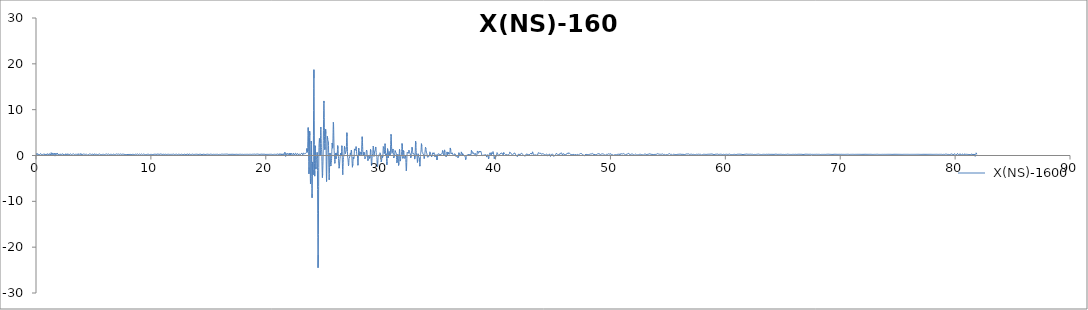
| Category |  X(NS)-1600 |
|---|---|
| 0.0 | 0 |
| 0.01 | -0.097 |
| 0.02 | -0.132 |
| 0.03 | -0.1 |
| 0.04 | -0.009 |
| 0.05 | 0.124 |
| 0.06 | 0.271 |
| 0.07 | 0.408 |
| 0.08 | 0.514 |
| 0.09 | 0.578 |
| 0.1 | 0.593 |
| 0.11 | 0.562 |
| 0.12 | 0.488 |
| 0.13 | 0.382 |
| 0.14 | 0.255 |
| 0.15 | 0.122 |
| 0.16 | 0.004 |
| 0.17 | -0.084 |
| 0.18 | -0.125 |
| 0.19 | -0.114 |
| 0.2 | -0.053 |
| 0.21 | 0.045 |
| 0.22 | 0.163 |
| 0.23 | 0.277 |
| 0.24 | 0.372 |
| 0.25 | 0.434 |
| 0.26 | 0.459 |
| 0.27 | 0.45 |
| 0.28 | 0.416 |
| 0.29 | 0.364 |
| 0.3 | 0.307 |
| 0.31 | 0.252 |
| 0.32 | 0.208 |
| 0.33 | 0.181 |
| 0.34 | 0.175 |
| 0.35 | 0.193 |
| 0.36 | 0.232 |
| 0.37 | 0.287 |
| 0.38 | 0.348 |
| 0.39 | 0.402 |
| 0.4 | 0.438 |
| 0.41 | 0.447 |
| 0.42 | 0.426 |
| 0.43 | 0.378 |
| 0.44 | 0.311 |
| 0.45 | 0.237 |
| 0.46 | 0.168 |
| 0.47 | 0.116 |
| 0.48 | 0.086 |
| 0.49 | 0.078 |
| 0.5 | 0.09 |
| 0.51 | 0.115 |
| 0.52 | 0.145 |
| 0.53 | 0.173 |
| 0.54 | 0.197 |
| 0.55 | 0.214 |
| 0.56 | 0.226 |
| 0.57 | 0.233 |
| 0.58 | 0.238 |
| 0.59 | 0.24 |
| 0.6 | 0.242 |
| 0.61 | 0.244 |
| 0.62 | 0.248 |
| 0.63 | 0.257 |
| 0.64 | 0.274 |
| 0.65 | 0.304 |
| 0.66 | 0.344 |
| 0.67 | 0.39 |
| 0.68 | 0.435 |
| 0.69 | 0.468 |
| 0.7 | 0.479 |
| 0.71 | 0.463 |
| 0.72 | 0.419 |
| 0.73 | 0.354 |
| 0.74 | 0.28 |
| 0.75 | 0.208 |
| 0.76 | 0.151 |
| 0.77 | 0.115 |
| 0.78 | 0.101 |
| 0.79 | 0.106 |
| 0.8 | 0.124 |
| 0.81 | 0.148 |
| 0.82 | 0.175 |
| 0.83 | 0.202 |
| 0.84 | 0.229 |
| 0.85 | 0.252 |
| 0.86 | 0.27 |
| 0.87 | 0.279 |
| 0.88 | 0.275 |
| 0.89 | 0.256 |
| 0.9 | 0.225 |
| 0.91 | 0.187 |
| 0.92 | 0.154 |
| 0.93 | 0.134 |
| 0.94 | 0.137 |
| 0.95 | 0.164 |
| 0.96 | 0.214 |
| 0.97 | 0.279 |
| 0.98 | 0.349 |
| 0.99 | 0.414 |
| 1.0 | 0.468 |
| 1.01 | 0.503 |
| 1.02 | 0.516 |
| 1.03 | 0.506 |
| 1.04 | 0.469 |
| 1.05 | 0.405 |
| 1.06 | 0.316 |
| 1.07 | 0.21 |
| 1.08 | 0.1 |
| 1.09 | 0.003 |
| 1.1 | -0.062 |
| 1.11 | -0.079 |
| 1.12 | -0.043 |
| 1.13 | 0.044 |
| 1.14 | 0.166 |
| 1.15 | 0.298 |
| 1.16 | 0.416 |
| 1.17 | 0.497 |
| 1.18 | 0.526 |
| 1.19 | 0.502 |
| 1.2 | 0.43 |
| 1.21 | 0.326 |
| 1.22 | 0.209 |
| 1.23 | 0.099 |
| 1.24 | 0.013 |
| 1.25 | -0.035 |
| 1.26 | -0.035 |
| 1.27 | 0.016 |
| 1.28 | 0.114 |
| 1.29 | 0.246 |
| 1.3 | 0.392 |
| 1.31 | 0.526 |
| 1.32 | 0.623 |
| 1.33 | 0.658 |
| 1.34 | 0.621 |
| 1.35 | 0.514 |
| 1.36 | 0.354 |
| 1.37 | 0.172 |
| 1.38 | 0.001 |
| 1.39 | -0.122 |
| 1.4 | -0.175 |
| 1.41 | -0.148 |
| 1.42 | -0.048 |
| 1.43 | 0.104 |
| 1.44 | 0.277 |
| 1.45 | 0.437 |
| 1.46 | 0.554 |
| 1.47 | 0.609 |
| 1.48 | 0.593 |
| 1.49 | 0.513 |
| 1.5 | 0.389 |
| 1.51 | 0.247 |
| 1.52 | 0.119 |
| 1.53 | 0.031 |
| 1.54 | 0.004 |
| 1.55 | 0.044 |
| 1.56 | 0.142 |
| 1.57 | 0.276 |
| 1.58 | 0.417 |
| 1.59 | 0.531 |
| 1.6 | 0.59 |
| 1.61 | 0.578 |
| 1.62 | 0.492 |
| 1.63 | 0.348 |
| 1.64 | 0.174 |
| 1.65 | 0.003 |
| 1.66 | -0.128 |
| 1.67 | -0.193 |
| 1.68 | -0.18 |
| 1.69 | -0.089 |
| 1.7 | 0.059 |
| 1.71 | 0.235 |
| 1.72 | 0.403 |
| 1.73 | 0.53 |
| 1.74 | 0.591 |
| 1.75 | 0.578 |
| 1.76 | 0.498 |
| 1.77 | 0.37 |
| 1.78 | 0.228 |
| 1.79 | 0.103 |
| 1.8 | 0.024 |
| 1.81 | 0.01 |
| 1.82 | 0.062 |
| 1.83 | 0.169 |
| 1.84 | 0.307 |
| 1.85 | 0.443 |
| 1.86 | 0.548 |
| 1.87 | 0.596 |
| 1.88 | 0.577 |
| 1.89 | 0.492 |
| 1.9 | 0.36 |
| 1.91 | 0.207 |
| 1.92 | 0.065 |
| 1.93 | -0.036 |
| 1.94 | -0.076 |
| 1.95 | -0.05 |
| 1.96 | 0.035 |
| 1.97 | 0.158 |
| 1.98 | 0.288 |
| 1.99 | 0.397 |
| 2.0 | 0.46 |
| 2.01 | 0.466 |
| 2.02 | 0.414 |
| 2.03 | 0.321 |
| 2.04 | 0.211 |
| 2.05 | 0.112 |
| 2.06 | 0.047 |
| 2.07 | 0.033 |
| 2.08 | 0.071 |
| 2.09 | 0.154 |
| 2.1 | 0.262 |
| 2.11 | 0.37 |
| 2.12 | 0.456 |
| 2.13 | 0.5 |
| 2.14 | 0.494 |
| 2.15 | 0.439 |
| 2.16 | 0.349 |
| 2.17 | 0.243 |
| 2.18 | 0.144 |
| 2.19 | 0.073 |
| 2.2 | 0.044 |
| 2.21 | 0.059 |
| 2.22 | 0.114 |
| 2.23 | 0.192 |
| 2.24 | 0.275 |
| 2.25 | 0.341 |
| 2.26 | 0.376 |
| 2.27 | 0.374 |
| 2.28 | 0.339 |
| 2.29 | 0.284 |
| 2.3 | 0.228 |
| 2.31 | 0.186 |
| 2.32 | 0.171 |
| 2.33 | 0.187 |
| 2.34 | 0.226 |
| 2.35 | 0.276 |
| 2.36 | 0.319 |
| 2.37 | 0.341 |
| 2.38 | 0.335 |
| 2.39 | 0.302 |
| 2.4 | 0.252 |
| 2.41 | 0.202 |
| 2.42 | 0.168 |
| 2.43 | 0.162 |
| 2.44 | 0.187 |
| 2.45 | 0.238 |
| 2.46 | 0.3 |
| 2.47 | 0.354 |
| 2.48 | 0.384 |
| 2.49 | 0.379 |
| 2.5 | 0.335 |
| 2.51 | 0.263 |
| 2.52 | 0.179 |
| 2.53 | 0.105 |
| 2.54 | 0.062 |
| 2.55 | 0.062 |
| 2.56 | 0.108 |
| 2.57 | 0.193 |
| 2.58 | 0.296 |
| 2.59 | 0.395 |
| 2.6 | 0.466 |
| 2.61 | 0.492 |
| 2.62 | 0.467 |
| 2.63 | 0.398 |
| 2.64 | 0.302 |
| 2.65 | 0.202 |
| 2.66 | 0.121 |
| 2.67 | 0.076 |
| 2.68 | 0.076 |
| 2.69 | 0.118 |
| 2.7 | 0.188 |
| 2.71 | 0.269 |
| 2.72 | 0.338 |
| 2.73 | 0.38 |
| 2.74 | 0.383 |
| 2.75 | 0.349 |
| 2.76 | 0.285 |
| 2.77 | 0.208 |
| 2.78 | 0.137 |
| 2.79 | 0.091 |
| 2.8 | 0.082 |
| 2.81 | 0.114 |
| 2.82 | 0.182 |
| 2.83 | 0.27 |
| 2.84 | 0.358 |
| 2.85 | 0.426 |
| 2.86 | 0.456 |
| 2.87 | 0.442 |
| 2.88 | 0.387 |
| 2.89 | 0.304 |
| 2.9 | 0.213 |
| 2.91 | 0.133 |
| 2.92 | 0.081 |
| 2.93 | 0.067 |
| 2.94 | 0.09 |
| 2.95 | 0.142 |
| 2.96 | 0.21 |
| 2.97 | 0.28 |
| 2.98 | 0.336 |
| 2.99 | 0.373 |
| 3.0 | 0.385 |
| 3.01 | 0.376 |
| 3.02 | 0.352 |
| 3.03 | 0.318 |
| 3.04 | 0.283 |
| 3.05 | 0.251 |
| 3.06 | 0.226 |
| 3.07 | 0.21 |
| 3.08 | 0.203 |
| 3.09 | 0.203 |
| 3.1 | 0.21 |
| 3.11 | 0.224 |
| 3.12 | 0.243 |
| 3.13 | 0.264 |
| 3.14 | 0.284 |
| 3.15 | 0.295 |
| 3.16 | 0.293 |
| 3.17 | 0.275 |
| 3.18 | 0.24 |
| 3.19 | 0.197 |
| 3.2 | 0.155 |
| 3.21 | 0.128 |
| 3.22 | 0.126 |
| 3.23 | 0.156 |
| 3.24 | 0.212 |
| 3.25 | 0.283 |
| 3.26 | 0.352 |
| 3.27 | 0.401 |
| 3.28 | 0.42 |
| 3.29 | 0.406 |
| 3.3 | 0.366 |
| 3.31 | 0.315 |
| 3.32 | 0.267 |
| 3.33 | 0.234 |
| 3.34 | 0.22 |
| 3.35 | 0.22 |
| 3.36 | 0.226 |
| 3.37 | 0.231 |
| 3.38 | 0.228 |
| 3.39 | 0.22 |
| 3.4 | 0.212 |
| 3.41 | 0.211 |
| 3.42 | 0.221 |
| 3.43 | 0.242 |
| 3.44 | 0.266 |
| 3.45 | 0.285 |
| 3.46 | 0.289 |
| 3.47 | 0.277 |
| 3.48 | 0.251 |
| 3.49 | 0.222 |
| 3.5 | 0.203 |
| 3.51 | 0.201 |
| 3.52 | 0.221 |
| 3.53 | 0.256 |
| 3.54 | 0.294 |
| 3.55 | 0.323 |
| 3.56 | 0.331 |
| 3.57 | 0.313 |
| 3.58 | 0.275 |
| 3.59 | 0.228 |
| 3.6 | 0.188 |
| 3.61 | 0.17 |
| 3.62 | 0.182 |
| 3.63 | 0.223 |
| 3.64 | 0.284 |
| 3.65 | 0.348 |
| 3.66 | 0.395 |
| 3.67 | 0.411 |
| 3.68 | 0.389 |
| 3.69 | 0.332 |
| 3.7 | 0.253 |
| 3.71 | 0.173 |
| 3.72 | 0.112 |
| 3.73 | 0.086 |
| 3.74 | 0.099 |
| 3.75 | 0.146 |
| 3.76 | 0.209 |
| 3.77 | 0.268 |
| 3.78 | 0.304 |
| 3.79 | 0.309 |
| 3.8 | 0.285 |
| 3.81 | 0.247 |
| 3.82 | 0.215 |
| 3.83 | 0.207 |
| 3.84 | 0.232 |
| 3.85 | 0.286 |
| 3.86 | 0.352 |
| 3.87 | 0.407 |
| 3.88 | 0.427 |
| 3.89 | 0.399 |
| 3.9 | 0.323 |
| 3.91 | 0.218 |
| 3.92 | 0.11 |
| 3.93 | 0.03 |
| 3.94 | 0.002 |
| 3.95 | 0.035 |
| 3.96 | 0.123 |
| 3.97 | 0.245 |
| 3.98 | 0.371 |
| 3.99 | 0.47 |
| 4.0 | 0.522 |
| 4.01 | 0.514 |
| 4.02 | 0.452 |
| 4.03 | 0.352 |
| 4.04 | 0.239 |
| 4.05 | 0.136 |
| 4.06 | 0.066 |
| 4.07 | 0.039 |
| 4.08 | 0.058 |
| 4.09 | 0.114 |
| 4.1 | 0.19 |
| 4.11 | 0.266 |
| 4.12 | 0.325 |
| 4.13 | 0.354 |
| 4.14 | 0.35 |
| 4.15 | 0.318 |
| 4.16 | 0.271 |
| 4.17 | 0.223 |
| 4.18 | 0.191 |
| 4.19 | 0.181 |
| 4.2 | 0.197 |
| 4.21 | 0.231 |
| 4.22 | 0.272 |
| 4.23 | 0.307 |
| 4.24 | 0.327 |
| 4.25 | 0.329 |
| 4.26 | 0.315 |
| 4.27 | 0.293 |
| 4.28 | 0.271 |
| 4.29 | 0.256 |
| 4.3 | 0.249 |
| 4.31 | 0.248 |
| 4.32 | 0.245 |
| 4.33 | 0.236 |
| 4.34 | 0.219 |
| 4.35 | 0.196 |
| 4.36 | 0.175 |
| 4.37 | 0.167 |
| 4.38 | 0.18 |
| 4.39 | 0.217 |
| 4.4 | 0.274 |
| 4.41 | 0.338 |
| 4.42 | 0.394 |
| 4.43 | 0.426 |
| 4.44 | 0.423 |
| 4.45 | 0.384 |
| 4.46 | 0.317 |
| 4.47 | 0.237 |
| 4.48 | 0.165 |
| 4.49 | 0.117 |
| 4.5 | 0.102 |
| 4.51 | 0.122 |
| 4.52 | 0.166 |
| 4.53 | 0.219 |
| 4.54 | 0.264 |
| 4.55 | 0.288 |
| 4.56 | 0.285 |
| 4.57 | 0.261 |
| 4.58 | 0.225 |
| 4.59 | 0.194 |
| 4.6 | 0.178 |
| 4.61 | 0.186 |
| 4.62 | 0.217 |
| 4.63 | 0.26 |
| 4.64 | 0.305 |
| 4.65 | 0.336 |
| 4.66 | 0.347 |
| 4.67 | 0.336 |
| 4.68 | 0.308 |
| 4.69 | 0.274 |
| 4.7 | 0.245 |
| 4.71 | 0.23 |
| 4.72 | 0.232 |
| 4.73 | 0.248 |
| 4.74 | 0.27 |
| 4.75 | 0.288 |
| 4.76 | 0.295 |
| 4.77 | 0.288 |
| 4.78 | 0.268 |
| 4.79 | 0.241 |
| 4.8 | 0.215 |
| 4.81 | 0.197 |
| 4.82 | 0.19 |
| 4.83 | 0.194 |
| 4.84 | 0.206 |
| 4.85 | 0.223 |
| 4.86 | 0.241 |
| 4.87 | 0.257 |
| 4.88 | 0.273 |
| 4.89 | 0.289 |
| 4.9 | 0.306 |
| 4.91 | 0.324 |
| 4.92 | 0.338 |
| 4.93 | 0.344 |
| 4.94 | 0.336 |
| 4.95 | 0.311 |
| 4.96 | 0.27 |
| 4.97 | 0.219 |
| 4.98 | 0.168 |
| 4.99 | 0.129 |
| 5.0 | 0.111 |
| 5.01 | 0.121 |
| 5.02 | 0.156 |
| 5.03 | 0.21 |
| 5.04 | 0.27 |
| 5.05 | 0.324 |
| 5.06 | 0.358 |
| 5.07 | 0.369 |
| 5.08 | 0.356 |
| 5.09 | 0.326 |
| 5.1 | 0.288 |
| 5.11 | 0.254 |
| 5.12 | 0.23 |
| 5.13 | 0.219 |
| 5.14 | 0.22 |
| 5.15 | 0.226 |
| 5.16 | 0.233 |
| 5.17 | 0.236 |
| 5.18 | 0.233 |
| 5.19 | 0.228 |
| 5.2 | 0.225 |
| 5.21 | 0.23 |
| 5.22 | 0.244 |
| 5.23 | 0.267 |
| 5.24 | 0.293 |
| 5.25 | 0.315 |
| 5.26 | 0.326 |
| 5.27 | 0.322 |
| 5.28 | 0.302 |
| 5.29 | 0.271 |
| 5.3 | 0.237 |
| 5.31 | 0.208 |
| 5.32 | 0.191 |
| 5.33 | 0.19 |
| 5.34 | 0.203 |
| 5.35 | 0.226 |
| 5.36 | 0.251 |
| 5.37 | 0.271 |
| 5.38 | 0.281 |
| 5.39 | 0.279 |
| 5.4 | 0.266 |
| 5.41 | 0.248 |
| 5.42 | 0.231 |
| 5.43 | 0.221 |
| 5.44 | 0.222 |
| 5.45 | 0.235 |
| 5.46 | 0.259 |
| 5.47 | 0.289 |
| 5.48 | 0.318 |
| 5.49 | 0.34 |
| 5.5 | 0.348 |
| 5.51 | 0.338 |
| 5.52 | 0.312 |
| 5.53 | 0.273 |
| 5.54 | 0.23 |
| 5.55 | 0.191 |
| 5.56 | 0.166 |
| 5.57 | 0.159 |
| 5.58 | 0.172 |
| 5.59 | 0.201 |
| 5.6 | 0.238 |
| 5.61 | 0.275 |
| 5.62 | 0.3 |
| 5.63 | 0.309 |
| 5.64 | 0.299 |
| 5.65 | 0.274 |
| 5.66 | 0.243 |
| 5.67 | 0.215 |
| 5.68 | 0.199 |
| 5.69 | 0.2 |
| 5.7 | 0.218 |
| 5.71 | 0.247 |
| 5.72 | 0.279 |
| 5.73 | 0.306 |
| 5.74 | 0.318 |
| 5.75 | 0.314 |
| 5.76 | 0.296 |
| 5.77 | 0.27 |
| 5.78 | 0.244 |
| 5.79 | 0.224 |
| 5.8 | 0.215 |
| 5.81 | 0.216 |
| 5.82 | 0.224 |
| 5.83 | 0.234 |
| 5.84 | 0.243 |
| 5.85 | 0.249 |
| 5.86 | 0.255 |
| 5.87 | 0.262 |
| 5.88 | 0.274 |
| 5.89 | 0.29 |
| 5.9 | 0.308 |
| 5.91 | 0.321 |
| 5.92 | 0.323 |
| 5.93 | 0.31 |
| 5.94 | 0.283 |
| 5.95 | 0.247 |
| 5.96 | 0.211 |
| 5.97 | 0.185 |
| 5.98 | 0.176 |
| 5.99 | 0.186 |
| 6.0 | 0.21 |
| 6.01 | 0.24 |
| 6.02 | 0.266 |
| 6.03 | 0.28 |
| 6.04 | 0.279 |
| 6.05 | 0.268 |
| 6.06 | 0.254 |
| 6.07 | 0.246 |
| 6.08 | 0.251 |
| 6.09 | 0.271 |
| 6.1 | 0.301 |
| 6.11 | 0.332 |
| 6.12 | 0.353 |
| 6.13 | 0.355 |
| 6.14 | 0.333 |
| 6.15 | 0.291 |
| 6.16 | 0.239 |
| 6.17 | 0.188 |
| 6.18 | 0.151 |
| 6.19 | 0.137 |
| 6.2 | 0.146 |
| 6.21 | 0.173 |
| 6.22 | 0.209 |
| 6.23 | 0.242 |
| 6.24 | 0.265 |
| 6.25 | 0.273 |
| 6.26 | 0.269 |
| 6.27 | 0.26 |
| 6.28 | 0.256 |
| 6.29 | 0.262 |
| 6.3 | 0.279 |
| 6.31 | 0.304 |
| 6.32 | 0.325 |
| 6.33 | 0.333 |
| 6.34 | 0.32 |
| 6.35 | 0.286 |
| 6.36 | 0.239 |
| 6.37 | 0.19 |
| 6.38 | 0.154 |
| 6.39 | 0.143 |
| 6.4 | 0.158 |
| 6.41 | 0.197 |
| 6.42 | 0.247 |
| 6.43 | 0.293 |
| 6.44 | 0.325 |
| 6.45 | 0.337 |
| 6.46 | 0.33 |
| 6.47 | 0.311 |
| 6.48 | 0.29 |
| 6.49 | 0.274 |
| 6.5 | 0.265 |
| 6.51 | 0.262 |
| 6.52 | 0.257 |
| 6.53 | 0.245 |
| 6.54 | 0.226 |
| 6.55 | 0.202 |
| 6.56 | 0.184 |
| 6.57 | 0.181 |
| 6.58 | 0.199 |
| 6.59 | 0.238 |
| 6.6 | 0.29 |
| 6.61 | 0.34 |
| 6.62 | 0.372 |
| 6.63 | 0.374 |
| 6.64 | 0.344 |
| 6.65 | 0.288 |
| 6.66 | 0.22 |
| 6.67 | 0.159 |
| 6.68 | 0.121 |
| 6.69 | 0.115 |
| 6.7 | 0.14 |
| 6.71 | 0.187 |
| 6.72 | 0.243 |
| 6.73 | 0.294 |
| 6.74 | 0.331 |
| 6.75 | 0.348 |
| 6.76 | 0.348 |
| 6.77 | 0.335 |
| 6.78 | 0.315 |
| 6.79 | 0.293 |
| 6.8 | 0.271 |
| 6.81 | 0.248 |
| 6.82 | 0.226 |
| 6.83 | 0.208 |
| 6.84 | 0.196 |
| 6.85 | 0.197 |
| 6.86 | 0.213 |
| 6.87 | 0.241 |
| 6.88 | 0.276 |
| 6.89 | 0.308 |
| 6.9 | 0.325 |
| 6.91 | 0.32 |
| 6.92 | 0.292 |
| 6.93 | 0.247 |
| 6.94 | 0.197 |
| 6.95 | 0.158 |
| 6.96 | 0.141 |
| 6.97 | 0.153 |
| 6.98 | 0.19 |
| 6.99 | 0.242 |
| 7.0 | 0.293 |
| 7.01 | 0.33 |
| 7.02 | 0.344 |
| 7.03 | 0.333 |
| 7.04 | 0.306 |
| 7.05 | 0.273 |
| 7.06 | 0.245 |
| 7.07 | 0.23 |
| 7.08 | 0.23 |
| 7.09 | 0.241 |
| 7.1 | 0.254 |
| 7.11 | 0.261 |
| 7.12 | 0.258 |
| 7.13 | 0.247 |
| 7.14 | 0.234 |
| 7.15 | 0.227 |
| 7.16 | 0.233 |
| 7.17 | 0.252 |
| 7.18 | 0.28 |
| 7.19 | 0.306 |
| 7.2 | 0.322 |
| 7.21 | 0.318 |
| 7.22 | 0.294 |
| 7.23 | 0.256 |
| 7.24 | 0.215 |
| 7.25 | 0.184 |
| 7.26 | 0.172 |
| 7.27 | 0.18 |
| 7.28 | 0.203 |
| 7.29 | 0.228 |
| 7.3 | 0.246 |
| 7.31 | 0.251 |
| 7.32 | 0.243 |
| 7.33 | 0.232 |
| 7.34 | 0.23 |
| 7.35 | 0.243 |
| 7.36 | 0.274 |
| 7.37 | 0.313 |
| 7.38 | 0.347 |
| 7.39 | 0.36 |
| 7.4 | 0.344 |
| 7.41 | 0.299 |
| 7.42 | 0.239 |
| 7.43 | 0.182 |
| 7.44 | 0.146 |
| 7.45 | 0.142 |
| 7.46 | 0.169 |
| 7.47 | 0.214 |
| 7.48 | 0.261 |
| 7.49 | 0.295 |
| 7.5 | 0.307 |
| 7.51 | 0.302 |
| 7.52 | 0.29 |
| 7.53 | 0.284 |
| 7.54 | 0.291 |
| 7.55 | 0.307 |
| 7.56 | 0.323 |
| 7.57 | 0.324 |
| 7.58 | 0.299 |
| 7.59 | 0.25 |
| 7.6 | 0.189 |
| 7.61 | 0.137 |
| 7.62 | 0.114 |
| 7.63 | 0.131 |
| 7.64 | 0.186 |
| 7.65 | 0.262 |
| 7.66 | 0.332 |
| 7.67 | 0.371 |
| 7.68 | 0.368 |
| 7.69 | 0.326 |
| 7.7 | 0.262 |
| 7.71 | 0.203 |
| 7.72 | 0.171 |
| 7.73 | 0.179 |
| 7.74 | 0.22 |
| 7.75 | 0.276 |
| 7.76 | 0.323 |
| 7.77 | 0.34 |
| 7.78 | 0.321 |
| 7.79 | 0.272 |
| 7.8 | 0.213 |
| 7.81 | 0.167 |
| 7.82 | 0.151 |
| 7.83 | 0.171 |
| 7.84 | 0.217 |
| 7.85 | 0.27 |
| 7.86 | 0.31 |
| 7.87 | 0.322 |
| 7.88 | 0.303 |
| 7.89 | 0.264 |
| 7.9 | 0.221 |
| 7.91 | 0.194 |
| 7.92 | 0.194 |
| 7.93 | 0.221 |
| 7.94 | 0.264 |
| 7.95 | 0.309 |
| 7.96 | 0.338 |
| 7.97 | 0.344 |
| 7.98 | 0.328 |
| 7.99 | 0.298 |
| 8.0 | 0.266 |
| 8.01 | 0.245 |
| 8.02 | 0.237 |
| 8.03 | 0.239 |
| 8.04 | 0.244 |
| 8.05 | 0.243 |
| 8.06 | 0.233 |
| 8.07 | 0.217 |
| 8.08 | 0.202 |
| 8.09 | 0.197 |
| 8.1 | 0.205 |
| 8.11 | 0.226 |
| 8.12 | 0.25 |
| 8.13 | 0.267 |
| 8.14 | 0.271 |
| 8.15 | 0.262 |
| 8.16 | 0.246 |
| 8.17 | 0.236 |
| 8.18 | 0.239 |
| 8.19 | 0.258 |
| 8.2 | 0.284 |
| 8.21 | 0.305 |
| 8.22 | 0.307 |
| 8.23 | 0.284 |
| 8.24 | 0.242 |
| 8.25 | 0.196 |
| 8.26 | 0.165 |
| 8.27 | 0.165 |
| 8.28 | 0.198 |
| 8.29 | 0.254 |
| 8.3 | 0.313 |
| 8.31 | 0.354 |
| 8.32 | 0.365 |
| 8.33 | 0.346 |
| 8.34 | 0.308 |
| 8.35 | 0.272 |
| 8.36 | 0.249 |
| 8.37 | 0.244 |
| 8.38 | 0.249 |
| 8.39 | 0.249 |
| 8.4 | 0.234 |
| 8.41 | 0.201 |
| 8.42 | 0.162 |
| 8.43 | 0.137 |
| 8.44 | 0.144 |
| 8.45 | 0.191 |
| 8.46 | 0.267 |
| 8.47 | 0.35 |
| 8.48 | 0.409 |
| 8.49 | 0.424 |
| 8.5 | 0.389 |
| 8.51 | 0.319 |
| 8.52 | 0.239 |
| 8.53 | 0.179 |
| 8.54 | 0.154 |
| 8.55 | 0.166 |
| 8.56 | 0.199 |
| 8.57 | 0.233 |
| 8.58 | 0.251 |
| 8.59 | 0.247 |
| 8.6 | 0.232 |
| 8.61 | 0.22 |
| 8.62 | 0.227 |
| 8.63 | 0.256 |
| 8.64001 | 0.298 |
| 8.65 | 0.336 |
| 8.66 | 0.353 |
| 8.67 | 0.34 |
| 8.68001 | 0.302 |
| 8.69 | 0.254 |
| 8.7 | 0.216 |
| 8.71 | 0.2 |
| 8.72001 | 0.206 |
| 8.73 | 0.225 |
| 8.74 | 0.242 |
| 8.75 | 0.245 |
| 8.76 | 0.233 |
| 8.77 | 0.216 |
| 8.78 | 0.206 |
| 8.79 | 0.218 |
| 8.8 | 0.251 |
| 8.81001 | 0.298 |
| 8.82 | 0.34 |
| 8.83 | 0.361 |
| 8.84 | 0.353 |
| 8.85001 | 0.316 |
| 8.86 | 0.266 |
| 8.87 | 0.218 |
| 8.88 | 0.188 |
| 8.89001 | 0.179 |
| 8.9 | 0.186 |
| 8.91 | 0.201 |
| 8.92 | 0.214 |
| 8.93001 | 0.22 |
| 8.94 | 0.223 |
| 8.95 | 0.229 |
| 8.96 | 0.242 |
| 8.97001 | 0.264 |
| 8.98001 | 0.288 |
| 8.99 | 0.308 |
| 9.0 | 0.317 |
| 9.01 | 0.313 |
| 9.02001 | 0.301 |
| 9.03 | 0.289 |
| 9.04 | 0.282 |
| 9.05 | 0.28 |
| 9.06001 | 0.279 |
| 9.07 | 0.27 |
| 9.08 | 0.248 |
| 9.09 | 0.216 |
| 9.10001 | 0.182 |
| 9.11 | 0.16 |
| 9.12 | 0.161 |
| 9.13 | 0.188 |
| 9.14001 | 0.234 |
| 9.15001 | 0.285 |
| 9.16 | 0.324 |
| 9.17 | 0.341 |
| 9.18001 | 0.333 |
| 9.19001 | 0.309 |
| 9.2 | 0.282 |
| 9.21 | 0.262 |
| 9.22001 | 0.254 |
| 9.23001 | 0.254 |
| 9.24 | 0.251 |
| 9.25 | 0.24 |
| 9.26 | 0.216 |
| 9.27001 | 0.188 |
| 9.28 | 0.166 |
| 9.29 | 0.162 |
| 9.3 | 0.182 |
| 9.31001 | 0.221 |
| 9.32001 | 0.268 |
| 9.33 | 0.308 |
| 9.34 | 0.33 |
| 9.35001 | 0.331 |
| 9.36001 | 0.314 |
| 9.37 | 0.29 |
| 9.38 | 0.266 |
| 9.39001 | 0.249 |
| 9.40001 | 0.239 |
| 9.41 | 0.232 |
| 9.42 | 0.226 |
| 9.43001 | 0.222 |
| 9.44001 | 0.224 |
| 9.45001 | 0.235 |
| 9.46 | 0.259 |
| 9.47001 | 0.291 |
| 9.48001 | 0.322 |
| 9.49001 | 0.34 |
| 9.5 | 0.338 |
| 9.51 | 0.312 |
| 9.52001 | 0.272 |
| 9.53001 | 0.228 |
| 9.54 | 0.196 |
| 9.55 | 0.185 |
| 9.56001 | 0.195 |
| 9.57001 | 0.219 |
| 9.58 | 0.245 |
| 9.59 | 0.261 |
| 9.60001 | 0.264 |
| 9.61001 | 0.254 |
| 9.62001 | 0.239 |
| 9.63 | 0.228 |
| 9.64001 | 0.227 |
| 9.65001 | 0.235 |
| 9.66001 | 0.249 |
| 9.67 | 0.263 |
| 9.68001 | 0.272 |
| 9.69001 | 0.275 |
| 9.70001 | 0.274 |
| 9.71 | 0.272 |
| 9.72001 | 0.272 |
| 9.73001 | 0.271 |
| 9.74001 | 0.268 |
| 9.75 | 0.259 |
| 9.76 | 0.244 |
| 9.77001 | 0.228 |
| 9.78001 | 0.217 |
| 9.79001 | 0.218 |
| 9.8 | 0.236 |
| 9.81001 | 0.267 |
| 9.82001 | 0.301 |
| 9.83001 | 0.325 |
| 9.84 | 0.328 |
| 9.85001 | 0.307 |
| 9.86001 | 0.266 |
| 9.87001 | 0.217 |
| 9.88 | 0.175 |
| 9.89001 | 0.154 |
| 9.90001 | 0.158 |
| 9.91001 | 0.186 |
| 9.92001 | 0.226 |
| 9.93001 | 0.264 |
| 9.94001 | 0.29 |
| 9.95001 | 0.299 |
| 9.96001 | 0.292 |
| 9.97001 | 0.277 |
| 9.98001 | 0.263 |
| 9.99001 | 0.256 |
| 10.00001 | 0.259 |
| 10.01 | 0.268 |
| 10.02001 | 0.277 |
| 10.03001 | 0.28 |
| 10.04001 | 0.275 |
| 10.05 | 0.262 |
| 10.06001 | 0.246 |
| 10.07001 | 0.235 |
| 10.08001 | 0.232 |
| 10.09001 | 0.24 |
| 10.10001 | 0.254 |
| 10.11001 | 0.269 |
| 10.12001 | 0.278 |
| 10.13001 | 0.275 |
| 10.14001 | 0.261 |
| 10.15001 | 0.238 |
| 10.16001 | 0.215 |
| 10.17001 | 0.2 |
| 10.18001 | 0.199 |
| 10.19001 | 0.216 |
| 10.20001 | 0.246 |
| 10.21001 | 0.281 |
| 10.22001 | 0.311 |
| 10.23001 | 0.326 |
| 10.24001 | 0.322 |
| 10.25001 | 0.299 |
| 10.26001 | 0.264 |
| 10.27001 | 0.228 |
| 10.28001 | 0.203 |
| 10.29001 | 0.196 |
| 10.30001 | 0.208 |
| 10.31001 | 0.232 |
| 10.32001 | 0.261 |
| 10.33001 | 0.283 |
| 10.34001 | 0.291 |
| 10.35001 | 0.284 |
| 10.36001 | 0.266 |
| 10.37001 | 0.246 |
| 10.38001 | 0.232 |
| 10.39001 | 0.231 |
| 10.40001 | 0.24 |
| 10.41001 | 0.256 |
| 10.42001 | 0.269 |
| 10.43001 | 0.274 |
| 10.44001 | 0.27 |
| 10.45001 | 0.262 |
| 10.46001 | 0.255 |
| 10.47001 | 0.256 |
| 10.48001 | 0.268 |
| 10.49001 | 0.285 |
| 10.50001 | 0.299 |
| 10.51001 | 0.298 |
| 10.52001 | 0.278 |
| 10.53001 | 0.24 |
| 10.54001 | 0.198 |
| 10.55001 | 0.165 |
| 10.56001 | 0.157 |
| 10.57001 | 0.18 |
| 10.58001 | 0.229 |
| 10.59001 | 0.288 |
| 10.60001 | 0.34 |
| 10.61001 | 0.366 |
| 10.62001 | 0.36 |
| 10.63001 | 0.327 |
| 10.64001 | 0.279 |
| 10.65001 | 0.233 |
| 10.66001 | 0.203 |
| 10.67001 | 0.192 |
| 10.68001 | 0.196 |
| 10.69001 | 0.205 |
| 10.70001 | 0.211 |
| 10.71001 | 0.21 |
| 10.72001 | 0.207 |
| 10.73001 | 0.211 |
| 10.74001 | 0.229 |
| 10.75001 | 0.265 |
| 10.76001 | 0.31 |
| 10.77001 | 0.352 |
| 10.78001 | 0.374 |
| 10.79001 | 0.364 |
| 10.80001 | 0.322 |
| 10.81001 | 0.259 |
| 10.82001 | 0.194 |
| 10.83001 | 0.146 |
| 10.84001 | 0.129 |
| 10.85001 | 0.146 |
| 10.86001 | 0.188 |
| 10.87001 | 0.241 |
| 10.88001 | 0.29 |
| 10.89001 | 0.322 |
| 10.90001 | 0.335 |
| 10.91001 | 0.331 |
| 10.92001 | 0.319 |
| 10.93001 | 0.303 |
| 10.94001 | 0.287 |
| 10.95001 | 0.271 |
| 10.96001 | 0.254 |
| 10.97001 | 0.234 |
| 10.98001 | 0.213 |
| 10.99001 | 0.197 |
| 11.00001 | 0.189 |
| 11.01001 | 0.194 |
| 11.02001 | 0.211 |
| 11.03001 | 0.235 |
| 11.04001 | 0.26 |
| 11.05001 | 0.28 |
| 11.06001 | 0.291 |
| 11.07001 | 0.294 |
| 11.08001 | 0.291 |
| 11.09001 | 0.286 |
| 11.10001 | 0.282 |
| 11.11001 | 0.278 |
| 11.12001 | 0.272 |
| 11.13001 | 0.261 |
| 11.14001 | 0.247 |
| 11.15001 | 0.231 |
| 11.16001 | 0.217 |
| 11.17001 | 0.211 |
| 11.18001 | 0.216 |
| 11.19001 | 0.231 |
| 11.20001 | 0.253 |
| 11.21001 | 0.275 |
| 11.22001 | 0.292 |
| 11.23001 | 0.3 |
| 11.24001 | 0.298 |
| 11.25001 | 0.289 |
| 11.26001 | 0.276 |
| 11.27001 | 0.262 |
| 11.28001 | 0.251 |
| 11.29001 | 0.242 |
| 11.30001 | 0.236 |
| 11.31001 | 0.23 |
| 11.32001 | 0.227 |
| 11.33001 | 0.226 |
| 11.34001 | 0.228 |
| 11.35001 | 0.234 |
| 11.36001 | 0.243 |
| 11.37001 | 0.253 |
| 11.38001 | 0.261 |
| 11.39001 | 0.265 |
| 11.40001 | 0.265 |
| 11.41001 | 0.262 |
| 11.42001 | 0.257 |
| 11.43001 | 0.253 |
| 11.44001 | 0.249 |
| 11.45001 | 0.247 |
| 11.46001 | 0.246 |
| 11.47001 | 0.246 |
| 11.48001 | 0.249 |
| 11.49001 | 0.253 |
| 11.50001 | 0.26 |
| 11.51001 | 0.268 |
| 11.52001 | 0.276 |
| 11.53001 | 0.28 |
| 11.54001 | 0.277 |
| 11.55001 | 0.266 |
| 11.56001 | 0.248 |
| 11.57001 | 0.23 |
| 11.58001 | 0.215 |
| 11.59001 | 0.211 |
| 11.60001 | 0.22 |
| 11.61001 | 0.239 |
| 11.62001 | 0.265 |
| 11.63001 | 0.289 |
| 11.64001 | 0.305 |
| 11.65001 | 0.309 |
| 11.66001 | 0.302 |
| 11.67001 | 0.287 |
| 11.68001 | 0.27 |
| 11.69001 | 0.254 |
| 11.70001 | 0.243 |
| 11.71001 | 0.236 |
| 11.72001 | 0.232 |
| 11.73001 | 0.229 |
| 11.74001 | 0.226 |
| 11.75001 | 0.224 |
| 11.76001 | 0.224 |
| 11.77001 | 0.229 |
| 11.78001 | 0.239 |
| 11.79001 | 0.25 |
| 11.80001 | 0.262 |
| 11.81001 | 0.271 |
| 11.82001 | 0.275 |
| 11.83001 | 0.275 |
| 11.84001 | 0.273 |
| 11.85001 | 0.27 |
| 11.86001 | 0.267 |
| 11.87001 | 0.262 |
| 11.88001 | 0.256 |
| 11.89001 | 0.247 |
| 11.90001 | 0.236 |
| 11.91001 | 0.226 |
| 11.92001 | 0.222 |
| 11.93001 | 0.226 |
| 11.94001 | 0.24 |
| 11.95001 | 0.261 |
| 11.96001 | 0.285 |
| 11.97001 | 0.302 |
| 11.98001 | 0.308 |
| 11.99001 | 0.299 |
| 12.00001 | 0.277 |
| 12.01001 | 0.248 |
| 12.02001 | 0.221 |
| 12.03001 | 0.202 |
| 12.04001 | 0.197 |
| 12.05001 | 0.205 |
| 12.06001 | 0.223 |
| 12.07001 | 0.245 |
| 12.08001 | 0.266 |
| 12.09001 | 0.281 |
| 12.10001 | 0.29 |
| 12.11001 | 0.291 |
| 12.12001 | 0.288 |
| 12.13001 | 0.28 |
| 12.14001 | 0.269 |
| 12.15001 | 0.256 |
| 12.16001 | 0.241 |
| 12.17001 | 0.225 |
| 12.18001 | 0.21 |
| 12.19001 | 0.202 |
| 12.20001 | 0.201 |
| 12.21001 | 0.21 |
| 12.22001 | 0.23 |
| 12.23001 | 0.258 |
| 12.24001 | 0.288 |
| 12.25001 | 0.315 |
| 12.26001 | 0.333 |
| 12.27001 | 0.337 |
| 12.28001 | 0.326 |
| 12.29001 | 0.302 |
| 12.30001 | 0.269 |
| 12.31001 | 0.234 |
| 12.32001 | 0.205 |
| 12.33001 | 0.187 |
| 12.34001 | 0.182 |
| 12.35001 | 0.191 |
| 12.36001 | 0.209 |
| 12.37001 | 0.233 |
| 12.38001 | 0.256 |
| 12.39001 | 0.275 |
| 12.40001 | 0.288 |
| 12.41001 | 0.294 |
| 12.42001 | 0.292 |
| 12.43001 | 0.285 |
| 12.44001 | 0.271 |
| 12.45001 | 0.254 |
| 12.46001 | 0.234 |
| 12.47001 | 0.217 |
| 12.48001 | 0.207 |
| 12.49001 | 0.207 |
| 12.50001 | 0.22 |
| 12.51001 | 0.245 |
| 12.52001 | 0.274 |
| 12.53001 | 0.302 |
| 12.54001 | 0.321 |
| 12.55001 | 0.324 |
| 12.56001 | 0.313 |
| 12.57001 | 0.29 |
| 12.58001 | 0.262 |
| 12.59001 | 0.236 |
| 12.60001 | 0.217 |
| 12.61001 | 0.208 |
| 12.62001 | 0.206 |
| 12.63001 | 0.211 |
| 12.64001 | 0.22 |
| 12.65001 | 0.232 |
| 12.66001 | 0.247 |
| 12.67001 | 0.264 |
| 12.68001 | 0.282 |
| 12.69001 | 0.297 |
| 12.70001 | 0.304 |
| 12.71001 | 0.298 |
| 12.72001 | 0.279 |
| 12.73001 | 0.248 |
| 12.74001 | 0.212 |
| 12.75001 | 0.182 |
| 12.76001 | 0.167 |
| 12.77001 | 0.172 |
| 12.78001 | 0.199 |
| 12.79001 | 0.24 |
| 12.80001 | 0.286 |
| 12.81001 | 0.324 |
| 12.82001 | 0.348 |
| 12.83001 | 0.35 |
| 12.84001 | 0.333 |
| 12.85001 | 0.302 |
| 12.86001 | 0.266 |
| 12.87001 | 0.232 |
| 12.88001 | 0.206 |
| 12.89001 | 0.194 |
| 12.90001 | 0.196 |
| 12.91001 | 0.208 |
| 12.92001 | 0.229 |
| 12.93001 | 0.253 |
| 12.94001 | 0.276 |
| 12.95001 | 0.295 |
| 12.96001 | 0.306 |
| 12.97001 | 0.308 |
| 12.98001 | 0.3 |
| 12.99001 | 0.283 |
| 13.00001 | 0.259 |
| 13.01001 | 0.23 |
| 13.02001 | 0.202 |
| 13.03001 | 0.178 |
| 13.04001 | 0.165 |
| 13.05001 | 0.168 |
| 13.06001 | 0.188 |
| 13.07001 | 0.224 |
| 13.08001 | 0.27 |
| 13.09001 | 0.317 |
| 13.10001 | 0.354 |
| 13.11001 | 0.372 |
| 13.12001 | 0.366 |
| 13.13001 | 0.335 |
| 13.14001 | 0.288 |
| 13.15001 | 0.235 |
| 13.16001 | 0.188 |
| 13.17001 | 0.157 |
| 13.18001 | 0.149 |
| 13.19001 | 0.163 |
| 13.20001 | 0.194 |
| 13.21001 | 0.234 |
| 13.22001 | 0.276 |
| 13.23001 | 0.31 |
| 13.24001 | 0.331 |
| 13.25001 | 0.336 |
| 13.26001 | 0.324 |
| 13.27001 | 0.297 |
| 13.28001 | 0.258 |
| 13.29001 | 0.214 |
| 13.30001 | 0.175 |
| 13.31001 | 0.15 |
| 13.32001 | 0.147 |
| 13.33001 | 0.169 |
| 13.34001 | 0.213 |
| 13.35001 | 0.27 |
| 13.36001 | 0.326 |
| 13.37001 | 0.366 |
| 13.38001 | 0.381 |
| 13.39001 | 0.366 |
| 13.40001 | 0.326 |
| 13.41001 | 0.272 |
| 13.42001 | 0.219 |
| 13.43001 | 0.18 |
| 13.44001 | 0.163 |
| 13.45001 | 0.169 |
| 13.46001 | 0.194 |
| 13.47001 | 0.229 |
| 13.48001 | 0.265 |
| 13.49001 | 0.295 |
| 13.50001 | 0.313 |
| 13.51001 | 0.319 |
| 13.52001 | 0.312 |
| 13.53001 | 0.296 |
| 13.54001 | 0.273 |
| 13.55001 | 0.246 |
| 13.56001 | 0.219 |
| 13.57001 | 0.198 |
| 13.58001 | 0.186 |
| 13.59001 | 0.188 |
| 13.60001 | 0.202 |
| 13.61001 | 0.228 |
| 13.62001 | 0.258 |
| 13.63001 | 0.286 |
| 13.64001 | 0.305 |
| 13.65001 | 0.31 |
| 13.66001 | 0.302 |
| 13.67001 | 0.283 |
| 13.68001 | 0.26 |
| 13.69001 | 0.238 |
| 13.70001 | 0.222 |
| 13.71001 | 0.215 |
| 13.72001 | 0.216 |
| 13.73001 | 0.225 |
| 13.74001 | 0.238 |
| 13.75001 | 0.252 |
| 13.76001 | 0.266 |
| 13.77001 | 0.277 |
| 13.78001 | 0.282 |
| 13.79001 | 0.282 |
| 13.80001 | 0.275 |
| 13.81001 | 0.262 |
| 13.82001 | 0.248 |
| 13.83001 | 0.238 |
| 13.84001 | 0.234 |
| 13.85001 | 0.241 |
| 13.86001 | 0.257 |
| 13.87001 | 0.276 |
| 13.88001 | 0.294 |
| 13.89001 | 0.301 |
| 13.90001 | 0.295 |
| 13.91001 | 0.276 |
| 13.92001 | 0.25 |
| 13.93001 | 0.223 |
| 13.94001 | 0.206 |
| 13.95001 | 0.203 |
| 13.96001 | 0.213 |
| 13.97001 | 0.233 |
| 13.98001 | 0.256 |
| 13.99001 | 0.274 |
| 14.00001 | 0.282 |
| 14.01001 | 0.281 |
| 14.02001 | 0.273 |
| 14.03001 | 0.262 |
| 14.04001 | 0.253 |
| 14.05001 | 0.248 |
| 14.06001 | 0.246 |
| 14.07001 | 0.246 |
| 14.08001 | 0.246 |
| 14.09001 | 0.246 |
| 14.10001 | 0.245 |
| 14.11001 | 0.246 |
| 14.12001 | 0.249 |
| 14.13001 | 0.253 |
| 14.14001 | 0.256 |
| 14.15001 | 0.255 |
| 14.16001 | 0.248 |
| 14.17001 | 0.235 |
| 14.18001 | 0.219 |
| 14.19001 | 0.206 |
| 14.20001 | 0.199 |
| 14.21001 | 0.203 |
| 14.22001 | 0.218 |
| 14.23001 | 0.241 |
| 14.24001 | 0.266 |
| 14.25001 | 0.287 |
| 14.26001 | 0.3 |
| 14.27001 | 0.303 |
| 14.28001 | 0.295 |
| 14.29001 | 0.28 |
| 14.30001 | 0.262 |
| 14.31001 | 0.245 |
| 14.32001 | 0.232 |
| 14.33001 | 0.228 |
| 14.34001 | 0.234 |
| 14.35001 | 0.249 |
| 14.36001 | 0.271 |
| 14.37001 | 0.295 |
| 14.38001 | 0.315 |
| 14.39001 | 0.324 |
| 14.40001 | 0.319 |
| 14.41001 | 0.299 |
| 14.42001 | 0.267 |
| 14.43001 | 0.232 |
| 14.44001 | 0.203 |
| 14.45001 | 0.187 |
| 14.46001 | 0.189 |
| 14.47001 | 0.208 |
| 14.48001 | 0.24 |
| 14.49001 | 0.274 |
| 14.50001 | 0.302 |
| 14.51001 | 0.319 |
| 14.52001 | 0.32 |
| 14.53001 | 0.307 |
| 14.54001 | 0.285 |
| 14.55001 | 0.26 |
| 14.56001 | 0.236 |
| 14.57001 | 0.219 |
| 14.58001 | 0.211 |
| 14.59001 | 0.211 |
| 14.60001 | 0.22 |
| 14.61001 | 0.234 |
| 14.62001 | 0.253 |
| 14.63001 | 0.271 |
| 14.64001 | 0.286 |
| 14.65001 | 0.294 |
| 14.66001 | 0.293 |
| 14.67001 | 0.282 |
| 14.68001 | 0.263 |
| 14.69001 | 0.241 |
| 14.70001 | 0.221 |
| 14.71001 | 0.209 |
| 14.72001 | 0.208 |
| 14.73001 | 0.219 |
| 14.74001 | 0.24 |
| 14.75001 | 0.265 |
| 14.76001 | 0.288 |
| 14.77001 | 0.302 |
| 14.78001 | 0.304 |
| 14.79001 | 0.293 |
| 14.80001 | 0.272 |
| 14.81001 | 0.247 |
| 14.82001 | 0.226 |
| 14.83001 | 0.216 |
| 14.84001 | 0.219 |
| 14.85001 | 0.234 |
| 14.86001 | 0.258 |
| 14.87001 | 0.281 |
| 14.88001 | 0.296 |
| 14.89001 | 0.299 |
| 14.90001 | 0.288 |
| 14.91001 | 0.268 |
| 14.92001 | 0.246 |
| 14.93001 | 0.227 |
| 14.94001 | 0.218 |
| 14.95001 | 0.219 |
| 14.96001 | 0.229 |
| 14.97001 | 0.243 |
| 14.98001 | 0.256 |
| 14.99001 | 0.264 |
| 15.00001 | 0.266 |
| 15.01001 | 0.264 |
| 15.02001 | 0.26 |
| 15.03001 | 0.254 |
| 15.04001 | 0.249 |
| 15.05001 | 0.243 |
| 15.06001 | 0.236 |
| 15.07001 | 0.23 |
| 15.08001 | 0.226 |
| 15.09001 | 0.228 |
| 15.10001 | 0.24 |
| 15.11001 | 0.26 |
| 15.12001 | 0.285 |
| 15.13001 | 0.311 |
| 15.14001 | 0.329 |
| 15.15001 | 0.333 |
| 15.16001 | 0.32 |
| 15.17001 | 0.294 |
| 15.18001 | 0.261 |
| 15.19001 | 0.23 |
| 15.20001 | 0.209 |
| 15.21001 | 0.203 |
| 15.22001 | 0.21 |
| 15.23001 | 0.227 |
| 15.24001 | 0.247 |
| 15.25001 | 0.264 |
| 15.26001 | 0.274 |
| 15.27001 | 0.276 |
| 15.28001 | 0.273 |
| 15.29001 | 0.266 |
| 15.30001 | 0.258 |
| 15.31001 | 0.251 |
| 15.32001 | 0.245 |
| 15.33001 | 0.24 |
| 15.34001 | 0.234 |
| 15.35001 | 0.23 |
| 15.36001 | 0.226 |
| 15.37001 | 0.225 |
| 15.38001 | 0.227 |
| 15.39001 | 0.232 |
| 15.40001 | 0.239 |
| 15.41001 | 0.246 |
| 15.42001 | 0.254 |
| 15.43001 | 0.261 |
| 15.44001 | 0.266 |
| 15.45001 | 0.269 |
| 15.46001 | 0.27 |
| 15.47001 | 0.267 |
| 15.48001 | 0.263 |
| 15.49001 | 0.256 |
| 15.50001 | 0.249 |
| 15.51001 | 0.244 |
| 15.52001 | 0.242 |
| 15.53001 | 0.244 |
| 15.54001 | 0.252 |
| 15.55001 | 0.262 |
| 15.56001 | 0.272 |
| 15.57001 | 0.279 |
| 15.58001 | 0.282 |
| 15.59001 | 0.279 |
| 15.60001 | 0.272 |
| 15.61001 | 0.264 |
| 15.62001 | 0.255 |
| 15.63001 | 0.248 |
| 15.64001 | 0.243 |
| 15.65001 | 0.24 |
| 15.66001 | 0.24 |
| 15.67001 | 0.241 |
| 15.68001 | 0.244 |
| 15.69001 | 0.248 |
| 15.70001 | 0.254 |
| 15.71001 | 0.259 |
| 15.72001 | 0.264 |
| 15.73001 | 0.266 |
| 15.74001 | 0.267 |
| 15.75001 | 0.266 |
| 15.76001 | 0.266 |
| 15.77001 | 0.266 |
| 15.78001 | 0.267 |
| 15.79001 | 0.27 |
| 15.80001 | 0.271 |
| 15.81001 | 0.27 |
| 15.82001 | 0.265 |
| 15.83001 | 0.255 |
| 15.84001 | 0.241 |
| 15.85001 | 0.227 |
| 15.86001 | 0.215 |
| 15.87001 | 0.209 |
| 15.88001 | 0.21 |
| 15.89001 | 0.218 |
| 15.90001 | 0.23 |
| 15.91001 | 0.244 |
| 15.92001 | 0.258 |
| 15.93001 | 0.268 |
| 15.94001 | 0.274 |
| 15.95001 | 0.274 |
| 15.96001 | 0.269 |
| 15.97001 | 0.261 |
| 15.98001 | 0.25 |
| 15.99001 | 0.241 |
| 16.00001 | 0.234 |
| 16.01001 | 0.233 |
| 16.02001 | 0.236 |
| 16.03001 | 0.242 |
| 16.04001 | 0.248 |
| 16.05001 | 0.251 |
| 16.06001 | 0.247 |
| 16.07001 | 0.236 |
| 16.08001 | 0.221 |
| 16.09001 | 0.206 |
| 16.10001 | 0.197 |
| 16.11001 | 0.199 |
| 16.12001 | 0.213 |
| 16.13001 | 0.237 |
| 16.14001 | 0.263 |
| 16.15001 | 0.285 |
| 16.16001 | 0.297 |
| 16.17001 | 0.295 |
| 16.18001 | 0.282 |
| 16.19001 | 0.265 |
| 16.20001 | 0.249 |
| 16.21001 | 0.242 |
| 16.22001 | 0.244 |
| 16.23001 | 0.256 |
| 16.24001 | 0.272 |
| 16.25001 | 0.286 |
| 16.26001 | 0.295 |
| 16.27001 | 0.297 |
| 16.28001 | 0.292 |
| 16.29001 | 0.284 |
| 16.30001 | 0.276 |
| 16.31001 | 0.27 |
| 16.32001 | 0.268 |
| 16.33001 | 0.268 |
| 16.34001 | 0.269 |
| 16.35001 | 0.271 |
| 16.36001 | 0.275 |
| 16.37001 | 0.281 |
| 16.38001 | 0.29 |
| 16.39001 | 0.301 |
| 16.40001 | 0.31 |
| 16.41001 | 0.314 |
| 16.42001 | 0.308 |
| 16.43001 | 0.293 |
| 16.44001 | 0.272 |
| 16.45001 | 0.25 |
| 16.46001 | 0.234 |
| 16.47001 | 0.229 |
| 16.48001 | 0.237 |
| 16.49001 | 0.254 |
| 16.50001 | 0.274 |
| 16.51001 | 0.289 |
| 16.52001 | 0.294 |
| 16.53001 | 0.289 |
| 16.54001 | 0.276 |
| 16.55001 | 0.264 |
| 16.56001 | 0.257 |
| 16.57001 | 0.259 |
| 16.58001 | 0.272 |
| 16.59001 | 0.289 |
| 16.60001 | 0.305 |
| 16.61001 | 0.313 |
| 16.62001 | 0.31 |
| 16.63001 | 0.297 |
| 16.64001 | 0.279 |
| 16.65001 | 0.261 |
| 16.66001 | 0.25 |
| 16.67001 | 0.248 |
| 16.68001 | 0.255 |
| 16.69001 | 0.268 |
| 16.70001 | 0.284 |
| 16.71001 | 0.297 |
| 16.72001 | 0.304 |
| 16.73001 | 0.304 |
| 16.74001 | 0.296 |
| 16.75001 | 0.283 |
| 16.76001 | 0.267 |
| 16.77001 | 0.25 |
| 16.78001 | 0.235 |
| 16.79001 | 0.226 |
| 16.80001 | 0.224 |
| 16.81001 | 0.228 |
| 16.82001 | 0.238 |
| 16.83001 | 0.251 |
| 16.84001 | 0.263 |
| 16.85001 | 0.272 |
| 16.86001 | 0.274 |
| 16.87001 | 0.272 |
| 16.88001 | 0.267 |
| 16.89001 | 0.262 |
| 16.90001 | 0.258 |
| 16.91001 | 0.256 |
| 16.92001 | 0.255 |
| 16.93001 | 0.253 |
| 16.94001 | 0.25 |
| 16.95001 | 0.246 |
| 16.96001 | 0.244 |
| 16.97001 | 0.245 |
| 16.98001 | 0.252 |
| 16.99001 | 0.265 |
| 17.00001 | 0.28 |
| 17.01001 | 0.295 |
| 17.02001 | 0.304 |
| 17.03001 | 0.307 |
| 17.04001 | 0.301 |
| 17.05001 | 0.29 |
| 17.06001 | 0.277 |
| 17.07001 | 0.265 |
| 17.08001 | 0.256 |
| 17.09001 | 0.251 |
| 17.10001 | 0.249 |
| 17.11001 | 0.248 |
| 17.12001 | 0.249 |
| 17.13001 | 0.251 |
| 17.14001 | 0.255 |
| 17.15001 | 0.26 |
| 17.16001 | 0.265 |
| 17.17001 | 0.268 |
| 17.18001 | 0.267 |
| 17.19001 | 0.261 |
| 17.20001 | 0.252 |
| 17.21001 | 0.242 |
| 17.22001 | 0.237 |
| 17.23001 | 0.238 |
| 17.24001 | 0.246 |
| 17.25001 | 0.258 |
| 17.26001 | 0.271 |
| 17.27001 | 0.278 |
| 17.28001 | 0.277 |
| 17.29001 | 0.268 |
| 17.30001 | 0.256 |
| 17.31001 | 0.245 |
| 17.32001 | 0.239 |
| 17.33001 | 0.242 |
| 17.34001 | 0.251 |
| 17.35001 | 0.264 |
| 17.36001 | 0.275 |
| 17.37001 | 0.282 |
| 17.38001 | 0.284 |
| 17.39001 | 0.282 |
| 17.40001 | 0.278 |
| 17.41001 | 0.276 |
| 17.42001 | 0.274 |
| 17.43001 | 0.272 |
| 17.44001 | 0.267 |
| 17.45001 | 0.259 |
| 17.46001 | 0.248 |
| 17.47001 | 0.238 |
| 17.48001 | 0.232 |
| 17.49001 | 0.233 |
| 17.50001 | 0.241 |
| 17.51001 | 0.256 |
| 17.52001 | 0.271 |
| 17.53001 | 0.282 |
| 17.54001 | 0.287 |
| 17.55001 | 0.283 |
| 17.56001 | 0.274 |
| 17.57001 | 0.262 |
| 17.58001 | 0.251 |
| 17.59001 | 0.244 |
| 17.60001 | 0.24 |
| 17.61001 | 0.238 |
| 17.62001 | 0.237 |
| 17.63001 | 0.238 |
| 17.64001 | 0.24 |
| 17.65001 | 0.244 |
| 17.66001 | 0.25 |
| 17.67001 | 0.258 |
| 17.68001 | 0.263 |
| 17.69001 | 0.264 |
| 17.70001 | 0.258 |
| 17.71001 | 0.246 |
| 17.72001 | 0.233 |
| 17.73001 | 0.222 |
| 17.74001 | 0.22 |
| 17.75001 | 0.228 |
| 17.76001 | 0.244 |
| 17.77001 | 0.263 |
| 17.78001 | 0.278 |
| 17.79001 | 0.284 |
| 17.80001 | 0.28 |
| 17.81001 | 0.268 |
| 17.82001 | 0.253 |
| 17.83001 | 0.24 |
| 17.84001 | 0.234 |
| 17.85001 | 0.236 |
| 17.86001 | 0.242 |
| 17.87001 | 0.249 |
| 17.88001 | 0.251 |
| 17.89001 | 0.248 |
| 17.90001 | 0.241 |
| 17.91001 | 0.234 |
| 17.92001 | 0.232 |
| 17.93001 | 0.235 |
| 17.94001 | 0.244 |
| 17.95001 | 0.255 |
| 17.96001 | 0.264 |
| 17.97001 | 0.269 |
| 17.98001 | 0.267 |
| 17.99001 | 0.26 |
| 18.00001 | 0.25 |
| 18.01001 | 0.242 |
| 18.02001 | 0.237 |
| 18.03001 | 0.234 |
| 18.04001 | 0.234 |
| 18.05001 | 0.234 |
| 18.06001 | 0.233 |
| 18.07001 | 0.232 |
| 18.08001 | 0.232 |
| 18.09001 | 0.235 |
| 18.10001 | 0.24 |
| 18.11001 | 0.248 |
| 18.12001 | 0.254 |
| 18.13001 | 0.256 |
| 18.14001 | 0.254 |
| 18.15001 | 0.247 |
| 18.16001 | 0.238 |
| 18.17001 | 0.231 |
| 18.18001 | 0.228 |
| 18.19001 | 0.23 |
| 18.20001 | 0.236 |
| 18.21001 | 0.244 |
| 18.22001 | 0.25 |
| 18.23001 | 0.252 |
| 18.24001 | 0.253 |
| 18.25001 | 0.252 |
| 18.26001 | 0.253 |
| 18.27001 | 0.256 |
| 18.28001 | 0.262 |
| 18.29001 | 0.266 |
| 18.30001 | 0.269 |
| 18.31001 | 0.266 |
| 18.32001 | 0.259 |
| 18.33001 | 0.249 |
| 18.34001 | 0.239 |
| 18.35001 | 0.233 |
| 18.36001 | 0.233 |
| 18.37001 | 0.238 |
| 18.38001 | 0.246 |
| 18.39001 | 0.255 |
| 18.40001 | 0.262 |
| 18.41001 | 0.265 |
| 18.42001 | 0.265 |
| 18.43001 | 0.262 |
| 18.44001 | 0.258 |
| 18.45001 | 0.255 |
| 18.46001 | 0.253 |
| 18.47001 | 0.251 |
| 18.48001 | 0.249 |
| 18.49001 | 0.247 |
| 18.50001 | 0.245 |
| 18.51001 | 0.245 |
| 18.52001 | 0.246 |
| 18.53001 | 0.25 |
| 18.54001 | 0.255 |
| 18.55001 | 0.26 |
| 18.56001 | 0.264 |
| 18.57001 | 0.266 |
| 18.58001 | 0.266 |
| 18.59001 | 0.265 |
| 18.60001 | 0.263 |
| 18.61001 | 0.263 |
| 18.62001 | 0.263 |
| 18.63001 | 0.264 |
| 18.64001 | 0.265 |
| 18.65001 | 0.265 |
| 18.66001 | 0.265 |
| 18.67001 | 0.264 |
| 18.68001 | 0.264 |
| 18.69001 | 0.264 |
| 18.70001 | 0.264 |
| 18.71001 | 0.264 |
| 18.72001 | 0.262 |
| 18.73001 | 0.259 |
| 18.74001 | 0.254 |
| 18.75001 | 0.249 |
| 18.76001 | 0.245 |
| 18.77001 | 0.244 |
| 18.78001 | 0.246 |
| 18.79001 | 0.252 |
| 18.80001 | 0.261 |
| 18.81001 | 0.271 |
| 18.82001 | 0.279 |
| 18.83001 | 0.285 |
| 18.84001 | 0.287 |
| 18.85001 | 0.285 |
| 18.86001 | 0.281 |
| 18.87001 | 0.275 |
| 18.88001 | 0.27 |
| 18.89001 | 0.267 |
| 18.90001 | 0.267 |
| 18.91001 | 0.27 |
| 18.92001 | 0.275 |
| 18.93001 | 0.279 |
| 18.94001 | 0.28 |
| 18.95001 | 0.278 |
| 18.96001 | 0.272 |
| 18.97001 | 0.263 |
| 18.98001 | 0.254 |
| 18.99001 | 0.249 |
| 19.00001 | 0.249 |
| 19.01001 | 0.256 |
| 19.02001 | 0.269 |
| 19.03001 | 0.285 |
| 19.04001 | 0.298 |
| 19.05001 | 0.305 |
| 19.06001 | 0.302 |
| 19.07001 | 0.292 |
| 19.08001 | 0.275 |
| 19.09001 | 0.258 |
| 19.10001 | 0.246 |
| 19.11001 | 0.24 |
| 19.12001 | 0.243 |
| 19.13001 | 0.252 |
| 19.14001 | 0.264 |
| 19.15001 | 0.276 |
| 19.16001 | 0.288 |
| 19.17001 | 0.297 |
| 19.18001 | 0.304 |
| 19.19001 | 0.311 |
| 19.20001 | 0.316 |
| 19.21001 | 0.316 |
| 19.22001 | 0.311 |
| 19.23001 | 0.298 |
| 19.24001 | 0.28 |
| 19.25001 | 0.26 |
| 19.26001 | 0.245 |
| 19.27001 | 0.24 |
| 19.28001 | 0.248 |
| 19.29001 | 0.267 |
| 19.30001 | 0.291 |
| 19.31001 | 0.312 |
| 19.32001 | 0.321 |
| 19.33001 | 0.315 |
| 19.34001 | 0.295 |
| 19.35001 | 0.268 |
| 19.36001 | 0.242 |
| 19.37001 | 0.227 |
| 19.38001 | 0.226 |
| 19.39001 | 0.239 |
| 19.40001 | 0.26 |
| 19.41001 | 0.283 |
| 19.42001 | 0.3 |
| 19.43001 | 0.308 |
| 19.44001 | 0.304 |
| 19.45001 | 0.292 |
| 19.46001 | 0.276 |
| 19.47001 | 0.26 |
| 19.48001 | 0.246 |
| 19.49001 | 0.237 |
| 19.50001 | 0.235 |
| 19.51001 | 0.241 |
| 19.52001 | 0.254 |
| 19.53001 | 0.272 |
| 19.54001 | 0.293 |
| 19.55001 | 0.309 |
| 19.56001 | 0.315 |
| 19.57001 | 0.307 |
| 19.58001 | 0.286 |
| 19.59001 | 0.258 |
| 19.60001 | 0.231 |
| 19.61001 | 0.213 |
| 19.62001 | 0.21 |
| 19.63001 | 0.222 |
| 19.64001 | 0.245 |
| 19.65001 | 0.269 |
| 19.66001 | 0.287 |
| 19.67001 | 0.294 |
| 19.68001 | 0.289 |
| 19.69001 | 0.278 |
| 19.70001 | 0.266 |
| 19.71001 | 0.26 |
| 19.72001 | 0.261 |
| 19.73001 | 0.266 |
| 19.74001 | 0.27 |
| 19.75001 | 0.268 |
| 19.76001 | 0.258 |
| 19.77001 | 0.243 |
| 19.78001 | 0.228 |
| 19.79001 | 0.219 |
| 19.80001 | 0.221 |
| 19.81001 | 0.235 |
| 19.82001 | 0.256 |
| 19.83001 | 0.278 |
| 19.84001 | 0.296 |
| 19.85001 | 0.304 |
| 19.86001 | 0.302 |
| 19.87001 | 0.292 |
| 19.88001 | 0.277 |
| 19.89001 | 0.262 |
| 19.90001 | 0.248 |
| 19.91001 | 0.237 |
| 19.92001 | 0.231 |
| 19.93001 | 0.231 |
| 19.94001 | 0.236 |
| 19.95001 | 0.246 |
| 19.96001 | 0.26 |
| 19.97001 | 0.275 |
| 19.98001 | 0.285 |
| 19.99001 | 0.288 |
| 20.00001 | 0.282 |
| 20.01001 | 0.269 |
| 20.02001 | 0.253 |
| 20.03001 | 0.239 |
| 20.04001 | 0.231 |
| 20.05001 | 0.232 |
| 20.06001 | 0.24 |
| 20.07001 | 0.252 |
| 20.08001 | 0.262 |
| 20.09001 | 0.267 |
| 20.10001 | 0.265 |
| 20.11001 | 0.259 |
| 20.12001 | 0.251 |
| 20.13001 | 0.244 |
| 20.14001 | 0.242 |
| 20.15001 | 0.243 |
| 20.16001 | 0.246 |
| 20.17001 | 0.249 |
| 20.18001 | 0.25 |
| 20.19001 | 0.248 |
| 20.20001 | 0.244 |
| 20.21001 | 0.241 |
| 20.22001 | 0.239 |
| 20.23001 | 0.241 |
| 20.24001 | 0.247 |
| 20.25001 | 0.254 |
| 20.26001 | 0.262 |
| 20.27001 | 0.266 |
| 20.28001 | 0.267 |
| 20.29001 | 0.264 |
| 20.30001 | 0.257 |
| 20.31001 | 0.248 |
| 20.32001 | 0.239 |
| 20.33001 | 0.234 |
| 20.34001 | 0.232 |
| 20.35001 | 0.236 |
| 20.36001 | 0.244 |
| 20.37001 | 0.253 |
| 20.38001 | 0.262 |
| 20.39001 | 0.269 |
| 20.40001 | 0.271 |
| 20.41001 | 0.27 |
| 20.42001 | 0.267 |
| 20.43001 | 0.263 |
| 20.44001 | 0.26 |
| 20.45001 | 0.261 |
| 20.46001 | 0.264 |
| 20.47001 | 0.269 |
| 20.48001 | 0.273 |
| 20.49001 | 0.276 |
| 20.50001 | 0.274 |
| 20.51001 | 0.268 |
| 20.52001 | 0.258 |
| 20.53001 | 0.245 |
| 20.54001 | 0.234 |
| 20.55001 | 0.226 |
| 20.56001 | 0.224 |
| 20.57001 | 0.228 |
| 20.58001 | 0.239 |
| 20.59001 | 0.252 |
| 20.60001 | 0.265 |
| 20.61001 | 0.273 |
| 20.62001 | 0.274 |
| 20.63001 | 0.268 |
| 20.64001 | 0.258 |
| 20.65001 | 0.248 |
| 20.66001 | 0.242 |
| 20.67001 | 0.244 |
| 20.68001 | 0.254 |
| 20.69001 | 0.27 |
| 20.70001 | 0.286 |
| 20.71001 | 0.298 |
| 20.72001 | 0.303 |
| 20.73001 | 0.298 |
| 20.74001 | 0.287 |
| 20.75001 | 0.271 |
| 20.76001 | 0.256 |
| 20.77001 | 0.243 |
| 20.78001 | 0.236 |
| 20.79001 | 0.233 |
| 20.80001 | 0.234 |
| 20.81001 | 0.237 |
| 20.82001 | 0.242 |
| 20.83001 | 0.249 |
| 20.84001 | 0.256 |
| 20.85001 | 0.262 |
| 20.86001 | 0.265 |
| 20.87001 | 0.263 |
| 20.88001 | 0.254 |
| 20.89001 | 0.238 |
| 20.90001 | 0.217 |
| 20.91001 | 0.195 |
| 20.92001 | 0.177 |
| 20.93001 | 0.169 |
| 20.94001 | 0.175 |
| 20.95001 | 0.198 |
| 20.96001 | 0.235 |
| 20.97001 | 0.282 |
| 20.98001 | 0.33 |
| 20.99001 | 0.372 |
| 21.00001 | 0.401 |
| 21.01001 | 0.411 |
| 21.02001 | 0.4 |
| 21.03001 | 0.372 |
| 21.04001 | 0.329 |
| 21.05001 | 0.28 |
| 21.06001 | 0.232 |
| 21.07001 | 0.188 |
| 21.08001 | 0.155 |
| 21.09001 | 0.134 |
| 21.10001 | 0.127 |
| 21.11001 | 0.135 |
| 21.12001 | 0.159 |
| 21.13001 | 0.198 |
| 21.14001 | 0.25 |
| 21.15001 | 0.309 |
| 21.16001 | 0.364 |
| 21.17001 | 0.404 |
| 21.18001 | 0.418 |
| 21.19001 | 0.401 |
| 21.20001 | 0.352 |
| 21.21001 | 0.28 |
| 21.22001 | 0.201 |
| 21.23001 | 0.133 |
| 21.24001 | 0.094 |
| 21.25001 | 0.093 |
| 21.26001 | 0.132 |
| 21.27001 | 0.2 |
| 21.28001 | 0.28 |
| 21.29001 | 0.351 |
| 21.30001 | 0.394 |
| 21.31001 | 0.396 |
| 21.32001 | 0.356 |
| 21.33001 | 0.283 |
| 21.34001 | 0.197 |
| 21.35001 | 0.12 |
| 21.36001 | 0.074 |
| 21.37001 | 0.073 |
| 21.38001 | 0.118 |
| 21.39001 | 0.198 |
| 21.40001 | 0.289 |
| 21.41001 | 0.368 |
| 21.42001 | 0.412 |
| 21.43001 | 0.408 |
| 21.44001 | 0.359 |
| 21.45001 | 0.281 |
| 21.46001 | 0.198 |
| 21.47001 | 0.135 |
| 21.48001 | 0.11 |
| 21.49001 | 0.13 |
| 21.50001 | 0.189 |
| 21.51001 | 0.268 |
| 21.52001 | 0.344 |
| 21.53001 | 0.396 |
| 21.54001 | 0.409 |
| 21.55001 | 0.377 |
| 21.56001 | 0.306 |
| 21.57001 | 0.212 |
| 21.58001 | 0.116 |
| 21.59001 | 0.041 |
| 21.60001 | 0.008 |
| 21.61001 | 0.031 |
| 21.62001 | 0.115 |
| 21.63001 | 0.25 |
| 21.64001 | 0.413 |
| 21.65001 | 0.572 |
| 21.66001 | 0.69 |
| 21.67001 | 0.736 |
| 21.68001 | 0.691 |
| 21.69001 | 0.558 |
| 21.70001 | 0.361 |
| 21.71001 | 0.139 |
| 21.72001 | -0.059 |
| 21.73001 | -0.191 |
| 21.74001 | -0.229 |
| 21.75001 | -0.17 |
| 21.76001 | -0.034 |
| 21.77001 | 0.142 |
| 21.78001 | 0.308 |
| 21.79001 | 0.425 |
| 21.80001 | 0.464 |
| 21.81001 | 0.423 |
| 21.82001 | 0.322 |
| 21.83001 | 0.199 |
| 21.84001 | 0.097 |
| 21.85001 | 0.053 |
| 21.86001 | 0.085 |
| 21.87001 | 0.187 |
| 21.88001 | 0.328 |
| 21.89001 | 0.466 |
| 21.90001 | 0.557 |
| 21.91001 | 0.574 |
| 21.92001 | 0.514 |
| 21.93001 | 0.402 |
| 21.94001 | 0.278 |
| 21.95001 | 0.188 |
| 21.96001 | 0.162 |
| 21.97001 | 0.204 |
| 21.98001 | 0.29 |
| 21.99001 | 0.377 |
| 22.00001 | 0.419 |
| 22.01001 | 0.386 |
| 22.02001 | 0.279 |
| 22.03001 | 0.128 |
| 22.04001 | -0.015 |
| 22.05001 | -0.097 |
| 22.06001 | -0.082 |
| 22.07001 | 0.032 |
| 22.08001 | 0.212 |
| 22.09001 | 0.401 |
| 22.10001 | 0.538 |
| 22.11001 | 0.579 |
| 22.12001 | 0.513 |
| 22.13001 | 0.363 |
| 22.14001 | 0.183 |
| 22.15001 | 0.03 |
| 22.16001 | -0.046 |
| 22.17001 | -0.024 |
| 22.18001 | 0.084 |
| 22.19001 | 0.243 |
| 22.20001 | 0.4 |
| 22.21001 | 0.512 |
| 22.22001 | 0.548 |
| 22.23001 | 0.508 |
| 22.24001 | 0.41 |
| 22.25001 | 0.292 |
| 22.26001 | 0.188 |
| 22.27001 | 0.128 |
| 22.28001 | 0.122 |
| 22.29001 | 0.159 |
| 22.30001 | 0.218 |
| 22.31001 | 0.271 |
| 22.32001 | 0.295 |
| 22.33001 | 0.283 |
| 22.34001 | 0.243 |
| 22.35001 | 0.198 |
| 22.36001 | 0.175 |
| 22.37001 | 0.195 |
| 22.38001 | 0.263 |
| 22.39001 | 0.362 |
| 22.40001 | 0.459 |
| 22.41001 | 0.517 |
| 22.42001 | 0.506 |
| 22.43001 | 0.419 |
| 22.44001 | 0.276 |
| 22.45001 | 0.116 |
| 22.46001 | -0.009 |
| 22.47001 | -0.062 |
| 22.48001 | -0.029 |
| 22.49001 | 0.074 |
| 22.50001 | 0.207 |
| 22.51001 | 0.323 |
| 22.52001 | 0.385 |
| 22.53001 | 0.385 |
| 22.54001 | 0.34 |
| 22.55001 | 0.29 |
| 22.56001 | 0.27 |
| 22.57001 | 0.302 |
| 22.58001 | 0.376 |
| 22.59001 | 0.458 |
| 22.60001 | 0.506 |
| 22.61001 | 0.487 |
| 22.62001 | 0.394 |
| 22.63001 | 0.255 |
| 22.64001 | 0.115 |
| 22.65001 | 0.023 |
| 22.66001 | 0.01 |
| 22.67001 | 0.075 |
| 22.68001 | 0.186 |
| 22.69001 | 0.297 |
| 22.70001 | 0.365 |
| 22.71001 | 0.371 |
| 22.72001 | 0.328 |
| 22.73001 | 0.268 |
| 22.74001 | 0.23 |
| 22.75001 | 0.238 |
| 22.76001 | 0.294 |
| 22.77001 | 0.369 |
| 22.78001 | 0.426 |
| 22.79001 | 0.434 |
| 22.80001 | 0.381 |
| 22.81001 | 0.283 |
| 22.82001 | 0.174 |
| 22.83001 | 0.094 |
| 22.84001 | 0.067 |
| 22.85001 | 0.097 |
| 22.86001 | 0.167 |
| 22.87001 | 0.245 |
| 22.88001 | 0.305 |
| 22.89001 | 0.332 |
| 22.90001 | 0.332 |
| 22.91001 | 0.319 |
| 22.92001 | 0.313 |
| 22.93001 | 0.322 |
| 22.94001 | 0.344 |
| 22.95001 | 0.362 |
| 22.96001 | 0.36 |
| 22.97001 | 0.329 |
| 22.98001 | 0.272 |
| 22.99001 | 0.205 |
| 23.00001 | 0.153 |
| 23.01001 | 0.135 |
| 23.02001 | 0.159 |
| 23.03001 | 0.216 |
| 23.04001 | 0.287 |
| 23.05001 | 0.348 |
| 23.06001 | 0.378 |
| 23.07001 | 0.371 |
| 23.08001 | 0.335 |
| 23.09001 | 0.289 |
| 23.10001 | 0.256 |
| 23.11001 | 0.256 |
| 23.12001 | 0.295 |
| 23.13001 | 0.365 |
| 23.14001 | 0.445 |
| 23.15001 | 0.506 |
| 23.16001 | 0.525 |
| 23.17001 | 0.488 |
| 23.18001 | 0.399 |
| 23.19001 | 0.279 |
| 23.20001 | 0.162 |
| 23.21001 | 0.079 |
| 23.22001 | 0.055 |
| 23.23001 | 0.095 |
| 23.24001 | 0.187 |
| 23.25001 | 0.304 |
| 23.26001 | 0.415 |
| 23.27001 | 0.494 |
| 23.28001 | 0.528 |
| 23.29001 | 0.52 |
| 23.30001 | 0.481 |
| 23.31001 | 0.429 |
| 23.32001 | 0.38 |
| 23.33001 | 0.344 |
| 23.34001 | 0.328 |
| 23.35001 | 0.332 |
| 23.36001 | 0.357 |
| 23.37001 | 0.398 |
| 23.38001 | 0.446 |
| 23.39001 | 0.49 |
| 23.40001 | 0.516 |
| 23.41001 | 0.514 |
| 23.42001 | 0.486 |
| 23.43001 | 0.442 |
| 23.44001 | 0.406 |
| 23.45001 | 0.398 |
| 23.46001 | 0.432 |
| 23.47001 | 0.498 |
| 23.48001 | 0.571 |
| 23.49001 | 0.62 |
| 23.50001 | 0.624 |
| 23.51001 | 0.589 |
| 23.52001 | 0.552 |
| 23.53001 | 0.568 |
| 23.54001 | 0.685 |
| 23.55001 | 0.916 |
| 23.56001 | 1.22 |
| 23.57001 | 1.508 |
| 23.58001 | 1.673 |
| 23.59001 | 1.636 |
| 23.60001 | 1.389 |
| 23.61001 | 1.021 |
| 23.62001 | 0.699 |
| 23.63001 | 0.625 |
| 23.64001 | 0.964 |
| 23.65001 | 1.773 |
| 23.66001 | 2.963 |
| 23.67001 | 4.301 |
| 23.68001 | 5.459 |
| 23.69001 | 6.095 |
| 23.70001 | 5.952 |
| 23.71001 | 4.937 |
| 23.72001 | 3.16 |
| 23.73001 | 0.928 |
| 23.74001 | -1.319 |
| 23.75001 | -3.1 |
| 23.76001 | -4.012 |
| 23.77001 | -3.828 |
| 23.78001 | -2.569 |
| 23.79001 | -0.512 |
| 23.80001 | 1.864 |
| 23.81001 | 3.983 |
| 23.82001 | 5.313 |
| 23.83001 | 5.497 |
| 23.84001 | 4.447 |
| 23.85001 | 2.369 |
| 23.86001 | -0.292 |
| 23.87001 | -2.959 |
| 23.88001 | -5.071 |
| 23.89001 | -6.208 |
| 23.90001 | -6.184 |
| 23.91001 | -5.066 |
| 23.92001 | -3.153 |
| 23.93001 | -0.892 |
| 23.94001 | 1.209 |
| 23.95001 | 2.679 |
| 23.96001 | 3.163 |
| 23.97001 | 2.496 |
| 23.98001 | 0.737 |
| 23.99001 | -1.812 |
| 24.00001 | -4.652 |
| 24.01001 | -7.18 |
| 24.02001 | -8.828 |
| 24.03001 | -9.226 |
| 24.04001 | -8.328 |
| 24.05001 | -6.458 |
| 24.06001 | -4.227 |
| 24.07001 | -2.354 |
| 24.08001 | -1.408 |
| 24.09001 | -1.591 |
| 24.10001 | -2.623 |
| 24.11001 | -3.8 |
| 24.12001 | -4.224 |
| 24.13001 | -3.12 |
| 24.14001 | -0.144 |
| 24.15001 | 4.438 |
| 24.16001 | 9.778 |
| 24.17001 | 14.67 |
| 24.18001 | 17.93 |
| 24.19001 | 18.72 |
| 24.20001 | 16.85 |
| 24.21001 | 12.8 |
| 24.22001 | 7.561 |
| 24.23001 | 2.353 |
| 24.24001 | -1.748 |
| 24.25001 | -4.075 |
| 24.26001 | -4.505 |
| 24.27001 | -3.416 |
| 24.28001 | -1.512 |
| 24.29001 | 0.422 |
| 24.30001 | 1.746 |
| 24.31001 | 2.122 |
| 24.32001 | 1.553 |
| 24.33001 | 0.328 |
| 24.34001 | -1.106 |
| 24.35001 | -2.305 |
| 24.36001 | -2.956 |
| 24.37001 | -2.963 |
| 24.38001 | -2.445 |
| 24.39001 | -1.671 |
| 24.40001 | -0.945 |
| 24.41001 | -0.484 |
| 24.42001 | -0.334 |
| 24.43001 | -0.369 |
| 24.44001 | -0.367 |
| 24.45001 | -0.148 |
| 24.46001 | 0.287 |
| 24.47001 | 0.68 |
| 24.48001 | 0.55 |
| 24.49001 | -0.648 |
| 24.50001 | -3.307 |
| 24.51001 | -7.441 |
| 24.52001 | -12.59 |
| 24.53001 | -17.85 |
| 24.54001 | -22.15 |
| 24.55001 | -24.49 |
| 24.56001 | -24.33 |
| 24.57001 | -21.71 |
| 24.58001 | -17.24 |
| 24.59001 | -11.92 |
| 24.60001 | -6.802 |
| 24.61001 | -2.661 |
| 24.62001 | 0.159 |
| 24.63001 | 1.768 |
| 24.64001 | 2.567 |
| 24.65001 | 3.005 |
| 24.66001 | 3.374 |
| 24.67001 | 3.711 |
| 24.68001 | 3.85 |
| 24.69001 | 3.578 |
| 24.70001 | 2.812 |
| 24.71001 | 1.701 |
| 24.72001 | 0.606 |
| 24.73001 | -0.036 |
| 24.74001 | 0.101 |
| 24.75001 | 1.076 |
| 24.76001 | 2.644 |
| 24.77001 | 4.335 |
| 24.78001 | 5.637 |
| 24.79001 | 6.184 |
| 24.80001 | 5.886 |
| 24.81001 | 4.937 |
| 24.82001 | 3.705 |
| 24.83001 | 2.569 |
| 24.84001 | 1.758 |
| 24.85001 | 1.284 |
| 24.86001 | 0.966 |
| 24.87001 | 0.543 |
| 24.88001 | -0.182 |
| 24.89001 | -1.243 |
| 24.90001 | -2.494 |
| 24.91001 | -3.67 |
| 24.92001 | -4.501 |
| 24.93001 | -4.821 |
| 24.94001 | -4.617 |
| 24.95001 | -4.01 |
| 24.96001 | -3.174 |
| 24.97001 | -2.236 |
| 24.98001 | -1.216 |
| 24.99001 | -0.029 |
| 25.00001 | 1.458 |
| 25.01001 | 3.325 |
| 25.02001 | 5.517 |
| 25.03001 | 7.816 |
| 25.04001 | 9.878 |
| 25.05001 | 11.33 |
| 25.06001 | 11.9 |
| 25.07001 | 11.47 |
| 25.08001 | 10.17 |
| 25.09001 | 8.274 |
| 25.10001 | 6.168 |
| 25.11001 | 4.213 |
| 25.12001 | 2.675 |
| 25.13001 | 1.691 |
| 25.14001 | 1.274 |
| 25.15001 | 1.355 |
| 25.16001 | 1.831 |
| 25.17001 | 2.592 |
| 25.18001 | 3.521 |
| 25.19001 | 4.478 |
| 25.20001 | 5.286 |
| 25.21001 | 5.734 |
| 25.22001 | 5.615 |
| 25.23001 | 4.789 |
| 25.24001 | 3.241 |
| 25.25001 | 1.127 |
| 25.26001 | -1.234 |
| 25.27001 | -3.421 |
| 25.28001 | -5.007 |
| 25.29001 | -5.676 |
| 25.30001 | -5.302 |
| 25.31001 | -3.991 |
| 25.32001 | -2.049 |
| 25.33001 | 0.1 |
| 25.34001 | 2.034 |
| 25.35001 | 3.437 |
| 25.36001 | 4.175 |
| 25.37001 | 4.307 |
| 25.38001 | 4.039 |
| 25.39001 | 3.641 |
| 25.40001 | 3.346 |
| 25.41001 | 3.272 |
| 25.42001 | 3.39 |
| 25.43001 | 3.543 |
| 25.44001 | 3.504 |
| 25.45001 | 3.069 |
| 25.46001 | 2.129 |
| 25.47001 | 0.717 |
| 25.48001 | -0.989 |
| 25.49001 | -2.713 |
| 25.50001 | -4.152 |
| 25.51001 | -5.056 |
| 25.52001 | -5.292 |
| 25.53001 | -4.868 |
| 25.54001 | -3.923 |
| 25.55001 | -2.69 |
| 25.56001 | -1.429 |
| 25.57001 | -0.377 |
| 25.58001 | 0.304 |
| 25.59001 | 0.547 |
| 25.60001 | 0.377 |
| 25.61001 | -0.105 |
| 25.62001 | -0.751 |
| 25.63001 | -1.41 |
| 25.64001 | -1.953 |
| 25.65001 | -2.303 |
| 25.66001 | -2.443 |
| 25.67001 | -2.406 |
| 25.68001 | -2.254 |
| 25.69001 | -2.045 |
| 25.70001 | -1.806 |
| 25.71001 | -1.519 |
| 25.72001 | -1.132 |
| 25.73001 | -0.592 |
| 25.74001 | 0.118 |
| 25.75001 | 0.944 |
| 25.76001 | 1.761 |
| 25.77001 | 2.403 |
| 25.78001 | 2.726 |
| 25.79001 | 2.672 |
| 25.80001 | 2.319 |
| 25.81001 | 1.868 |
| 25.82001 | 1.593 |
| 25.83001 | 1.743 |
| 25.84001 | 2.441 |
| 25.85001 | 3.626 |
| 25.86001 | 5.055 |
| 25.87001 | 6.371 |
| 25.88001 | 7.224 |
| 25.89001 | 7.384 |
| 25.90001 | 6.818 |
| 25.91001 | 5.69 |
| 25.92001 | 4.289 |
| 25.93001 | 2.924 |
| 25.94001 | 1.813 |
| 25.95001 | 1.025 |
| 25.96001 | 0.491 |
| 25.97001 | 0.066 |
| 25.98001 | -0.377 |
| 25.99001 | -0.878 |
| 26.00001 | -1.369 |
| 26.01001 | -1.707 |
| 26.02001 | -1.758 |
| 26.03001 | -1.467 |
| 26.04001 | -0.903 |
| 26.05001 | -0.242 |
| 26.06001 | 0.299 |
| 26.07001 | 0.548 |
| 26.08001 | 0.447 |
| 26.09001 | 0.074 |
| 26.10001 | -0.392 |
| 26.11001 | -0.746 |
| 26.12001 | -0.847 |
| 26.13001 | -0.662 |
| 26.14001 | -0.282 |
| 26.15001 | 0.132 |
| 26.16001 | 0.417 |
| 26.17001 | 0.481 |
| 26.18001 | 0.339 |
| 26.19001 | 0.102 |
| 26.20001 | -0.073 |
| 26.21001 | -0.051 |
| 26.22001 | 0.227 |
| 26.23001 | 0.723 |
| 26.24001 | 1.312 |
| 26.25001 | 1.837 |
| 26.26001 | 2.161 |
| 26.27001 | 2.208 |
| 26.28001 | 1.982 |
| 26.29001 | 1.547 |
| 26.30001 | 0.997 |
| 26.31001 | 0.416 |
| 26.32001 | -0.143 |
| 26.33001 | -0.668 |
| 26.34001 | -1.168 |
| 26.35001 | -1.653 |
| 26.36001 | -2.109 |
| 26.37001 | -2.501 |
| 26.38001 | -2.77 |
| 26.39001 | -2.866 |
| 26.40001 | -2.764 |
| 26.41002 | -2.483 |
| 26.42001 | -2.081 |
| 26.43001 | -1.637 |
| 26.44001 | -1.228 |
| 26.45001 | -0.899 |
| 26.46001 | -0.653 |
| 26.47001 | -0.455 |
| 26.48001 | -0.257 |
| 26.49002 | -0.023 |
| 26.50001 | 0.245 |
| 26.51001 | 0.501 |
| 26.52001 | 0.675 |
| 26.53001 | 0.701 |
| 26.54001 | 0.557 |
| 26.55001 | 0.288 |
| 26.56001 | 0.004 |
| 26.57001 | -0.155 |
| 26.58002 | -0.067 |
| 26.59001 | 0.315 |
| 26.60001 | 0.93 |
| 26.61001 | 1.609 |
| 26.62001 | 2.124 |
| 26.63001 | 2.252 |
| 26.64001 | 1.856 |
| 26.65001 | 0.935 |
| 26.66002 | -0.366 |
| 26.67001 | -1.791 |
| 26.68001 | -3.045 |
| 26.69001 | -3.883 |
| 26.70001 | -4.17 |
| 26.71001 | -3.917 |
| 26.72001 | -3.258 |
| 26.73001 | -2.402 |
| 26.74002 | -1.564 |
| 26.75002 | -0.9 |
| 26.76001 | -0.477 |
| 26.77001 | -0.27 |
| 26.78001 | -0.187 |
| 26.79001 | -0.113 |
| 26.80001 | 0.045 |
| 26.81001 | 0.336 |
| 26.82001 | 0.748 |
| 26.83002 | 1.222 |
| 26.84001 | 1.668 |
| 26.85001 | 1.996 |
| 26.86001 | 2.138 |
| 26.87001 | 2.067 |
| 26.88001 | 1.806 |
| 26.89001 | 1.422 |
| 26.90001 | 1.009 |
| 26.91002 | 0.665 |
| 26.92002 | 0.458 |
| 26.93001 | 0.412 |
| 26.94001 | 0.494 |
| 26.95001 | 0.634 |
| 26.96001 | 0.755 |
| 26.97001 | 0.808 |
| 26.98001 | 0.807 |
| 26.99002 | 0.825 |
| 27.00002 | 0.977 |
| 27.01001 | 1.365 |
| 27.02001 | 2.029 |
| 27.03001 | 2.908 |
| 27.04001 | 3.839 |
| 27.05001 | 4.6 |
| 27.06001 | 4.977 |
| 27.07001 | 4.841 |
| 27.08002 | 4.191 |
| 27.09002 | 3.165 |
| 27.10001 | 1.99 |
| 27.11001 | 0.907 |
| 27.12001 | 0.089 |
| 27.13001 | -0.408 |
| 27.14001 | -0.647 |
| 27.15001 | -0.772 |
| 27.16002 | -0.928 |
| 27.17002 | -1.202 |
| 27.18001 | -1.582 |
| 27.19001 | -1.969 |
| 27.20001 | -2.226 |
| 27.21001 | -2.245 |
| 27.22001 | -1.998 |
| 27.23001 | -1.554 |
| 27.24002 | -1.052 |
| 27.25002 | -0.646 |
| 27.26002 | -0.44 |
| 27.27001 | -0.452 |
| 27.28001 | -0.61 |
| 27.29001 | -0.785 |
| 27.30001 | -0.854 |
| 27.31001 | -0.746 |
| 27.32001 | -0.472 |
| 27.33002 | -0.113 |
| 27.34002 | 0.218 |
| 27.35001 | 0.424 |
| 27.36001 | 0.468 |
| 27.37001 | 0.382 |
| 27.38001 | 0.248 |
| 27.39001 | 0.165 |
| 27.40001 | 0.202 |
| 27.41002 | 0.375 |
| 27.42002 | 0.642 |
| 27.43002 | 0.92 |
| 27.44001 | 1.122 |
| 27.45001 | 1.184 |
| 27.46001 | 1.077 |
| 27.47001 | 0.813 |
| 27.48001 | 0.425 |
| 27.49002 | -0.05 |
| 27.50002 | -0.578 |
| 27.51002 | -1.133 |
| 27.52002 | -1.682 |
| 27.53001 | -2.178 |
| 27.54001 | -2.556 |
| 27.55001 | -2.747 |
| 27.56001 | -2.699 |
| 27.57001 | -2.402 |
| 27.58002 | -1.904 |
| 27.59002 | -1.311 |
| 27.60002 | -0.754 |
| 27.61001 | -0.36 |
| 27.62001 | -0.201 |
| 27.63001 | -0.276 |
| 27.64001 | -0.507 |
| 27.65001 | -0.764 |
| 27.66002 | -0.909 |
| 27.67002 | -0.845 |
| 27.68002 | -0.545 |
| 27.69002 | -0.056 |
| 27.70001 | 0.514 |
| 27.71001 | 1.045 |
| 27.72001 | 1.432 |
| 27.73001 | 1.625 |
| 27.74002 | 1.631 |
| 27.75002 | 1.502 |
| 27.76002 | 1.31 |
| 27.77002 | 1.124 |
| 27.78001 | 0.99 |
| 27.79001 | 0.929 |
| 27.80001 | 0.946 |
| 27.81001 | 1.036 |
| 27.82001 | 1.191 |
| 27.83002 | 1.395 |
| 27.84002 | 1.619 |
| 27.85002 | 1.818 |
| 27.86002 | 1.931 |
| 27.87001 | 1.904 |
| 27.88001 | 1.708 |
| 27.89001 | 1.36 |
| 27.90001 | 0.924 |
| 27.91002 | 0.501 |
| 27.92002 | 0.19 |
| 27.93002 | 0.052 |
| 27.94002 | 0.082 |
| 27.95001 | 0.202 |
| 27.96001 | 0.29 |
| 27.97001 | 0.222 |
| 27.98001 | -0.074 |
| 27.99002 | -0.587 |
| 28.00002 | -1.212 |
| 28.01002 | -1.783 |
| 28.02002 | -2.125 |
| 28.03002 | -2.112 |
| 28.04001 | -1.71 |
| 28.05001 | -0.994 |
| 28.06001 | -0.123 |
| 28.07001 | 0.706 |
| 28.08002 | 1.316 |
| 28.09002 | 1.602 |
| 28.10002 | 1.55 |
| 28.11002 | 1.233 |
| 28.12001 | 0.786 |
| 28.13001 | 0.356 |
| 28.14001 | 0.062 |
| 28.15001 | -0.032 |
| 28.16002 | 0.068 |
| 28.17002 | 0.304 |
| 28.18002 | 0.585 |
| 28.19002 | 0.821 |
| 28.20002 | 0.95 |
| 28.21001 | 0.95 |
| 28.22001 | 0.842 |
| 28.23001 | 0.671 |
| 28.24002 | 0.49 |
| 28.25002 | 0.338 |
| 28.26002 | 0.225 |
| 28.27002 | 0.138 |
| 28.28002 | 0.054 |
| 28.29001 | -0.037 |
| 28.30001 | -0.117 |
| 28.31001 | -0.134 |
| 28.32001 | -0.014 |
| 28.33002 | 0.312 |
| 28.34002 | 0.87 |
| 28.35002 | 1.625 |
| 28.36002 | 2.475 |
| 28.37002 | 3.27 |
| 28.38001 | 3.85 |
| 28.39001 | 4.095 |
| 28.40001 | 3.959 |
| 28.41002 | 3.483 |
| 28.42002 | 2.778 |
| 28.43002 | 1.993 |
| 28.44002 | 1.266 |
| 28.45002 | 0.692 |
| 28.46001 | 0.307 |
| 28.47001 | 0.096 |
| 28.48001 | 0.015 |
| 28.49002 | 0.021 |
| 28.50002 | 0.085 |
| 28.51002 | 0.199 |
| 28.52002 | 0.358 |
| 28.53002 | 0.552 |
| 28.54002 | 0.744 |
| 28.55001 | 0.883 |
| 28.56001 | 0.913 |
| 28.57001 | 0.799 |
| 28.58002 | 0.544 |
| 28.59002 | 0.195 |
| 28.60002 | -0.175 |
| 28.61002 | -0.485 |
| 28.62002 | -0.679 |
| 28.63001 | -0.744 |
| 28.64001 | -0.708 |
| 28.65001 | -0.623 |
| 28.66002 | -0.546 |
| 28.67002 | -0.506 |
| 28.68002 | -0.499 |
| 28.69002 | -0.49 |
| 28.70002 | -0.43 |
| 28.71002 | -0.282 |
| 28.72001 | -0.036 |
| 28.73001 | 0.28 |
| 28.74002 | 0.613 |
| 28.75002 | 0.903 |
| 28.76002 | 1.103 |
| 28.77002 | 1.189 |
| 28.78002 | 1.166 |
| 28.79002 | 1.058 |
| 28.80001 | 0.891 |
| 28.81001 | 0.689 |
| 28.82001 | 0.46 |
| 28.83002 | 0.205 |
| 28.84002 | -0.073 |
| 28.85002 | -0.366 |
| 28.86002 | -0.65 |
| 28.87002 | -0.891 |
| 28.88002 | -1.054 |
| 28.89001 | -1.116 |
| 28.90001 | -1.07 |
| 28.91002 | -0.928 |
| 28.92002 | -0.721 |
| 28.93002 | -0.487 |
| 28.94002 | -0.262 |
| 28.95002 | -0.073 |
| 28.96002 | 0.061 |
| 28.97002 | 0.135 |
| 28.98001 | 0.146 |
| 28.99002 | 0.097 |
| 29.00002 | -0.005 |
| 29.01002 | -0.151 |
| 29.02002 | -0.323 |
| 29.03002 | -0.498 |
| 29.04002 | -0.643 |
| 29.05002 | -0.721 |
| 29.06001 | -0.697 |
| 29.07001 | -0.546 |
| 29.08002 | -0.266 |
| 29.09002 | 0.124 |
| 29.10002 | 0.573 |
| 29.11002 | 1.002 |
| 29.12002 | 1.321 |
| 29.13002 | 1.443 |
| 29.14002 | 1.308 |
| 29.15001 | 0.901 |
| 29.16002 | 0.265 |
| 29.17002 | -0.5 |
| 29.18002 | -1.259 |
| 29.19002 | -1.872 |
| 29.20002 | -2.229 |
| 29.21002 | -2.279 |
| 29.22002 | -2.041 |
| 29.23001 | -1.601 |
| 29.24002 | -1.082 |
| 29.25002 | -0.604 |
| 29.26002 | -0.252 |
| 29.27002 | -0.053 |
| 29.28002 | 0.032 |
| 29.29002 | 0.079 |
| 29.30002 | 0.181 |
| 29.31002 | 0.402 |
| 29.32001 | 0.759 |
| 29.33002 | 1.21 |
| 29.34002 | 1.666 |
| 29.35002 | 2.02 |
| 29.36002 | 2.173 |
| 29.37002 | 2.076 |
| 29.38002 | 1.735 |
| 29.39002 | 1.221 |
| 29.40001 | 0.648 |
| 29.41002 | 0.145 |
| 29.42002 | -0.182 |
| 29.43002 | -0.276 |
| 29.44002 | -0.144 |
| 29.45002 | 0.146 |
| 29.46002 | 0.488 |
| 29.47002 | 0.776 |
| 29.48002 | 0.939 |
| 29.49002 | 0.961 |
| 29.50002 | 0.889 |
| 29.51002 | 0.81 |
| 29.52002 | 0.815 |
| 29.53002 | 0.959 |
| 29.54002 | 1.236 |
| 29.55002 | 1.574 |
| 29.56002 | 1.861 |
| 29.57001 | 1.989 |
| 29.58002 | 1.893 |
| 29.59002 | 1.582 |
| 29.60002 | 1.134 |
| 29.61002 | 0.67 |
| 29.62002 | 0.298 |
| 29.63002 | 0.078 |
| 29.64002 | -0.01 |
| 29.65002 | -0.05 |
| 29.66002 | -0.157 |
| 29.67002 | -0.423 |
| 29.68002 | -0.871 |
| 29.69002 | -1.445 |
| 29.70002 | -2.02 |
| 29.71002 | -2.452 |
| 29.72002 | -2.628 |
| 29.73002 | -2.51 |
| 29.74002 | -2.145 |
| 29.75002 | -1.641 |
| 29.76002 | -1.13 |
| 29.77002 | -0.716 |
| 29.78002 | -0.444 |
| 29.79002 | -0.295 |
| 29.80002 | -0.21 |
| 29.81002 | -0.126 |
| 29.82002 | -0.004 |
| 29.83002 | 0.146 |
| 29.84002 | 0.283 |
| 29.85002 | 0.352 |
| 29.86002 | 0.318 |
| 29.87002 | 0.19 |
| 29.88002 | 0.017 |
| 29.89002 | -0.129 |
| 29.90002 | -0.179 |
| 29.91002 | -0.099 |
| 29.92002 | 0.096 |
| 29.93002 | 0.353 |
| 29.94002 | 0.597 |
| 29.95002 | 0.762 |
| 29.96002 | 0.81 |
| 29.97002 | 0.739 |
| 29.98002 | 0.572 |
| 29.99002 | 0.342 |
| 30.00002 | 0.076 |
| 30.01002 | -0.214 |
| 30.02002 | -0.526 |
| 30.03002 | -0.85 |
| 30.04002 | -1.162 |
| 30.05002 | -1.413 |
| 30.06002 | -1.544 |
| 30.07002 | -1.507 |
| 30.08002 | -1.288 |
| 30.09002 | -0.925 |
| 30.10002 | -0.502 |
| 30.11002 | -0.129 |
| 30.12002 | 0.098 |
| 30.13002 | 0.129 |
| 30.14002 | -0.021 |
| 30.15002 | -0.267 |
| 30.16002 | -0.492 |
| 30.17002 | -0.576 |
| 30.18002 | -0.446 |
| 30.19002 | -0.093 |
| 30.20002 | 0.427 |
| 30.21002 | 1.011 |
| 30.22002 | 1.545 |
| 30.23002 | 1.937 |
| 30.24002 | 2.137 |
| 30.25002 | 2.14 |
| 30.26002 | 1.975 |
| 30.27002 | 1.691 |
| 30.28002 | 1.34 |
| 30.29002 | 0.975 |
| 30.30002 | 0.65 |
| 30.31002 | 0.422 |
| 30.32002 | 0.35 |
| 30.33002 | 0.476 |
| 30.34002 | 0.804 |
| 30.35002 | 1.291 |
| 30.36002 | 1.837 |
| 30.37002 | 2.309 |
| 30.38002 | 2.573 |
| 30.39002 | 2.542 |
| 30.40002 | 2.207 |
| 30.41002 | 1.647 |
| 30.42002 | 1.006 |
| 30.43002 | 0.447 |
| 30.44002 | 0.096 |
| 30.45002 | -0.002 |
| 30.46002 | 0.101 |
| 30.47002 | 0.276 |
| 30.48002 | 0.368 |
| 30.49002 | 0.252 |
| 30.50002 | -0.118 |
| 30.51002 | -0.687 |
| 30.52002 | -1.317 |
| 30.53002 | -1.828 |
| 30.54002 | -2.059 |
| 30.55002 | -1.915 |
| 30.56002 | -1.403 |
| 30.57002 | -0.627 |
| 30.58002 | 0.239 |
| 30.59002 | 1.003 |
| 30.60002 | 1.5 |
| 30.61002 | 1.642 |
| 30.62002 | 1.432 |
| 30.63002 | 0.959 |
| 30.64002 | 0.373 |
| 30.65002 | -0.162 |
| 30.66002 | -0.508 |
| 30.67002 | -0.596 |
| 30.68002 | -0.431 |
| 30.69002 | -0.09 |
| 30.70002 | 0.308 |
| 30.71002 | 0.646 |
| 30.72002 | 0.844 |
| 30.73002 | 0.878 |
| 30.74002 | 0.782 |
| 30.75002 | 0.622 |
| 30.76002 | 0.468 |
| 30.77002 | 0.358 |
| 30.78002 | 0.293 |
| 30.79002 | 0.241 |
| 30.80002 | 0.169 |
| 30.81002 | 0.068 |
| 30.82002 | -0.02 |
| 30.83002 | -0.011 |
| 30.84002 | 0.196 |
| 30.85002 | 0.674 |
| 30.86002 | 1.426 |
| 30.87002 | 2.367 |
| 30.88002 | 3.338 |
| 30.89002 | 4.144 |
| 30.90002 | 4.615 |
| 30.91002 | 4.655 |
| 30.92002 | 4.274 |
| 30.93002 | 3.577 |
| 30.94002 | 2.727 |
| 30.95002 | 1.896 |
| 30.96002 | 1.212 |
| 30.97002 | 0.737 |
| 30.98002 | 0.469 |
| 30.99002 | 0.362 |
| 31.00002 | 0.362 |
| 31.01002 | 0.43 |
| 31.02002 | 0.55 |
| 31.03002 | 0.72 |
| 31.04002 | 0.933 |
| 31.05002 | 1.158 |
| 31.06002 | 1.342 |
| 31.07002 | 1.419 |
| 31.08002 | 1.337 |
| 31.09002 | 1.082 |
| 31.10002 | 0.687 |
| 31.11002 | 0.226 |
| 31.12002 | -0.209 |
| 31.13002 | -0.536 |
| 31.14002 | -0.711 |
| 31.15002 | -0.737 |
| 31.16002 | -0.653 |
| 31.17002 | -0.512 |
| 31.18002 | -0.36 |
| 31.19002 | -0.217 |
| 31.20002 | -0.076 |
| 31.21002 | 0.084 |
| 31.22002 | 0.28 |
| 31.23002 | 0.509 |
| 31.24002 | 0.746 |
| 31.25002 | 0.946 |
| 31.26002 | 1.067 |
| 31.27002 | 1.088 |
| 31.28002 | 1.017 |
| 31.29002 | 0.893 |
| 31.30002 | 0.764 |
| 31.31002 | 0.674 |
| 31.32002 | 0.636 |
| 31.33002 | 0.632 |
| 31.34002 | 0.617 |
| 31.35002 | 0.534 |
| 31.36002 | 0.34 |
| 31.37002 | 0.023 |
| 31.38002 | -0.392 |
| 31.39002 | -0.849 |
| 31.40002 | -1.273 |
| 31.41002 | -1.59 |
| 31.42002 | -1.748 |
| 31.43002 | -1.723 |
| 31.44002 | -1.524 |
| 31.45002 | -1.187 |
| 31.46002 | -0.77 |
| 31.47002 | -0.344 |
| 31.48002 | 0.021 |
| 31.49002 | 0.256 |
| 31.50002 | 0.312 |
| 31.51002 | 0.161 |
| 31.52002 | -0.188 |
| 31.53002 | -0.688 |
| 31.54002 | -1.257 |
| 31.55002 | -1.788 |
| 31.56002 | -2.17 |
| 31.57002 | -2.307 |
| 31.58002 | -2.149 |
| 31.59002 | -1.701 |
| 31.60002 | -1.028 |
| 31.61002 | -0.247 |
| 31.62002 | 0.497 |
| 31.63002 | 1.064 |
| 31.64002 | 1.348 |
| 31.65002 | 1.302 |
| 31.66002 | 0.951 |
| 31.67002 | 0.387 |
| 31.68002 | -0.257 |
| 31.69002 | -0.834 |
| 31.70002 | -1.224 |
| 31.71002 | -1.362 |
| 31.72002 | -1.253 |
| 31.73002 | -0.968 |
| 31.74002 | -0.614 |
| 31.75002 | -0.308 |
| 31.76002 | -0.13 |
| 31.77002 | -0.104 |
| 31.78002 | -0.188 |
| 31.79002 | -0.289 |
| 31.80002 | -0.296 |
| 31.81002 | -0.12 |
| 31.82002 | 0.277 |
| 31.83002 | 0.862 |
| 31.84002 | 1.538 |
| 31.85002 | 2.168 |
| 31.86002 | 2.609 |
| 31.87002 | 2.755 |
| 31.88002 | 2.561 |
| 31.89002 | 2.056 |
| 31.90002 | 1.34 |
| 31.91002 | 0.554 |
| 31.92002 | -0.143 |
| 31.93002 | -0.619 |
| 31.94002 | -0.795 |
| 31.95002 | -0.662 |
| 31.96002 | -0.282 |
| 31.97002 | 0.228 |
| 31.98002 | 0.725 |
| 31.99002 | 1.081 |
| 32.00002 | 1.212 |
| 32.01002 | 1.097 |
| 32.02002 | 0.784 |
| 32.03002 | 0.365 |
| 32.04002 | -0.052 |
| 32.05002 | -0.379 |
| 32.06002 | -0.574 |
| 32.07002 | -0.644 |
| 32.08002 | -0.635 |
| 32.09002 | -0.599 |
| 32.10002 | -0.573 |
| 32.11002 | -0.56 |
| 32.12002 | -0.535 |
| 32.13002 | -0.465 |
| 32.14002 | -0.338 |
| 32.15002 | -0.183 |
| 32.16002 | -0.074 |
| 32.17002 | -0.107 |
| 32.18002 | -0.361 |
| 32.19002 | -0.861 |
| 32.20002 | -1.551 |
| 32.21002 | -2.302 |
| 32.22002 | -2.945 |
| 32.23002 | -3.321 |
| 32.24002 | -3.329 |
| 32.25002 | -2.962 |
| 32.26002 | -2.303 |
| 32.27002 | -1.496 |
| 32.28002 | -0.699 |
| 32.29002 | -0.034 |
| 32.30002 | 0.435 |
| 32.31002 | 0.712 |
| 32.32002 | 0.843 |
| 32.33002 | 0.888 |
| 32.34002 | 0.892 |
| 32.35002 | 0.869 |
| 32.36002 | 0.815 |
| 32.37002 | 0.719 |
| 32.38002 | 0.587 |
| 32.39002 | 0.446 |
| 32.40002 | 0.343 |
| 32.41002 | 0.324 |
| 32.42002 | 0.411 |
| 32.43002 | 0.591 |
| 32.44002 | 0.816 |
| 32.45002 | 1.016 |
| 32.46002 | 1.132 |
| 32.47002 | 1.131 |
| 32.48002 | 1.025 |
| 32.49002 | 0.859 |
| 32.50002 | 0.696 |
| 32.51002 | 0.592 |
| 32.52002 | 0.571 |
| 32.53002 | 0.62 |
| 32.54002 | 0.694 |
| 32.55002 | 0.734 |
| 32.56002 | 0.695 |
| 32.57002 | 0.554 |
| 32.58002 | 0.326 |
| 32.59002 | 0.053 |
| 32.60002 | -0.208 |
| 32.61002 | -0.403 |
| 32.62002 | -0.494 |
| 32.63002 | -0.467 |
| 32.64002 | -0.332 |
| 32.65002 | -0.11 |
| 32.66002 | 0.167 |
| 32.67002 | 0.473 |
| 32.68002 | 0.784 |
| 32.69002 | 1.082 |
| 32.70002 | 1.35 |
| 32.71002 | 1.571 |
| 32.72002 | 1.727 |
| 32.73002 | 1.797 |
| 32.74002 | 1.769 |
| 32.75002 | 1.642 |
| 32.76002 | 1.43 |
| 32.77002 | 1.163 |
| 32.78002 | 0.884 |
| 32.79002 | 0.635 |
| 32.80002 | 0.45 |
| 32.81002 | 0.343 |
| 32.82002 | 0.309 |
| 32.83002 | 0.324 |
| 32.84002 | 0.357 |
| 32.85002 | 0.384 |
| 32.86002 | 0.393 |
| 32.87002 | 0.388 |
| 32.88002 | 0.385 |
| 32.89002 | 0.393 |
| 32.90002 | 0.407 |
| 32.91002 | 0.401 |
| 32.92002 | 0.333 |
| 32.93002 | 0.168 |
| 32.94002 | -0.105 |
| 32.95002 | -0.45 |
| 32.96002 | -0.784 |
| 32.97002 | -0.992 |
| 32.98002 | -0.962 |
| 32.99002 | -0.622 |
| 33.00002 | 0.026 |
| 33.01002 | 0.892 |
| 33.02002 | 1.82 |
| 33.03002 | 2.622 |
| 33.04002 | 3.135 |
| 33.05002 | 3.263 |
| 33.06002 | 3.006 |
| 33.07002 | 2.457 |
| 33.08002 | 1.769 |
| 33.09002 | 1.109 |
| 33.10002 | 0.607 |
| 33.11002 | 0.324 |
| 33.12002 | 0.241 |
| 33.13002 | 0.277 |
| 33.14002 | 0.317 |
| 33.15002 | 0.26 |
| 33.16002 | 0.046 |
| 33.17002 | -0.321 |
| 33.18002 | -0.775 |
| 33.19002 | -1.211 |
| 33.20002 | -1.513 |
| 33.21002 | -1.596 |
| 33.22002 | -1.425 |
| 33.23002 | -1.035 |
| 33.24002 | -0.521 |
| 33.25002 | -0.01 |
| 33.26002 | 0.373 |
| 33.27002 | 0.544 |
| 33.28002 | 0.486 |
| 33.29002 | 0.252 |
| 33.30002 | -0.051 |
| 33.31002 | -0.308 |
| 33.32002 | -0.438 |
| 33.33002 | -0.422 |
| 33.34002 | -0.319 |
| 33.35002 | -0.235 |
| 33.36002 | -0.286 |
| 33.37002 | -0.542 |
| 33.38002 | -0.992 |
| 33.39002 | -1.542 |
| 33.40002 | -2.039 |
| 33.41002 | -2.329 |
| 33.42002 | -2.313 |
| 33.43002 | -1.98 |
| 33.44002 | -1.418 |
| 33.45002 | -0.772 |
| 33.46002 | -0.191 |
| 33.47002 | 0.227 |
| 33.48002 | 0.47 |
| 33.49002 | 0.604 |
| 33.50002 | 0.739 |
| 33.51002 | 0.974 |
| 33.52002 | 1.346 |
| 33.53002 | 1.812 |
| 33.54002 | 2.265 |
| 33.55002 | 2.579 |
| 33.56002 | 2.657 |
| 33.57002 | 2.476 |
| 33.58002 | 2.092 |
| 33.59002 | 1.618 |
| 33.60002 | 1.182 |
| 33.61002 | 0.874 |
| 33.62002 | 0.724 |
| 33.63002 | 0.694 |
| 33.64002 | 0.713 |
| 33.65002 | 0.706 |
| 33.66002 | 0.632 |
| 33.67002 | 0.499 |
| 33.68002 | 0.352 |
| 33.69002 | 0.244 |
| 33.70002 | 0.212 |
| 33.71002 | 0.249 |
| 33.72002 | 0.312 |
| 33.73002 | 0.341 |
| 33.74002 | 0.283 |
| 33.75002 | 0.122 |
| 33.76002 | -0.117 |
| 33.77002 | -0.371 |
| 33.78002 | -0.571 |
| 33.79002 | -0.662 |
| 33.80002 | -0.625 |
| 33.81002 | -0.476 |
| 33.82002 | -0.256 |
| 33.83002 | -0.009 |
| 33.84002 | 0.236 |
| 33.85002 | 0.475 |
| 33.86002 | 0.72 |
| 33.87002 | 0.986 |
| 33.88002 | 1.271 |
| 33.89002 | 1.552 |
| 33.90002 | 1.783 |
| 33.91002 | 1.916 |
| 33.92002 | 1.917 |
| 33.93002 | 1.783 |
| 33.94002 | 1.549 |
| 33.95002 | 1.271 |
| 33.96002 | 1.016 |
| 33.97002 | 0.829 |
| 33.98002 | 0.727 |
| 33.99002 | 0.688 |
| 34.00002 | 0.67 |
| 34.01002 | 0.626 |
| 34.02002 | 0.521 |
| 34.03002 | 0.352 |
| 34.04002 | 0.142 |
| 34.05002 | -0.07 |
| 34.06002 | -0.244 |
| 34.07002 | -0.356 |
| 34.08002 | -0.404 |
| 34.09002 | -0.405 |
| 34.10002 | -0.385 |
| 34.11002 | -0.367 |
| 34.12002 | -0.362 |
| 34.13002 | -0.366 |
| 34.14002 | -0.365 |
| 34.15002 | -0.349 |
| 34.16002 | -0.314 |
| 34.17002 | -0.27 |
| 34.18002 | -0.234 |
| 34.19002 | -0.22 |
| 34.20002 | -0.233 |
| 34.21002 | -0.259 |
| 34.22002 | -0.269 |
| 34.23002 | -0.23 |
| 34.24002 | -0.118 |
| 34.25002 | 0.072 |
| 34.26002 | 0.319 |
| 34.27002 | 0.58 |
| 34.28002 | 0.802 |
| 34.29002 | 0.94 |
| 34.30002 | 0.968 |
| 34.31002 | 0.888 |
| 34.32002 | 0.726 |
| 34.33002 | 0.528 |
| 34.34002 | 0.337 |
| 34.35002 | 0.189 |
| 34.36002 | 0.096 |
| 34.37002 | 0.05 |
| 34.38002 | 0.027 |
| 34.39002 | 0 |
| 34.40002 | -0.051 |
| 34.41002 | -0.132 |
| 34.42002 | -0.231 |
| 34.43002 | -0.324 |
| 34.44002 | -0.383 |
| 34.45002 | -0.384 |
| 34.46002 | -0.316 |
| 34.47002 | -0.186 |
| 34.48002 | -0.011 |
| 34.49002 | 0.178 |
| 34.50002 | 0.352 |
| 34.51002 | 0.487 |
| 34.52002 | 0.568 |
| 34.53002 | 0.59 |
| 34.54002 | 0.558 |
| 34.55002 | 0.486 |
| 34.56002 | 0.39 |
| 34.57002 | 0.293 |
| 34.58002 | 0.214 |
| 34.59002 | 0.173 |
| 34.60002 | 0.184 |
| 34.61002 | 0.251 |
| 34.62002 | 0.363 |
| 34.63002 | 0.498 |
| 34.64002 | 0.623 |
| 34.65002 | 0.701 |
| 34.66002 | 0.704 |
| 34.67002 | 0.619 |
| 34.68002 | 0.456 |
| 34.69002 | 0.241 |
| 34.70002 | 0.014 |
| 34.71002 | -0.187 |
| 34.72002 | -0.333 |
| 34.73002 | -0.412 |
| 34.74002 | -0.429 |
| 34.75002 | -0.399 |
| 34.76002 | -0.34 |
| 34.77002 | -0.264 |
| 34.78002 | -0.178 |
| 34.79002 | -0.082 |
| 34.80002 | 0.018 |
| 34.81002 | 0.11 |
| 34.82002 | 0.174 |
| 34.83002 | 0.182 |
| 34.84002 | 0.112 |
| 34.85002 | -0.043 |
| 34.86002 | -0.268 |
| 34.87002 | -0.523 |
| 34.88002 | -0.758 |
| 34.89002 | -0.923 |
| 34.90002 | -0.981 |
| 34.91002 | -0.923 |
| 34.92002 | -0.766 |
| 34.93002 | -0.546 |
| 34.94002 | -0.31 |
| 34.95002 | -0.095 |
| 34.96002 | 0.078 |
| 34.97002 | 0.204 |
| 34.98002 | 0.291 |
| 34.99002 | 0.356 |
| 35.00002 | 0.408 |
| 35.01002 | 0.452 |
| 35.02002 | 0.484 |
| 35.03002 | 0.497 |
| 35.04002 | 0.487 |
| 35.05002 | 0.457 |
| 35.06002 | 0.415 |
| 35.07002 | 0.373 |
| 35.08002 | 0.341 |
| 35.09002 | 0.321 |
| 35.10002 | 0.31 |
| 35.11002 | 0.298 |
| 35.12002 | 0.278 |
| 35.13002 | 0.246 |
| 35.14002 | 0.206 |
| 35.15002 | 0.167 |
| 35.16002 | 0.143 |
| 35.17002 | 0.141 |
| 35.18002 | 0.164 |
| 35.19002 | 0.206 |
| 35.20002 | 0.256 |
| 35.21002 | 0.3 |
| 35.22002 | 0.33 |
| 35.23002 | 0.344 |
| 35.24002 | 0.343 |
| 35.25002 | 0.33 |
| 35.26002 | 0.309 |
| 35.27002 | 0.28 |
| 35.28002 | 0.243 |
| 35.29002 | 0.198 |
| 35.30002 | 0.15 |
| 35.31002 | 0.113 |
| 35.32002 | 0.103 |
| 35.33002 | 0.138 |
| 35.34002 | 0.227 |
| 35.35002 | 0.372 |
| 35.36002 | 0.559 |
| 35.37002 | 0.764 |
| 35.38002 | 0.958 |
| 35.39002 | 1.113 |
| 35.40002 | 1.209 |
| 35.41002 | 1.234 |
| 35.42002 | 1.186 |
| 35.43002 | 1.069 |
| 35.44002 | 0.893 |
| 35.45002 | 0.674 |
| 35.46002 | 0.436 |
| 35.47002 | 0.21 |
| 35.48002 | 0.031 |
| 35.49002 | -0.063 |
| 35.50002 | -0.045 |
| 35.51002 | 0.091 |
| 35.52002 | 0.327 |
| 35.53002 | 0.619 |
| 35.54002 | 0.905 |
| 35.55002 | 1.122 |
| 35.56002 | 1.222 |
| 35.57002 | 1.186 |
| 35.58002 | 1.031 |
| 35.59002 | 0.799 |
| 35.60002 | 0.549 |
| 35.61002 | 0.333 |
| 35.62002 | 0.185 |
| 35.63002 | 0.111 |
| 35.64002 | 0.088 |
| 35.65002 | 0.078 |
| 35.66002 | 0.044 |
| 35.67002 | -0.039 |
| 35.68002 | -0.169 |
| 35.69002 | -0.322 |
| 35.70002 | -0.451 |
| 35.71002 | -0.511 |
| 35.72002 | -0.464 |
| 35.73002 | -0.303 |
| 35.74002 | -0.048 |
| 35.75002 | 0.25 |
| 35.76002 | 0.526 |
| 35.77002 | 0.717 |
| 35.78002 | 0.782 |
| 35.79002 | 0.716 |
| 35.80002 | 0.551 |
| 35.81002 | 0.347 |
| 35.82002 | 0.173 |
| 35.83002 | 0.087 |
| 35.84002 | 0.113 |
| 35.85002 | 0.238 |
| 35.86002 | 0.416 |
| 35.87002 | 0.584 |
| 35.88002 | 0.686 |
| 35.89002 | 0.694 |
| 35.90002 | 0.611 |
| 35.91002 | 0.475 |
| 35.92002 | 0.332 |
| 35.93002 | 0.225 |
| 35.94002 | 0.172 |
| 35.95002 | 0.165 |
| 35.96002 | 0.18 |
| 35.97002 | 0.19 |
| 35.98002 | 0.184 |
| 35.99002 | 0.177 |
| 36.00002 | 0.202 |
| 36.01002 | 0.299 |
| 36.02002 | 0.493 |
| 36.03002 | 0.777 |
| 36.04002 | 1.109 |
| 36.05002 | 1.422 |
| 36.06002 | 1.646 |
| 36.07002 | 1.73 |
| 36.08002 | 1.658 |
| 36.09002 | 1.454 |
| 36.10002 | 1.174 |
| 36.11002 | 0.88 |
| 36.12002 | 0.627 |
| 36.13002 | 0.443 |
| 36.14002 | 0.331 |
| 36.15002 | 0.275 |
| 36.16002 | 0.254 |
| 36.17002 | 0.254 |
| 36.18002 | 0.273 |
| 36.19002 | 0.316 |
| 36.20002 | 0.389 |
| 36.21002 | 0.487 |
| 36.22002 | 0.591 |
| 36.23002 | 0.672 |
| 36.24002 | 0.701 |
| 36.25002 | 0.66 |
| 36.26002 | 0.552 |
| 36.27002 | 0.397 |
| 36.28002 | 0.233 |
| 36.29002 | 0.093 |
| 36.30002 | 0.002 |
| 36.31002 | -0.036 |
| 36.32002 | -0.033 |
| 36.33002 | -0.013 |
| 36.34002 | 0.003 |
| 36.35002 | 0.004 |
| 36.36002 | -0.006 |
| 36.37002 | -0.01 |
| 36.38002 | 0.009 |
| 36.39002 | 0.064 |
| 36.40002 | 0.155 |
| 36.41002 | 0.267 |
| 36.42002 | 0.376 |
| 36.43002 | 0.458 |
| 36.44002 | 0.501 |
| 36.45002 | 0.501 |
| 36.46002 | 0.469 |
| 36.47002 | 0.422 |
| 36.48002 | 0.376 |
| 36.49002 | 0.337 |
| 36.50002 | 0.303 |
| 36.51002 | 0.264 |
| 36.52002 | 0.208 |
| 36.53002 | 0.128 |
| 36.54002 | 0.027 |
| 36.55002 | -0.083 |
| 36.56002 | -0.183 |
| 36.57002 | -0.254 |
| 36.58002 | -0.284 |
| 36.59002 | -0.271 |
| 36.60002 | -0.219 |
| 36.61002 | -0.143 |
| 36.62002 | -0.056 |
| 36.63002 | 0.029 |
| 36.64002 | 0.101 |
| 36.65002 | 0.153 |
| 36.66002 | 0.179 |
| 36.67002 | 0.174 |
| 36.68002 | 0.13 |
| 36.69002 | 0.046 |
| 36.70002 | -0.076 |
| 36.71002 | -0.222 |
| 36.72002 | -0.369 |
| 36.73002 | -0.484 |
| 36.74002 | -0.538 |
| 36.75002 | -0.507 |
| 36.76002 | -0.384 |
| 36.77002 | -0.182 |
| 36.78002 | 0.063 |
| 36.79002 | 0.308 |
| 36.80002 | 0.501 |
| 36.81002 | 0.607 |
| 36.82002 | 0.604 |
| 36.83002 | 0.499 |
| 36.84002 | 0.32 |
| 36.85002 | 0.111 |
| 36.86002 | -0.081 |
| 36.87002 | -0.218 |
| 36.88002 | -0.279 |
| 36.89002 | -0.264 |
| 36.90002 | -0.194 |
| 36.91002 | -0.101 |
| 36.92002 | -0.017 |
| 36.93002 | 0.035 |
| 36.94002 | 0.048 |
| 36.95002 | 0.034 |
| 36.96002 | 0.017 |
| 36.97002 | 0.028 |
| 36.98002 | 0.09 |
| 36.99002 | 0.213 |
| 37.00002 | 0.389 |
| 37.01002 | 0.592 |
| 37.02002 | 0.784 |
| 37.03002 | 0.924 |
| 37.04002 | 0.98 |
| 37.05002 | 0.939 |
| 37.06002 | 0.806 |
| 37.07002 | 0.612 |
| 37.08002 | 0.398 |
| 37.09002 | 0.213 |
| 37.10002 | 0.095 |
| 37.11002 | 0.067 |
| 37.12002 | 0.123 |
| 37.13002 | 0.238 |
| 37.14002 | 0.369 |
| 37.15002 | 0.474 |
| 37.16002 | 0.519 |
| 37.17002 | 0.493 |
| 37.18002 | 0.406 |
| 37.19002 | 0.289 |
| 37.20002 | 0.177 |
| 37.21002 | 0.097 |
| 37.22002 | 0.062 |
| 37.23002 | 0.063 |
| 37.24002 | 0.08 |
| 37.25002 | 0.089 |
| 37.26002 | 0.075 |
| 37.27002 | 0.04 |
| 37.28002 | 0.002 |
| 37.29002 | -0.017 |
| 37.30002 | 0 |
| 37.31002 | 0.052 |
| 37.32002 | 0.118 |
| 37.33002 | 0.162 |
| 37.34002 | 0.143 |
| 37.35002 | 0.04 |
| 37.36002 | -0.145 |
| 37.37002 | -0.382 |
| 37.38002 | -0.62 |
| 37.39002 | -0.802 |
| 37.40002 | -0.89 |
| 37.41002 | -0.867 |
| 37.42002 | -0.748 |
| 37.43002 | -0.569 |
| 37.44002 | -0.374 |
| 37.45002 | -0.198 |
| 37.46002 | -0.061 |
| 37.47002 | 0.035 |
| 37.48002 | 0.103 |
| 37.49002 | 0.156 |
| 37.50002 | 0.2 |
| 37.51002 | 0.233 |
| 37.52002 | 0.244 |
| 37.53002 | 0.225 |
| 37.54002 | 0.174 |
| 37.55002 | 0.102 |
| 37.56002 | 0.029 |
| 37.57002 | -0.02 |
| 37.58002 | -0.025 |
| 37.59002 | 0.021 |
| 37.60002 | 0.109 |
| 37.61002 | 0.216 |
| 37.62002 | 0.317 |
| 37.63002 | 0.389 |
| 37.64002 | 0.417 |
| 37.65002 | 0.401 |
| 37.66002 | 0.351 |
| 37.67002 | 0.279 |
| 37.68002 | 0.201 |
| 37.69002 | 0.127 |
| 37.70002 | 0.065 |
| 37.71002 | 0.019 |
| 37.72002 | -0.007 |
| 37.73002 | -0.006 |
| 37.74002 | 0.023 |
| 37.75002 | 0.081 |
| 37.76002 | 0.16 |
| 37.77002 | 0.243 |
| 37.78002 | 0.308 |
| 37.79002 | 0.334 |
| 37.80002 | 0.308 |
| 37.81002 | 0.232 |
| 37.82002 | 0.126 |
| 37.83002 | 0.026 |
| 37.84002 | -0.029 |
| 37.85002 | -0.003 |
| 37.86002 | 0.12 |
| 37.87002 | 0.333 |
| 37.88002 | 0.603 |
| 37.89002 | 0.88 |
| 37.90002 | 1.109 |
| 37.91002 | 1.246 |
| 37.92002 | 1.268 |
| 37.93002 | 1.18 |
| 37.94002 | 1.009 |
| 37.95002 | 0.8 |
| 37.96002 | 0.598 |
| 37.97002 | 0.444 |
| 37.98002 | 0.357 |
| 37.99002 | 0.342 |
| 38.00002 | 0.385 |
| 38.01002 | 0.463 |
| 38.02002 | 0.55 |
| 38.03002 | 0.623 |
| 38.04002 | 0.664 |
| 38.05002 | 0.665 |
| 38.06002 | 0.625 |
| 38.07002 | 0.552 |
| 38.08002 | 0.459 |
| 38.09002 | 0.364 |
| 38.10002 | 0.286 |
| 38.11002 | 0.241 |
| 38.12002 | 0.238 |
| 38.13002 | 0.272 |
| 38.14002 | 0.332 |
| 38.15002 | 0.393 |
| 38.16002 | 0.432 |
| 38.17002 | 0.432 |
| 38.18002 | 0.388 |
| 38.19002 | 0.311 |
| 38.20002 | 0.224 |
| 38.21002 | 0.155 |
| 38.22002 | 0.13 |
| 38.23002 | 0.16 |
| 38.24002 | 0.238 |
| 38.25002 | 0.343 |
| 38.26002 | 0.442 |
| 38.27002 | 0.503 |
| 38.28002 | 0.504 |
| 38.29002 | 0.436 |
| 38.30002 | 0.31 |
| 38.31002 | 0.148 |
| 38.32002 | -0.017 |
| 38.33002 | -0.156 |
| 38.34002 | -0.241 |
| 38.35002 | -0.254 |
| 38.36002 | -0.19 |
| 38.37002 | -0.052 |
| 38.38002 | 0.145 |
| 38.39002 | 0.379 |
| 38.40002 | 0.619 |
| 38.41002 | 0.834 |
| 38.42002 | 0.995 |
| 38.43002 | 1.082 |
| 38.44002 | 1.085 |
| 38.45002 | 1.012 |
| 38.46002 | 0.883 |
| 38.47002 | 0.727 |
| 38.48002 | 0.576 |
| 38.49002 | 0.456 |
| 38.50002 | 0.385 |
| 38.51002 | 0.37 |
| 38.52002 | 0.409 |
| 38.53002 | 0.492 |
| 38.54002 | 0.605 |
| 38.55002 | 0.733 |
| 38.56002 | 0.861 |
| 38.57002 | 0.974 |
| 38.58002 | 1.055 |
| 38.59002 | 1.092 |
| 38.60002 | 1.08 |
| 38.61002 | 1.02 |
| 38.62002 | 0.924 |
| 38.63002 | 0.816 |
| 38.64002 | 0.72 |
| 38.65002 | 0.661 |
| 38.66002 | 0.654 |
| 38.67002 | 0.699 |
| 38.68002 | 0.784 |
| 38.69002 | 0.886 |
| 38.70002 | 0.976 |
| 38.71002 | 1.031 |
| 38.72002 | 1.038 |
| 38.73002 | 0.991 |
| 38.74002 | 0.899 |
| 38.75002 | 0.776 |
| 38.76002 | 0.636 |
| 38.77002 | 0.494 |
| 38.78002 | 0.363 |
| 38.79002 | 0.251 |
| 38.80002 | 0.164 |
| 38.81002 | 0.106 |
| 38.82002 | 0.079 |
| 38.83002 | 0.079 |
| 38.84002 | 0.097 |
| 38.85002 | 0.119 |
| 38.86002 | 0.13 |
| 38.87002 | 0.116 |
| 38.88002 | 0.071 |
| 38.89002 | -0.003 |
| 38.90002 | -0.092 |
| 38.91002 | -0.176 |
| 38.92002 | -0.234 |
| 38.93002 | -0.249 |
| 38.94002 | -0.215 |
| 38.95002 | -0.137 |
| 38.96002 | -0.031 |
| 38.97002 | 0.081 |
| 38.98002 | 0.18 |
| 38.99002 | 0.248 |
| 39.00002 | 0.282 |
| 39.01002 | 0.282 |
| 39.02002 | 0.259 |
| 39.03002 | 0.221 |
| 39.04002 | 0.179 |
| 39.05002 | 0.136 |
| 39.06002 | 0.095 |
| 39.07002 | 0.056 |
| 39.08002 | 0.02 |
| 39.09002 | -0.007 |
| 39.10002 | -0.02 |
| 39.11002 | -0.011 |
| 39.12002 | 0.022 |
| 39.13002 | 0.074 |
| 39.14002 | 0.133 |
| 39.15002 | 0.181 |
| 39.16002 | 0.201 |
| 39.17002 | 0.18 |
| 39.18002 | 0.114 |
| 39.19002 | 0.015 |
| 39.20002 | -0.101 |
| 39.21002 | -0.212 |
| 39.22002 | -0.298 |
| 39.23002 | -0.347 |
| 39.24002 | -0.356 |
| 39.25002 | -0.326 |
| 39.26002 | -0.263 |
| 39.27002 | -0.175 |
| 39.28002 | -0.065 |
| 39.29002 | 0.058 |
| 39.30002 | 0.182 |
| 39.31002 | 0.288 |
| 39.32002 | 0.349 |
| 39.33002 | 0.34 |
| 39.34002 | 0.244 |
| 39.35002 | 0.064 |
| 39.36002 | -0.174 |
| 39.37002 | -0.426 |
| 39.38002 | -0.634 |
| 39.39002 | -0.748 |
| 39.40002 | -0.738 |
| 39.41002 | -0.606 |
| 39.42002 | -0.387 |
| 39.43002 | -0.135 |
| 39.44002 | 0.09 |
| 39.45002 | 0.244 |
| 39.46002 | 0.309 |
| 39.47002 | 0.299 |
| 39.48002 | 0.252 |
| 39.49002 | 0.216 |
| 39.50002 | 0.229 |
| 39.51002 | 0.309 |
| 39.52002 | 0.444 |
| 39.53002 | 0.602 |
| 39.54002 | 0.736 |
| 39.55002 | 0.807 |
| 39.56002 | 0.789 |
| 39.57002 | 0.685 |
| 39.58002 | 0.519 |
| 39.59002 | 0.336 |
| 39.60002 | 0.185 |
| 39.61002 | 0.105 |
| 39.62002 | 0.115 |
| 39.63002 | 0.208 |
| 39.64002 | 0.354 |
| 39.65002 | 0.509 |
| 39.66002 | 0.628 |
| 39.67002 | 0.679 |
| 39.68002 | 0.652 |
| 39.69002 | 0.565 |
| 39.70002 | 0.454 |
| 39.71002 | 0.365 |
| 39.72002 | 0.335 |
| 39.73002 | 0.38 |
| 39.74002 | 0.49 |
| 39.75002 | 0.633 |
| 39.76002 | 0.766 |
| 39.77002 | 0.849 |
| 39.78002 | 0.859 |
| 39.79002 | 0.796 |
| 39.80002 | 0.68 |
| 39.81002 | 0.539 |
| 39.82002 | 0.401 |
| 39.83002 | 0.276 |
| 39.84002 | 0.159 |
| 39.85002 | 0.032 |
| 39.86002 | -0.12 |
| 39.87002 | -0.303 |
| 39.88002 | -0.503 |
| 39.89002 | -0.688 |
| 39.90002 | -0.819 |
| 39.91002 | -0.865 |
| 39.92002 | -0.813 |
| 39.93002 | -0.677 |
| 39.94002 | -0.49 |
| 39.95002 | -0.299 |
| 39.96002 | -0.147 |
| 39.97002 | -0.059 |
| 39.98002 | -0.039 |
| 39.99002 | -0.074 |
| 40.00002 | -0.136 |
| 40.01002 | -0.199 |
| 40.02002 | -0.246 |
| 40.03002 | -0.27 |
| 40.04002 | -0.27 |
| 40.05002 | -0.252 |
| 40.06002 | -0.214 |
| 40.07002 | -0.154 |
| 40.08002 | -0.064 |
| 40.09002 | 0.058 |
| 40.10002 | 0.208 |
| 40.11002 | 0.371 |
| 40.12002 | 0.523 |
| 40.13002 | 0.637 |
| 40.14002 | 0.697 |
| 40.15002 | 0.695 |
| 40.16002 | 0.64 |
| 40.17002 | 0.553 |
| 40.18002 | 0.456 |
| 40.19002 | 0.368 |
| 40.20002 | 0.299 |
| 40.21002 | 0.246 |
| 40.22002 | 0.199 |
| 40.23002 | 0.146 |
| 40.24002 | 0.082 |
| 40.25002 | 0.008 |
| 40.26002 | -0.067 |
| 40.27002 | -0.128 |
| 40.28002 | -0.162 |
| 40.29002 | -0.164 |
| 40.30002 | -0.134 |
| 40.31002 | -0.08 |
| 40.32002 | -0.012 |
| 40.33002 | 0.058 |
| 40.34002 | 0.125 |
| 40.35002 | 0.186 |
| 40.36002 | 0.242 |
| 40.37002 | 0.295 |
| 40.38002 | 0.343 |
| 40.39002 | 0.383 |
| 40.40002 | 0.411 |
| 40.41002 | 0.425 |
| 40.42002 | 0.425 |
| 40.43002 | 0.417 |
| 40.44002 | 0.41 |
| 40.45002 | 0.414 |
| 40.46002 | 0.434 |
| 40.47002 | 0.473 |
| 40.48002 | 0.523 |
| 40.49002 | 0.576 |
| 40.50002 | 0.619 |
| 40.51002 | 0.645 |
| 40.52002 | 0.65 |
| 40.53002 | 0.636 |
| 40.54002 | 0.609 |
| 40.55002 | 0.579 |
| 40.56002 | 0.552 |
| 40.57002 | 0.529 |
| 40.58002 | 0.505 |
| 40.59002 | 0.472 |
| 40.60002 | 0.421 |
| 40.61002 | 0.346 |
| 40.62002 | 0.249 |
| 40.63002 | 0.142 |
| 40.64002 | 0.045 |
| 40.65002 | -0.019 |
| 40.66002 | -0.029 |
| 40.67002 | 0.029 |
| 40.68002 | 0.153 |
| 40.69002 | 0.324 |
| 40.70002 | 0.513 |
| 40.71002 | 0.681 |
| 40.72002 | 0.796 |
| 40.73002 | 0.838 |
| 40.74002 | 0.805 |
| 40.75002 | 0.713 |
| 40.76002 | 0.595 |
| 40.77002 | 0.484 |
| 40.78002 | 0.412 |
| 40.79002 | 0.392 |
| 40.80002 | 0.419 |
| 40.81002 | 0.472 |
| 40.82002 | 0.523 |
| 40.83002 | 0.542 |
| 40.84002 | 0.513 |
| 40.85002 | 0.434 |
| 40.86002 | 0.321 |
| 40.87002 | 0.201 |
| 40.88002 | 0.105 |
| 40.89002 | 0.056 |
| 40.90002 | 0.062 |
| 40.91002 | 0.116 |
| 40.92002 | 0.195 |
| 40.93002 | 0.27 |
| 40.94002 | 0.311 |
| 40.95002 | 0.301 |
| 40.96002 | 0.238 |
| 40.97002 | 0.138 |
| 40.98002 | 0.025 |
| 40.99002 | -0.068 |
| 41.00002 | -0.118 |
| 41.01002 | -0.112 |
| 41.02002 | -0.057 |
| 41.03002 | 0.028 |
| 41.04002 | 0.113 |
| 41.05002 | 0.174 |
| 41.06002 | 0.193 |
| 41.07002 | 0.171 |
| 41.08002 | 0.122 |
| 41.09002 | 0.071 |
| 41.10002 | 0.039 |
| 41.11002 | 0.039 |
| 41.12002 | 0.071 |
| 41.13002 | 0.12 |
| 41.14002 | 0.166 |
| 41.15002 | 0.196 |
| 41.16002 | 0.203 |
| 41.17002 | 0.197 |
| 41.18002 | 0.199 |
| 41.19002 | 0.23 |
| 41.20002 | 0.307 |
| 41.21002 | 0.428 |
| 41.22002 | 0.577 |
| 41.23002 | 0.726 |
| 41.24002 | 0.843 |
| 41.25002 | 0.907 |
| 41.26002 | 0.91 |
| 41.27002 | 0.863 |
| 41.28002 | 0.786 |
| 41.29002 | 0.705 |
| 41.30002 | 0.64 |
| 41.31002 | 0.598 |
| 41.32002 | 0.577 |
| 41.33002 | 0.563 |
| 41.34002 | 0.543 |
| 41.35002 | 0.509 |
| 41.36002 | 0.459 |
| 41.37002 | 0.4 |
| 41.38002 | 0.34 |
| 41.39002 | 0.289 |
| 41.40002 | 0.25 |
| 41.41002 | 0.221 |
| 41.42002 | 0.197 |
| 41.43002 | 0.175 |
| 41.44002 | 0.152 |
| 41.45002 | 0.131 |
| 41.46002 | 0.116 |
| 41.47002 | 0.112 |
| 41.48002 | 0.119 |
| 41.49002 | 0.137 |
| 41.50002 | 0.16 |
| 41.51002 | 0.182 |
| 41.52002 | 0.203 |
| 41.53002 | 0.222 |
| 41.54002 | 0.245 |
| 41.55002 | 0.275 |
| 41.56002 | 0.316 |
| 41.57002 | 0.366 |
| 41.58002 | 0.42 |
| 41.59002 | 0.47 |
| 41.60002 | 0.508 |
| 41.61002 | 0.529 |
| 41.62002 | 0.536 |
| 41.63002 | 0.532 |
| 41.64002 | 0.525 |
| 41.65002 | 0.521 |
| 41.66002 | 0.523 |
| 41.67002 | 0.528 |
| 41.68002 | 0.529 |
| 41.69002 | 0.518 |
| 41.70002 | 0.488 |
| 41.71002 | 0.437 |
| 41.72002 | 0.367 |
| 41.73002 | 0.286 |
| 41.74002 | 0.202 |
| 41.75002 | 0.127 |
| 41.76002 | 0.069 |
| 41.77002 | 0.033 |
| 41.78002 | 0.022 |
| 41.79002 | 0.032 |
| 41.80002 | 0.058 |
| 41.81002 | 0.089 |
| 41.82002 | 0.116 |
| 41.83002 | 0.126 |
| 41.84002 | 0.111 |
| 41.85002 | 0.066 |
| 41.86002 | -0.005 |
| 41.87002 | -0.095 |
| 41.88002 | -0.186 |
| 41.89002 | -0.26 |
| 41.90002 | -0.298 |
| 41.91002 | -0.29 |
| 41.92002 | -0.231 |
| 41.93002 | -0.13 |
| 41.94002 | -0.003 |
| 41.95002 | 0.127 |
| 41.96002 | 0.239 |
| 41.97002 | 0.317 |
| 41.98002 | 0.354 |
| 41.99002 | 0.355 |
| 42.00002 | 0.332 |
| 42.01002 | 0.3 |
| 42.02002 | 0.274 |
| 42.03002 | 0.263 |
| 42.04002 | 0.268 |
| 42.05002 | 0.282 |
| 42.06002 | 0.294 |
| 42.07002 | 0.293 |
| 42.08002 | 0.274 |
| 42.09002 | 0.237 |
| 42.10002 | 0.191 |
| 42.11002 | 0.148 |
| 42.12002 | 0.121 |
| 42.13002 | 0.118 |
| 42.14002 | 0.142 |
| 42.15002 | 0.188 |
| 42.16002 | 0.245 |
| 42.17002 | 0.303 |
| 42.18002 | 0.352 |
| 42.19002 | 0.388 |
| 42.20002 | 0.413 |
| 42.21002 | 0.43 |
| 42.22002 | 0.445 |
| 42.23002 | 0.462 |
| 42.24002 | 0.48 |
| 42.25002 | 0.496 |
| 42.26002 | 0.507 |
| 42.27002 | 0.509 |
| 42.28002 | 0.501 |
| 42.29002 | 0.486 |
| 42.30002 | 0.466 |
| 42.31002 | 0.445 |
| 42.32002 | 0.423 |
| 42.33002 | 0.396 |
| 42.34002 | 0.358 |
| 42.35002 | 0.306 |
| 42.36002 | 0.239 |
| 42.37002 | 0.16 |
| 42.38002 | 0.079 |
| 42.39002 | 0.008 |
| 42.40002 | -0.043 |
| 42.41002 | -0.067 |
| 42.42002 | -0.066 |
| 42.43002 | -0.045 |
| 42.44002 | -0.014 |
| 42.45002 | 0.015 |
| 42.46002 | 0.035 |
| 42.47002 | 0.043 |
| 42.48002 | 0.039 |
| 42.49002 | 0.027 |
| 42.50002 | 0.009 |
| 42.51002 | -0.015 |
| 42.52002 | -0.043 |
| 42.53002 | -0.077 |
| 42.54002 | -0.114 |
| 42.55002 | -0.149 |
| 42.56002 | -0.173 |
| 42.57002 | -0.178 |
| 42.58002 | -0.155 |
| 42.59002 | -0.104 |
| 42.60002 | -0.028 |
| 42.61002 | 0.061 |
| 42.62002 | 0.148 |
| 42.63002 | 0.218 |
| 42.64002 | 0.263 |
| 42.65002 | 0.28 |
| 42.66002 | 0.277 |
| 42.67002 | 0.262 |
| 42.68002 | 0.249 |
| 42.69002 | 0.244 |
| 42.70002 | 0.253 |
| 42.71002 | 0.272 |
| 42.72002 | 0.295 |
| 42.73002 | 0.312 |
| 42.74002 | 0.318 |
| 42.75002 | 0.309 |
| 42.76002 | 0.285 |
| 42.77002 | 0.252 |
| 42.78002 | 0.218 |
| 42.79002 | 0.187 |
| 42.80002 | 0.166 |
| 42.81002 | 0.157 |
| 42.82002 | 0.16 |
| 42.83002 | 0.173 |
| 42.84002 | 0.191 |
| 42.85002 | 0.212 |
| 42.86002 | 0.229 |
| 42.87002 | 0.24 |
| 42.88002 | 0.239 |
| 42.89002 | 0.228 |
| 42.90002 | 0.205 |
| 42.91002 | 0.176 |
| 42.92002 | 0.147 |
| 42.93002 | 0.125 |
| 42.94002 | 0.115 |
| 42.95002 | 0.121 |
| 42.96002 | 0.144 |
| 42.97002 | 0.179 |
| 42.98002 | 0.22 |
| 42.99002 | 0.259 |
| 43.00002 | 0.29 |
| 43.01002 | 0.31 |
| 43.02002 | 0.321 |
| 43.03002 | 0.327 |
| 43.04002 | 0.336 |
| 43.05002 | 0.355 |
| 43.06002 | 0.386 |
| 43.07002 | 0.429 |
| 43.08002 | 0.477 |
| 43.09002 | 0.518 |
| 43.10002 | 0.542 |
| 43.11002 | 0.536 |
| 43.12002 | 0.498 |
| 43.13002 | 0.432 |
| 43.14002 | 0.352 |
| 43.15002 | 0.278 |
| 43.16002 | 0.233 |
| 43.17002 | 0.235 |
| 43.18002 | 0.294 |
| 43.19002 | 0.404 |
| 43.20002 | 0.546 |
| 43.21002 | 0.691 |
| 43.22002 | 0.805 |
| 43.23002 | 0.861 |
| 43.24002 | 0.846 |
| 43.25002 | 0.763 |
| 43.26003 | 0.631 |
| 43.27002 | 0.48 |
| 43.28002 | 0.344 |
| 43.29002 | 0.248 |
| 43.30002 | 0.203 |
| 43.31002 | 0.205 |
| 43.32002 | 0.238 |
| 43.33002 | 0.276 |
| 43.34002 | 0.297 |
| 43.35002 | 0.287 |
| 43.36002 | 0.245 |
| 43.37002 | 0.183 |
| 43.38002 | 0.118 |
| 43.39002 | 0.07 |
| 43.40002 | 0.053 |
| 43.41002 | 0.069 |
| 43.42002 | 0.11 |
| 43.43002 | 0.159 |
| 43.44002 | 0.198 |
| 43.45002 | 0.211 |
| 43.46002 | 0.192 |
| 43.47002 | 0.144 |
| 43.48002 | 0.081 |
| 43.49002 | 0.02 |
| 43.50002 | -0.022 |
| 43.51003 | -0.036 |
| 43.52002 | -0.022 |
| 43.53002 | 0.012 |
| 43.54002 | 0.048 |
| 43.55002 | 0.072 |
| 43.56002 | 0.071 |
| 43.57002 | 0.044 |
| 43.58002 | -0.003 |
| 43.59002 | -0.055 |
| 43.60003 | -0.095 |
| 43.61002 | -0.111 |
| 43.62002 | -0.096 |
| 43.63002 | -0.054 |
| 43.64002 | 0.007 |
| 43.65002 | 0.075 |
| 43.66002 | 0.144 |
| 43.67002 | 0.21 |
| 43.68002 | 0.276 |
| 43.69003 | 0.348 |
| 43.70002 | 0.429 |
| 43.71002 | 0.52 |
| 43.72002 | 0.612 |
| 43.73002 | 0.691 |
| 43.74002 | 0.745 |
| 43.75002 | 0.762 |
| 43.76003 | 0.743 |
| 43.77002 | 0.693 |
| 43.78002 | 0.627 |
| 43.79002 | 0.562 |
| 43.80002 | 0.513 |
| 43.81002 | 0.487 |
| 43.82002 | 0.481 |
| 43.83002 | 0.491 |
| 43.84002 | 0.505 |
| 43.85003 | 0.517 |
| 43.86002 | 0.523 |
| 43.87002 | 0.524 |
| 43.88002 | 0.524 |
| 43.89002 | 0.526 |
| 43.90002 | 0.531 |
| 43.91002 | 0.534 |
| 43.92002 | 0.53 |
| 43.93002 | 0.51 |
| 43.94003 | 0.472 |
| 43.95002 | 0.417 |
| 43.96002 | 0.35 |
| 43.97002 | 0.282 |
| 43.98002 | 0.224 |
| 43.99002 | 0.185 |
| 44.00002 | 0.169 |
| 44.01003 | 0.175 |
| 44.02002 | 0.199 |
| 44.03003 | 0.236 |
| 44.04002 | 0.281 |
| 44.05002 | 0.328 |
| 44.06002 | 0.376 |
| 44.07002 | 0.421 |
| 44.08002 | 0.461 |
| 44.09002 | 0.491 |
| 44.10003 | 0.508 |
| 44.11002 | 0.507 |
| 44.12002 | 0.488 |
| 44.13002 | 0.453 |
| 44.14002 | 0.408 |
| 44.15002 | 0.365 |
| 44.16002 | 0.33 |
| 44.17002 | 0.313 |
| 44.18002 | 0.312 |
| 44.19003 | 0.323 |
| 44.20002 | 0.336 |
| 44.21002 | 0.34 |
| 44.22002 | 0.325 |
| 44.23002 | 0.286 |
| 44.24002 | 0.226 |
| 44.25002 | 0.157 |
| 44.26003 | 0.091 |
| 44.27002 | 0.042 |
| 44.28003 | 0.018 |
| 44.29002 | 0.021 |
| 44.30002 | 0.043 |
| 44.31002 | 0.074 |
| 44.32002 | 0.101 |
| 44.33002 | 0.115 |
| 44.34002 | 0.112 |
| 44.35003 | 0.097 |
| 44.36002 | 0.079 |
| 44.37003 | 0.07 |
| 44.38002 | 0.079 |
| 44.39002 | 0.111 |
| 44.40002 | 0.164 |
| 44.41002 | 0.229 |
| 44.42002 | 0.298 |
| 44.43002 | 0.359 |
| 44.44003 | 0.407 |
| 44.45002 | 0.436 |
| 44.46002 | 0.446 |
| 44.47002 | 0.436 |
| 44.48002 | 0.406 |
| 44.49002 | 0.356 |
| 44.50002 | 0.287 |
| 44.51003 | 0.2 |
| 44.52002 | 0.103 |
| 44.53003 | 0.005 |
| 44.54002 | -0.08 |
| 44.55002 | -0.139 |
| 44.56002 | -0.165 |
| 44.57002 | -0.155 |
| 44.58002 | -0.114 |
| 44.59002 | -0.053 |
| 44.60003 | 0.011 |
| 44.61002 | 0.066 |
| 44.62003 | 0.102 |
| 44.63002 | 0.118 |
| 44.64002 | 0.119 |
| 44.65002 | 0.118 |
| 44.66002 | 0.128 |
| 44.67002 | 0.158 |
| 44.68002 | 0.212 |
| 44.69003 | 0.284 |
| 44.70002 | 0.36 |
| 44.71003 | 0.418 |
| 44.72002 | 0.44 |
| 44.73002 | 0.41 |
| 44.74002 | 0.326 |
| 44.75002 | 0.195 |
| 44.76003 | 0.04 |
| 44.77002 | -0.11 |
| 44.78003 | -0.225 |
| 44.79002 | -0.283 |
| 44.80003 | -0.275 |
| 44.81002 | -0.209 |
| 44.82002 | -0.104 |
| 44.83002 | 0.013 |
| 44.84002 | 0.116 |
| 44.85003 | 0.19 |
| 44.86002 | 0.23 |
| 44.87003 | 0.246 |
| 44.88002 | 0.252 |
| 44.89002 | 0.264 |
| 44.90002 | 0.288 |
| 44.91002 | 0.323 |
| 44.92002 | 0.358 |
| 44.93002 | 0.38 |
| 44.94003 | 0.38 |
| 44.95002 | 0.355 |
| 44.96003 | 0.315 |
| 44.97002 | 0.272 |
| 44.98002 | 0.239 |
| 44.99002 | 0.222 |
| 45.00002 | 0.218 |
| 45.01003 | 0.214 |
| 45.02002 | 0.193 |
| 45.03003 | 0.145 |
| 45.04002 | 0.067 |
| 45.05003 | -0.032 |
| 45.06002 | -0.131 |
| 45.07002 | -0.209 |
| 45.08002 | -0.249 |
| 45.09002 | -0.244 |
| 45.10003 | -0.201 |
| 45.11002 | -0.136 |
| 45.12003 | -0.069 |
| 45.13002 | -0.016 |
| 45.14003 | 0.015 |
| 45.15002 | 0.027 |
| 45.16002 | 0.027 |
| 45.17002 | 0.028 |
| 45.18002 | 0.038 |
| 45.19003 | 0.059 |
| 45.20002 | 0.09 |
| 45.21003 | 0.127 |
| 45.22002 | 0.166 |
| 45.23002 | 0.207 |
| 45.24002 | 0.253 |
| 45.25002 | 0.307 |
| 45.26003 | 0.371 |
| 45.27002 | 0.442 |
| 45.28003 | 0.511 |
| 45.29002 | 0.568 |
| 45.30003 | 0.602 |
| 45.31002 | 0.606 |
| 45.32002 | 0.581 |
| 45.33002 | 0.535 |
| 45.34002 | 0.479 |
| 45.35003 | 0.424 |
| 45.36002 | 0.377 |
| 45.37003 | 0.339 |
| 45.38002 | 0.308 |
| 45.39003 | 0.278 |
| 45.40002 | 0.246 |
| 45.41002 | 0.213 |
| 45.42002 | 0.182 |
| 45.43002 | 0.16 |
| 45.44003 | 0.152 |
| 45.45002 | 0.16 |
| 45.46003 | 0.18 |
| 45.47002 | 0.202 |
| 45.48003 | 0.216 |
| 45.49002 | 0.214 |
| 45.50002 | 0.196 |
| 45.51003 | 0.166 |
| 45.52002 | 0.136 |
| 45.53003 | 0.119 |
| 45.54002 | 0.127 |
| 45.55003 | 0.165 |
| 45.56002 | 0.231 |
| 45.57002 | 0.315 |
| 45.58002 | 0.402 |
| 45.59002 | 0.48 |
| 45.60003 | 0.536 |
| 45.61002 | 0.563 |
| 45.62003 | 0.56 |
| 45.63002 | 0.533 |
| 45.64003 | 0.489 |
| 45.65002 | 0.44 |
| 45.66002 | 0.398 |
| 45.67002 | 0.372 |
| 45.68002 | 0.373 |
| 45.69003 | 0.402 |
| 45.70002 | 0.459 |
| 45.71003 | 0.532 |
| 45.72002 | 0.608 |
| 45.73003 | 0.666 |
| 45.74002 | 0.691 |
| 45.75002 | 0.67 |
| 45.76003 | 0.603 |
| 45.77002 | 0.498 |
| 45.78003 | 0.374 |
| 45.79002 | 0.257 |
| 45.80003 | 0.168 |
| 45.81002 | 0.124 |
| 45.82003 | 0.127 |
| 45.83002 | 0.169 |
| 45.84002 | 0.232 |
| 45.85003 | 0.295 |
| 45.86002 | 0.336 |
| 45.87003 | 0.346 |
| 45.88002 | 0.324 |
| 45.89003 | 0.281 |
| 45.90002 | 0.233 |
| 45.91002 | 0.197 |
| 45.92002 | 0.188 |
| 45.93002 | 0.209 |
| 45.94003 | 0.253 |
| 45.95002 | 0.308 |
| 45.96003 | 0.355 |
| 45.97002 | 0.379 |
| 45.98003 | 0.372 |
| 45.99002 | 0.332 |
| 46.00002 | 0.27 |
| 46.01003 | 0.199 |
| 46.02002 | 0.136 |
| 46.03003 | 0.093 |
| 46.04002 | 0.076 |
| 46.05003 | 0.085 |
| 46.06002 | 0.112 |
| 46.07003 | 0.146 |
| 46.08002 | 0.179 |
| 46.09002 | 0.203 |
| 46.10003 | 0.215 |
| 46.11002 | 0.216 |
| 46.12003 | 0.21 |
| 46.13002 | 0.202 |
| 46.14003 | 0.194 |
| 46.15002 | 0.19 |
| 46.16003 | 0.192 |
| 46.17002 | 0.202 |
| 46.18002 | 0.222 |
| 46.19003 | 0.252 |
| 46.20002 | 0.293 |
| 46.21003 | 0.344 |
| 46.22002 | 0.402 |
| 46.23003 | 0.46 |
| 46.24002 | 0.511 |
| 46.25003 | 0.55 |
| 46.26003 | 0.569 |
| 46.27002 | 0.567 |
| 46.28003 | 0.545 |
| 46.29002 | 0.508 |
| 46.30003 | 0.464 |
| 46.31002 | 0.42 |
| 46.32003 | 0.387 |
| 46.33002 | 0.373 |
| 46.34002 | 0.383 |
| 46.35003 | 0.418 |
| 46.36002 | 0.475 |
| 46.37003 | 0.545 |
| 46.38002 | 0.618 |
| 46.39003 | 0.679 |
| 46.40002 | 0.717 |
| 46.41003 | 0.724 |
| 46.42002 | 0.697 |
| 46.43002 | 0.641 |
| 46.44003 | 0.564 |
| 46.45002 | 0.479 |
| 46.46003 | 0.398 |
| 46.47002 | 0.33 |
| 46.48003 | 0.278 |
| 46.49002 | 0.243 |
| 46.50003 | 0.222 |
| 46.51003 | 0.211 |
| 46.52002 | 0.205 |
| 46.53003 | 0.204 |
| 46.54002 | 0.206 |
| 46.55003 | 0.21 |
| 46.56002 | 0.216 |
| 46.57003 | 0.223 |
| 46.58002 | 0.228 |
| 46.59003 | 0.229 |
| 46.60003 | 0.226 |
| 46.61002 | 0.219 |
| 46.62003 | 0.212 |
| 46.63002 | 0.207 |
| 46.64003 | 0.206 |
| 46.65002 | 0.209 |
| 46.66003 | 0.214 |
| 46.67002 | 0.217 |
| 46.68002 | 0.215 |
| 46.69003 | 0.207 |
| 46.70002 | 0.195 |
| 46.71003 | 0.183 |
| 46.72002 | 0.177 |
| 46.73003 | 0.182 |
| 46.74002 | 0.198 |
| 46.75003 | 0.225 |
| 46.76003 | 0.255 |
| 46.77002 | 0.282 |
| 46.78003 | 0.298 |
| 46.79002 | 0.301 |
| 46.80003 | 0.29 |
| 46.81002 | 0.27 |
| 46.82003 | 0.246 |
| 46.83002 | 0.222 |
| 46.84003 | 0.202 |
| 46.85003 | 0.186 |
| 46.86002 | 0.17 |
| 46.87003 | 0.152 |
| 46.88002 | 0.13 |
| 46.89003 | 0.104 |
| 46.90002 | 0.079 |
| 46.91003 | 0.059 |
| 46.92002 | 0.05 |
| 46.93003 | 0.056 |
| 46.94003 | 0.078 |
| 46.95002 | 0.116 |
| 46.96003 | 0.164 |
| 46.97002 | 0.214 |
| 46.98003 | 0.257 |
| 46.99002 | 0.285 |
| 47.00003 | 0.29 |
| 47.01003 | 0.268 |
| 47.02002 | 0.22 |
| 47.03003 | 0.15 |
| 47.04002 | 0.067 |
| 47.05003 | -0.014 |
| 47.06002 | -0.079 |
| 47.07003 | -0.116 |
| 47.08002 | -0.116 |
| 47.09003 | -0.077 |
| 47.10003 | -0.005 |
| 47.11002 | 0.086 |
| 47.12003 | 0.18 |
| 47.13002 | 0.259 |
| 47.14003 | 0.31 |
| 47.15002 | 0.327 |
| 47.16003 | 0.309 |
| 47.17002 | 0.267 |
| 47.18003 | 0.213 |
| 47.19003 | 0.163 |
| 47.20002 | 0.129 |
| 47.21003 | 0.12 |
| 47.22002 | 0.137 |
| 47.23003 | 0.174 |
| 47.24002 | 0.22 |
| 47.25003 | 0.264 |
| 47.26003 | 0.296 |
| 47.27003 | 0.311 |
| 47.28003 | 0.311 |
| 47.29002 | 0.301 |
| 47.30003 | 0.292 |
| 47.31002 | 0.292 |
| 47.32003 | 0.307 |
| 47.33002 | 0.336 |
| 47.34003 | 0.375 |
| 47.35003 | 0.413 |
| 47.36002 | 0.442 |
| 47.37003 | 0.457 |
| 47.38002 | 0.458 |
| 47.39003 | 0.449 |
| 47.40002 | 0.439 |
| 47.41003 | 0.437 |
| 47.42002 | 0.445 |
| 47.43003 | 0.464 |
| 47.44003 | 0.487 |
| 47.45002 | 0.506 |
| 47.46003 | 0.512 |
| 47.47002 | 0.501 |
| 47.48003 | 0.471 |
| 47.49002 | 0.427 |
| 47.50003 | 0.377 |
| 47.51003 | 0.328 |
| 47.52003 | 0.286 |
| 47.53003 | 0.252 |
| 47.54002 | 0.226 |
| 47.55003 | 0.204 |
| 47.56002 | 0.185 |
| 47.57003 | 0.165 |
| 47.58002 | 0.147 |
| 47.59003 | 0.13 |
| 47.60003 | 0.119 |
| 47.61003 | 0.113 |
| 47.62003 | 0.112 |
| 47.63002 | 0.114 |
| 47.64003 | 0.114 |
| 47.65002 | 0.11 |
| 47.66003 | 0.097 |
| 47.67002 | 0.077 |
| 47.68003 | 0.048 |
| 47.69003 | 0.016 |
| 47.70003 | -0.016 |
| 47.71003 | -0.043 |
| 47.72002 | -0.061 |
| 47.73003 | -0.065 |
| 47.74002 | -0.053 |
| 47.75003 | -0.026 |
| 47.76003 | 0.015 |
| 47.77003 | 0.068 |
| 47.78003 | 0.127 |
| 47.79002 | 0.187 |
| 47.80003 | 0.242 |
| 47.81002 | 0.288 |
| 47.82003 | 0.321 |
| 47.83002 | 0.338 |
| 47.84003 | 0.339 |
| 47.85003 | 0.326 |
| 47.86003 | 0.302 |
| 47.87003 | 0.272 |
| 47.88002 | 0.241 |
| 47.89003 | 0.213 |
| 47.90002 | 0.192 |
| 47.91003 | 0.18 |
| 47.92002 | 0.177 |
| 47.93003 | 0.181 |
| 47.94003 | 0.189 |
| 47.95003 | 0.198 |
| 47.96003 | 0.206 |
| 47.97002 | 0.209 |
| 47.98003 | 0.208 |
| 47.99002 | 0.203 |
| 48.00003 | 0.195 |
| 48.01003 | 0.186 |
| 48.02003 | 0.178 |
| 48.03003 | 0.171 |
| 48.04003 | 0.168 |
| 48.05003 | 0.168 |
| 48.06002 | 0.171 |
| 48.07003 | 0.176 |
| 48.08002 | 0.182 |
| 48.09003 | 0.188 |
| 48.10003 | 0.191 |
| 48.11003 | 0.192 |
| 48.12003 | 0.193 |
| 48.13002 | 0.196 |
| 48.14003 | 0.203 |
| 48.15002 | 0.219 |
| 48.16003 | 0.243 |
| 48.17002 | 0.273 |
| 48.18003 | 0.306 |
| 48.19003 | 0.336 |
| 48.20003 | 0.356 |
| 48.21003 | 0.364 |
| 48.22002 | 0.359 |
| 48.23003 | 0.343 |
| 48.24002 | 0.323 |
| 48.25003 | 0.304 |
| 48.26003 | 0.293 |
| 48.27003 | 0.29 |
| 48.28003 | 0.295 |
| 48.29003 | 0.303 |
| 48.30003 | 0.31 |
| 48.31002 | 0.313 |
| 48.32003 | 0.312 |
| 48.33002 | 0.31 |
| 48.34003 | 0.312 |
| 48.35003 | 0.324 |
| 48.36003 | 0.349 |
| 48.37003 | 0.386 |
| 48.38003 | 0.427 |
| 48.39003 | 0.465 |
| 48.40002 | 0.489 |
| 48.41003 | 0.492 |
| 48.42002 | 0.471 |
| 48.43003 | 0.431 |
| 48.44003 | 0.378 |
| 48.45003 | 0.325 |
| 48.46003 | 0.282 |
| 48.47002 | 0.257 |
| 48.48003 | 0.251 |
| 48.49002 | 0.263 |
| 48.50003 | 0.284 |
| 48.51003 | 0.305 |
| 48.52003 | 0.318 |
| 48.53003 | 0.319 |
| 48.54003 | 0.309 |
| 48.55003 | 0.292 |
| 48.56002 | 0.276 |
| 48.57003 | 0.268 |
| 48.58002 | 0.273 |
| 48.59003 | 0.29 |
| 48.60003 | 0.312 |
| 48.61003 | 0.33 |
| 48.62003 | 0.334 |
| 48.63003 | 0.318 |
| 48.64003 | 0.279 |
| 48.65002 | 0.224 |
| 48.66003 | 0.164 |
| 48.67002 | 0.11 |
| 48.68003 | 0.075 |
| 48.69003 | 0.062 |
| 48.70003 | 0.072 |
| 48.71003 | 0.097 |
| 48.72003 | 0.126 |
| 48.73003 | 0.15 |
| 48.74002 | 0.163 |
| 48.75003 | 0.163 |
| 48.76003 | 0.153 |
| 48.77003 | 0.14 |
| 48.78003 | 0.13 |
| 48.79003 | 0.128 |
| 48.80003 | 0.135 |
| 48.81003 | 0.149 |
| 48.82003 | 0.168 |
| 48.83002 | 0.189 |
| 48.84003 | 0.212 |
| 48.85003 | 0.239 |
| 48.86003 | 0.271 |
| 48.87003 | 0.31 |
| 48.88003 | 0.352 |
| 48.89003 | 0.395 |
| 48.90002 | 0.432 |
| 48.91003 | 0.458 |
| 48.92002 | 0.469 |
| 48.93003 | 0.466 |
| 48.94003 | 0.45 |
| 48.95003 | 0.427 |
| 48.96003 | 0.403 |
| 48.97003 | 0.382 |
| 48.98003 | 0.367 |
| 48.99002 | 0.358 |
| 49.00003 | 0.356 |
| 49.01003 | 0.359 |
| 49.02003 | 0.366 |
| 49.03003 | 0.374 |
| 49.04003 | 0.382 |
| 49.05003 | 0.385 |
| 49.06003 | 0.38 |
| 49.07003 | 0.364 |
| 49.08002 | 0.334 |
| 49.09003 | 0.291 |
| 49.10003 | 0.24 |
| 49.11003 | 0.188 |
| 49.12003 | 0.143 |
| 49.13003 | 0.113 |
| 49.14003 | 0.103 |
| 49.15003 | 0.113 |
| 49.16003 | 0.14 |
| 49.17002 | 0.178 |
| 49.18003 | 0.22 |
| 49.19003 | 0.258 |
| 49.20003 | 0.289 |
| 49.21003 | 0.31 |
| 49.22003 | 0.322 |
| 49.23003 | 0.326 |
| 49.24002 | 0.327 |
| 49.25003 | 0.326 |
| 49.26003 | 0.325 |
| 49.27003 | 0.327 |
| 49.28003 | 0.331 |
| 49.29003 | 0.338 |
| 49.30003 | 0.351 |
| 49.31003 | 0.367 |
| 49.32003 | 0.386 |
| 49.33002 | 0.404 |
| 49.34003 | 0.418 |
| 49.35003 | 0.424 |
| 49.36003 | 0.418 |
| 49.37003 | 0.4 |
| 49.38003 | 0.37 |
| 49.39003 | 0.335 |
| 49.40003 | 0.297 |
| 49.41003 | 0.264 |
| 49.42002 | 0.236 |
| 49.43003 | 0.217 |
| 49.44003 | 0.205 |
| 49.45003 | 0.196 |
| 49.46003 | 0.188 |
| 49.47003 | 0.18 |
| 49.48003 | 0.171 |
| 49.49003 | 0.162 |
| 49.50003 | 0.155 |
| 49.51003 | 0.151 |
| 49.52003 | 0.149 |
| 49.53003 | 0.148 |
| 49.54003 | 0.145 |
| 49.55003 | 0.137 |
| 49.56003 | 0.125 |
| 49.57003 | 0.109 |
| 49.58002 | 0.095 |
| 49.59003 | 0.087 |
| 49.60003 | 0.091 |
| 49.61003 | 0.108 |
| 49.62003 | 0.138 |
| 49.63003 | 0.175 |
| 49.64003 | 0.214 |
| 49.65003 | 0.245 |
| 49.66003 | 0.263 |
| 49.67002 | 0.265 |
| 49.68003 | 0.254 |
| 49.69003 | 0.233 |
| 49.70003 | 0.211 |
| 49.71003 | 0.195 |
| 49.72003 | 0.189 |
| 49.73003 | 0.196 |
| 49.74003 | 0.211 |
| 49.75003 | 0.232 |
| 49.76003 | 0.251 |
| 49.77003 | 0.263 |
| 49.78003 | 0.268 |
| 49.79003 | 0.266 |
| 49.80003 | 0.262 |
| 49.81003 | 0.264 |
| 49.82003 | 0.277 |
| 49.83003 | 0.303 |
| 49.84003 | 0.341 |
| 49.85003 | 0.384 |
| 49.86003 | 0.426 |
| 49.87003 | 0.455 |
| 49.88003 | 0.466 |
| 49.89003 | 0.455 |
| 49.90003 | 0.426 |
| 49.91003 | 0.384 |
| 49.92003 | 0.34 |
| 49.93003 | 0.305 |
| 49.94003 | 0.286 |
| 49.95003 | 0.288 |
| 49.96003 | 0.309 |
| 49.97003 | 0.344 |
| 49.98003 | 0.385 |
| 49.99003 | 0.421 |
| 50.00003 | 0.445 |
| 50.01003 | 0.449 |
| 50.02003 | 0.433 |
| 50.03003 | 0.398 |
| 50.04003 | 0.349 |
| 50.05003 | 0.293 |
| 50.06003 | 0.238 |
| 50.07003 | 0.192 |
| 50.08003 | 0.157 |
| 50.09003 | 0.138 |
| 50.10003 | 0.133 |
| 50.11003 | 0.14 |
| 50.12003 | 0.158 |
| 50.13003 | 0.18 |
| 50.14003 | 0.202 |
| 50.15003 | 0.22 |
| 50.16003 | 0.228 |
| 50.17003 | 0.223 |
| 50.18003 | 0.204 |
| 50.19003 | 0.172 |
| 50.20003 | 0.129 |
| 50.21003 | 0.082 |
| 50.22003 | 0.039 |
| 50.23003 | 0.004 |
| 50.24003 | -0.017 |
| 50.25003 | -0.022 |
| 50.26003 | -0.013 |
| 50.27003 | 0.007 |
| 50.28003 | 0.032 |
| 50.29003 | 0.058 |
| 50.30003 | 0.081 |
| 50.31003 | 0.1 |
| 50.32003 | 0.114 |
| 50.33003 | 0.123 |
| 50.34003 | 0.13 |
| 50.35003 | 0.136 |
| 50.36003 | 0.142 |
| 50.37003 | 0.147 |
| 50.38003 | 0.154 |
| 50.39003 | 0.162 |
| 50.40003 | 0.173 |
| 50.41003 | 0.184 |
| 50.42003 | 0.196 |
| 50.43003 | 0.204 |
| 50.44003 | 0.207 |
| 50.45003 | 0.203 |
| 50.46003 | 0.191 |
| 50.47003 | 0.174 |
| 50.48003 | 0.155 |
| 50.49003 | 0.139 |
| 50.50003 | 0.132 |
| 50.51003 | 0.136 |
| 50.52003 | 0.151 |
| 50.53003 | 0.174 |
| 50.54003 | 0.199 |
| 50.55003 | 0.221 |
| 50.56003 | 0.237 |
| 50.57003 | 0.244 |
| 50.58003 | 0.244 |
| 50.59003 | 0.239 |
| 50.60003 | 0.235 |
| 50.61003 | 0.233 |
| 50.62003 | 0.235 |
| 50.63003 | 0.24 |
| 50.64003 | 0.245 |
| 50.65003 | 0.249 |
| 50.66003 | 0.251 |
| 50.67003 | 0.251 |
| 50.68003 | 0.252 |
| 50.69003 | 0.257 |
| 50.70003 | 0.27 |
| 50.71003 | 0.292 |
| 50.72003 | 0.319 |
| 50.73003 | 0.347 |
| 50.74003 | 0.369 |
| 50.75003 | 0.378 |
| 50.76003 | 0.37 |
| 50.77003 | 0.344 |
| 50.78003 | 0.303 |
| 50.79003 | 0.253 |
| 50.80003 | 0.201 |
| 50.81003 | 0.158 |
| 50.82003 | 0.129 |
| 50.83003 | 0.119 |
| 50.84003 | 0.131 |
| 50.85003 | 0.164 |
| 50.86003 | 0.212 |
| 50.87003 | 0.272 |
| 50.88003 | 0.337 |
| 50.89003 | 0.399 |
| 50.90003 | 0.452 |
| 50.91003 | 0.49 |
| 50.92003 | 0.511 |
| 50.93003 | 0.512 |
| 50.94003 | 0.496 |
| 50.95003 | 0.467 |
| 50.96003 | 0.431 |
| 50.97003 | 0.395 |
| 50.98003 | 0.365 |
| 50.99003 | 0.347 |
| 51.00003 | 0.34 |
| 51.01003 | 0.345 |
| 51.02003 | 0.357 |
| 51.03003 | 0.368 |
| 51.04003 | 0.374 |
| 51.05003 | 0.369 |
| 51.06003 | 0.352 |
| 51.07003 | 0.326 |
| 51.08003 | 0.296 |
| 51.09003 | 0.27 |
| 51.10003 | 0.255 |
| 51.11003 | 0.258 |
| 51.12003 | 0.28 |
| 51.13003 | 0.316 |
| 51.14003 | 0.358 |
| 51.15003 | 0.396 |
| 51.16003 | 0.422 |
| 51.17003 | 0.428 |
| 51.18003 | 0.414 |
| 51.19003 | 0.385 |
| 51.20003 | 0.347 |
| 51.21003 | 0.309 |
| 51.22003 | 0.278 |
| 51.23003 | 0.257 |
| 51.24003 | 0.243 |
| 51.25003 | 0.231 |
| 51.26003 | 0.216 |
| 51.27003 | 0.193 |
| 51.28003 | 0.162 |
| 51.29003 | 0.127 |
| 51.30003 | 0.094 |
| 51.31003 | 0.07 |
| 51.32003 | 0.063 |
| 51.33003 | 0.073 |
| 51.34003 | 0.099 |
| 51.35003 | 0.136 |
| 51.36003 | 0.178 |
| 51.37003 | 0.22 |
| 51.38003 | 0.256 |
| 51.39003 | 0.285 |
| 51.40003 | 0.309 |
| 51.41003 | 0.328 |
| 51.42003 | 0.344 |
| 51.43003 | 0.356 |
| 51.44003 | 0.365 |
| 51.45003 | 0.368 |
| 51.46003 | 0.364 |
| 51.47003 | 0.356 |
| 51.48003 | 0.347 |
| 51.49003 | 0.341 |
| 51.50003 | 0.342 |
| 51.51003 | 0.355 |
| 51.52003 | 0.38 |
| 51.53003 | 0.413 |
| 51.54003 | 0.45 |
| 51.55003 | 0.484 |
| 51.56003 | 0.508 |
| 51.57003 | 0.517 |
| 51.58003 | 0.51 |
| 51.59003 | 0.488 |
| 51.60003 | 0.453 |
| 51.61003 | 0.409 |
| 51.62003 | 0.36 |
| 51.63003 | 0.311 |
| 51.64003 | 0.264 |
| 51.65003 | 0.222 |
| 51.66003 | 0.187 |
| 51.67003 | 0.162 |
| 51.68003 | 0.147 |
| 51.69003 | 0.144 |
| 51.70003 | 0.152 |
| 51.71003 | 0.167 |
| 51.72003 | 0.188 |
| 51.73003 | 0.209 |
| 51.74003 | 0.228 |
| 51.75003 | 0.244 |
| 51.76003 | 0.256 |
| 51.77003 | 0.267 |
| 51.78003 | 0.277 |
| 51.79003 | 0.287 |
| 51.80003 | 0.297 |
| 51.81003 | 0.306 |
| 51.82003 | 0.312 |
| 51.83003 | 0.314 |
| 51.84003 | 0.312 |
| 51.85003 | 0.307 |
| 51.86003 | 0.301 |
| 51.87003 | 0.297 |
| 51.88003 | 0.298 |
| 51.89003 | 0.302 |
| 51.90003 | 0.31 |
| 51.91003 | 0.317 |
| 51.92003 | 0.321 |
| 51.93003 | 0.318 |
| 51.94003 | 0.308 |
| 51.95003 | 0.292 |
| 51.96003 | 0.272 |
| 51.97003 | 0.25 |
| 51.98003 | 0.23 |
| 51.99003 | 0.214 |
| 52.00003 | 0.201 |
| 52.01003 | 0.192 |
| 52.02003 | 0.183 |
| 52.03003 | 0.175 |
| 52.04003 | 0.165 |
| 52.05003 | 0.154 |
| 52.06003 | 0.143 |
| 52.07003 | 0.133 |
| 52.08003 | 0.125 |
| 52.09003 | 0.123 |
| 52.10003 | 0.128 |
| 52.11003 | 0.142 |
| 52.12003 | 0.166 |
| 52.13003 | 0.197 |
| 52.14003 | 0.232 |
| 52.15003 | 0.267 |
| 52.16003 | 0.295 |
| 52.17003 | 0.311 |
| 52.18003 | 0.31 |
| 52.19003 | 0.291 |
| 52.20003 | 0.257 |
| 52.21003 | 0.215 |
| 52.22003 | 0.172 |
| 52.23003 | 0.137 |
| 52.24003 | 0.117 |
| 52.25003 | 0.114 |
| 52.26003 | 0.128 |
| 52.27003 | 0.154 |
| 52.28003 | 0.182 |
| 52.29003 | 0.206 |
| 52.30003 | 0.22 |
| 52.31003 | 0.221 |
| 52.32003 | 0.21 |
| 52.33003 | 0.193 |
| 52.34003 | 0.174 |
| 52.35003 | 0.16 |
| 52.36003 | 0.155 |
| 52.37003 | 0.159 |
| 52.38003 | 0.17 |
| 52.39003 | 0.185 |
| 52.40003 | 0.198 |
| 52.41003 | 0.206 |
| 52.42003 | 0.206 |
| 52.43003 | 0.198 |
| 52.44003 | 0.186 |
| 52.45003 | 0.173 |
| 52.46003 | 0.164 |
| 52.47003 | 0.162 |
| 52.48003 | 0.167 |
| 52.49003 | 0.181 |
| 52.50003 | 0.2 |
| 52.51003 | 0.221 |
| 52.52003 | 0.24 |
| 52.53003 | 0.254 |
| 52.54003 | 0.262 |
| 52.55003 | 0.262 |
| 52.56003 | 0.258 |
| 52.57003 | 0.25 |
| 52.58003 | 0.243 |
| 52.59003 | 0.239 |
| 52.60003 | 0.238 |
| 52.61003 | 0.242 |
| 52.62003 | 0.25 |
| 52.63003 | 0.259 |
| 52.64003 | 0.269 |
| 52.65003 | 0.277 |
| 52.66003 | 0.282 |
| 52.67003 | 0.281 |
| 52.68003 | 0.274 |
| 52.69003 | 0.261 |
| 52.70003 | 0.242 |
| 52.71003 | 0.218 |
| 52.72003 | 0.19 |
| 52.73003 | 0.162 |
| 52.74003 | 0.136 |
| 52.75003 | 0.116 |
| 52.76003 | 0.104 |
| 52.77003 | 0.101 |
| 52.78003 | 0.107 |
| 52.79003 | 0.122 |
| 52.80003 | 0.142 |
| 52.81003 | 0.164 |
| 52.82003 | 0.184 |
| 52.83003 | 0.197 |
| 52.84003 | 0.202 |
| 52.85003 | 0.198 |
| 52.86003 | 0.187 |
| 52.87003 | 0.172 |
| 52.88003 | 0.157 |
| 52.89003 | 0.146 |
| 52.90003 | 0.142 |
| 52.91003 | 0.149 |
| 52.92003 | 0.166 |
| 52.93003 | 0.19 |
| 52.94003 | 0.22 |
| 52.95003 | 0.252 |
| 52.96003 | 0.282 |
| 52.97003 | 0.307 |
| 52.98003 | 0.326 |
| 52.99003 | 0.338 |
| 53.00003 | 0.342 |
| 53.01003 | 0.34 |
| 53.02003 | 0.331 |
| 53.03003 | 0.32 |
| 53.04003 | 0.307 |
| 53.05003 | 0.295 |
| 53.06003 | 0.286 |
| 53.07003 | 0.28 |
| 53.08003 | 0.277 |
| 53.09003 | 0.275 |
| 53.10003 | 0.273 |
| 53.11003 | 0.267 |
| 53.12003 | 0.258 |
| 53.13003 | 0.244 |
| 53.14003 | 0.228 |
| 53.15003 | 0.211 |
| 53.16003 | 0.196 |
| 53.17003 | 0.186 |
| 53.18003 | 0.181 |
| 53.19003 | 0.183 |
| 53.20003 | 0.191 |
| 53.21003 | 0.202 |
| 53.22003 | 0.216 |
| 53.23003 | 0.232 |
| 53.24003 | 0.247 |
| 53.25003 | 0.262 |
| 53.26003 | 0.277 |
| 53.27003 | 0.29 |
| 53.28003 | 0.302 |
| 53.29003 | 0.311 |
| 53.30003 | 0.316 |
| 53.31003 | 0.318 |
| 53.32003 | 0.315 |
| 53.33003 | 0.309 |
| 53.34003 | 0.303 |
| 53.35003 | 0.3 |
| 53.36003 | 0.303 |
| 53.37003 | 0.312 |
| 53.38003 | 0.328 |
| 53.39003 | 0.348 |
| 53.40003 | 0.37 |
| 53.41003 | 0.389 |
| 53.42003 | 0.4 |
| 53.43003 | 0.401 |
| 53.44003 | 0.391 |
| 53.45003 | 0.371 |
| 53.46003 | 0.342 |
| 53.47003 | 0.31 |
| 53.48003 | 0.277 |
| 53.49003 | 0.248 |
| 53.50003 | 0.228 |
| 53.51003 | 0.218 |
| 53.52003 | 0.218 |
| 53.53003 | 0.23 |
| 53.54003 | 0.248 |
| 53.55003 | 0.271 |
| 53.56003 | 0.294 |
| 53.57003 | 0.311 |
| 53.58003 | 0.321 |
| 53.59003 | 0.321 |
| 53.60003 | 0.312 |
| 53.61003 | 0.296 |
| 53.62003 | 0.278 |
| 53.63003 | 0.26 |
| 53.64003 | 0.244 |
| 53.65003 | 0.232 |
| 53.66003 | 0.223 |
| 53.67003 | 0.214 |
| 53.68003 | 0.205 |
| 53.69003 | 0.194 |
| 53.70003 | 0.182 |
| 53.71003 | 0.17 |
| 53.72003 | 0.163 |
| 53.73003 | 0.161 |
| 53.74003 | 0.166 |
| 53.75003 | 0.177 |
| 53.76003 | 0.192 |
| 53.77003 | 0.207 |
| 53.78003 | 0.218 |
| 53.79003 | 0.223 |
| 53.80003 | 0.218 |
| 53.81003 | 0.207 |
| 53.82003 | 0.19 |
| 53.83003 | 0.174 |
| 53.84003 | 0.163 |
| 53.85003 | 0.161 |
| 53.86003 | 0.17 |
| 53.87003 | 0.19 |
| 53.88003 | 0.218 |
| 53.89003 | 0.249 |
| 53.90003 | 0.277 |
| 53.91003 | 0.298 |
| 53.92003 | 0.308 |
| 53.93003 | 0.306 |
| 53.94003 | 0.294 |
| 53.95003 | 0.275 |
| 53.96003 | 0.254 |
| 53.97003 | 0.235 |
| 53.98003 | 0.222 |
| 53.99003 | 0.216 |
| 54.00003 | 0.219 |
| 54.01003 | 0.23 |
| 54.02003 | 0.249 |
| 54.03003 | 0.275 |
| 54.04003 | 0.306 |
| 54.05003 | 0.339 |
| 54.06003 | 0.372 |
| 54.07003 | 0.402 |
| 54.08003 | 0.424 |
| 54.09003 | 0.438 |
| 54.10003 | 0.44 |
| 54.11003 | 0.432 |
| 54.12003 | 0.415 |
| 54.13003 | 0.394 |
| 54.14003 | 0.371 |
| 54.15003 | 0.352 |
| 54.16003 | 0.336 |
| 54.17003 | 0.327 |
| 54.18003 | 0.322 |
| 54.19003 | 0.319 |
| 54.20003 | 0.317 |
| 54.21003 | 0.313 |
| 54.22003 | 0.308 |
| 54.23003 | 0.3 |
| 54.24003 | 0.29 |
| 54.25003 | 0.281 |
| 54.26003 | 0.273 |
| 54.27003 | 0.266 |
| 54.28003 | 0.262 |
| 54.29003 | 0.259 |
| 54.30003 | 0.258 |
| 54.31003 | 0.258 |
| 54.32003 | 0.26 |
| 54.33003 | 0.263 |
| 54.34003 | 0.267 |
| 54.35003 | 0.27 |
| 54.36003 | 0.273 |
| 54.37003 | 0.274 |
| 54.38003 | 0.273 |
| 54.39003 | 0.27 |
| 54.40003 | 0.266 |
| 54.41003 | 0.264 |
| 54.42003 | 0.263 |
| 54.43003 | 0.264 |
| 54.44003 | 0.27 |
| 54.45003 | 0.279 |
| 54.46003 | 0.291 |
| 54.47003 | 0.305 |
| 54.48003 | 0.319 |
| 54.49003 | 0.332 |
| 54.50003 | 0.341 |
| 54.51003 | 0.346 |
| 54.52003 | 0.345 |
| 54.53003 | 0.336 |
| 54.54003 | 0.321 |
| 54.55003 | 0.299 |
| 54.56003 | 0.274 |
| 54.57003 | 0.25 |
| 54.58003 | 0.23 |
| 54.59003 | 0.218 |
| 54.60003 | 0.216 |
| 54.61003 | 0.226 |
| 54.62003 | 0.243 |
| 54.63003 | 0.266 |
| 54.64003 | 0.288 |
| 54.65003 | 0.305 |
| 54.66003 | 0.313 |
| 54.67003 | 0.31 |
| 54.68003 | 0.296 |
| 54.69003 | 0.272 |
| 54.70003 | 0.243 |
| 54.71003 | 0.211 |
| 54.72003 | 0.181 |
| 54.73003 | 0.154 |
| 54.74003 | 0.134 |
| 54.75003 | 0.12 |
| 54.76003 | 0.114 |
| 54.77003 | 0.116 |
| 54.78003 | 0.125 |
| 54.79003 | 0.14 |
| 54.80003 | 0.16 |
| 54.81003 | 0.184 |
| 54.82003 | 0.207 |
| 54.83003 | 0.227 |
| 54.84003 | 0.241 |
| 54.85003 | 0.247 |
| 54.86003 | 0.244 |
| 54.87003 | 0.234 |
| 54.88003 | 0.217 |
| 54.89003 | 0.2 |
| 54.90003 | 0.185 |
| 54.91003 | 0.176 |
| 54.92003 | 0.174 |
| 54.93003 | 0.178 |
| 54.94003 | 0.186 |
| 54.95003 | 0.193 |
| 54.96003 | 0.198 |
| 54.97003 | 0.198 |
| 54.98003 | 0.196 |
| 54.99003 | 0.194 |
| 55.00003 | 0.196 |
| 55.01003 | 0.204 |
| 55.02003 | 0.221 |
| 55.03003 | 0.245 |
| 55.04003 | 0.272 |
| 55.05003 | 0.298 |
| 55.06003 | 0.319 |
| 55.07003 | 0.332 |
| 55.08003 | 0.337 |
| 55.09003 | 0.336 |
| 55.10003 | 0.335 |
| 55.11003 | 0.336 |
| 55.12003 | 0.344 |
| 55.13003 | 0.358 |
| 55.14003 | 0.377 |
| 55.15003 | 0.397 |
| 55.16003 | 0.412 |
| 55.17003 | 0.418 |
| 55.18003 | 0.412 |
| 55.19003 | 0.392 |
| 55.20003 | 0.363 |
| 55.21003 | 0.326 |
| 55.22003 | 0.289 |
| 55.23003 | 0.255 |
| 55.24003 | 0.229 |
| 55.25003 | 0.213 |
| 55.26003 | 0.207 |
| 55.27003 | 0.21 |
| 55.28003 | 0.219 |
| 55.29003 | 0.23 |
| 55.30003 | 0.24 |
| 55.31003 | 0.247 |
| 55.32003 | 0.248 |
| 55.33003 | 0.244 |
| 55.34003 | 0.234 |
| 55.35003 | 0.22 |
| 55.36003 | 0.203 |
| 55.37003 | 0.183 |
| 55.38003 | 0.162 |
| 55.39003 | 0.143 |
| 55.40003 | 0.126 |
| 55.41003 | 0.114 |
| 55.42003 | 0.11 |
| 55.43003 | 0.114 |
| 55.44003 | 0.127 |
| 55.45003 | 0.149 |
| 55.46003 | 0.177 |
| 55.47003 | 0.208 |
| 55.48003 | 0.239 |
| 55.49003 | 0.265 |
| 55.50003 | 0.286 |
| 55.51003 | 0.298 |
| 55.52003 | 0.302 |
| 55.53003 | 0.298 |
| 55.54003 | 0.289 |
| 55.55003 | 0.277 |
| 55.56003 | 0.262 |
| 55.57003 | 0.249 |
| 55.58003 | 0.236 |
| 55.59003 | 0.227 |
| 55.60003 | 0.221 |
| 55.61003 | 0.218 |
| 55.62003 | 0.218 |
| 55.63003 | 0.22 |
| 55.64003 | 0.223 |
| 55.65003 | 0.226 |
| 55.66003 | 0.226 |
| 55.67003 | 0.224 |
| 55.68003 | 0.22 |
| 55.69003 | 0.212 |
| 55.70003 | 0.203 |
| 55.71003 | 0.193 |
| 55.72003 | 0.185 |
| 55.73003 | 0.18 |
| 55.74003 | 0.178 |
| 55.75003 | 0.181 |
| 55.76003 | 0.187 |
| 55.77003 | 0.194 |
| 55.78003 | 0.202 |
| 55.79003 | 0.207 |
| 55.80003 | 0.211 |
| 55.81003 | 0.212 |
| 55.82003 | 0.212 |
| 55.83003 | 0.215 |
| 55.84003 | 0.221 |
| 55.85003 | 0.233 |
| 55.86003 | 0.251 |
| 55.87003 | 0.273 |
| 55.88003 | 0.297 |
| 55.89003 | 0.319 |
| 55.90003 | 0.336 |
| 55.91003 | 0.344 |
| 55.92003 | 0.343 |
| 55.93003 | 0.332 |
| 55.94003 | 0.314 |
| 55.95003 | 0.291 |
| 55.96003 | 0.267 |
| 55.97003 | 0.246 |
| 55.98003 | 0.23 |
| 55.99003 | 0.221 |
| 56.00003 | 0.221 |
| 56.01003 | 0.229 |
| 56.02003 | 0.244 |
| 56.03003 | 0.262 |
| 56.04003 | 0.283 |
| 56.05003 | 0.301 |
| 56.06003 | 0.316 |
| 56.07003 | 0.325 |
| 56.08003 | 0.328 |
| 56.09003 | 0.324 |
| 56.10003 | 0.316 |
| 56.11003 | 0.305 |
| 56.12003 | 0.293 |
| 56.13003 | 0.283 |
| 56.14003 | 0.276 |
| 56.15003 | 0.272 |
| 56.16003 | 0.271 |
| 56.17003 | 0.271 |
| 56.18003 | 0.272 |
| 56.19003 | 0.27 |
| 56.20003 | 0.266 |
| 56.21003 | 0.257 |
| 56.22003 | 0.246 |
| 56.23003 | 0.234 |
| 56.24003 | 0.222 |
| 56.25003 | 0.214 |
| 56.26003 | 0.211 |
| 56.27003 | 0.215 |
| 56.28003 | 0.226 |
| 56.29003 | 0.241 |
| 56.30003 | 0.258 |
| 56.31003 | 0.272 |
| 56.32003 | 0.28 |
| 56.33003 | 0.279 |
| 56.34003 | 0.27 |
| 56.35003 | 0.253 |
| 56.36003 | 0.232 |
| 56.37003 | 0.21 |
| 56.38003 | 0.192 |
| 56.39003 | 0.18 |
| 56.40003 | 0.176 |
| 56.41003 | 0.18 |
| 56.42003 | 0.19 |
| 56.43003 | 0.204 |
| 56.44003 | 0.217 |
| 56.45003 | 0.228 |
| 56.46003 | 0.235 |
| 56.47003 | 0.236 |
| 56.48003 | 0.233 |
| 56.49003 | 0.226 |
| 56.50003 | 0.219 |
| 56.51003 | 0.214 |
| 56.52003 | 0.215 |
| 56.53003 | 0.222 |
| 56.54003 | 0.237 |
| 56.55003 | 0.257 |
| 56.56003 | 0.279 |
| 56.57003 | 0.301 |
| 56.58003 | 0.319 |
| 56.59003 | 0.332 |
| 56.60003 | 0.337 |
| 56.61003 | 0.336 |
| 56.62003 | 0.33 |
| 56.63003 | 0.322 |
| 56.64003 | 0.314 |
| 56.65003 | 0.308 |
| 56.66003 | 0.306 |
| 56.67003 | 0.307 |
| 56.68003 | 0.312 |
| 56.69003 | 0.322 |
| 56.70003 | 0.335 |
| 56.71003 | 0.35 |
| 56.72003 | 0.366 |
| 56.73003 | 0.38 |
| 56.74003 | 0.39 |
| 56.75003 | 0.392 |
| 56.76003 | 0.386 |
| 56.77003 | 0.37 |
| 56.78003 | 0.347 |
| 56.79003 | 0.318 |
| 56.80003 | 0.289 |
| 56.81003 | 0.262 |
| 56.82003 | 0.242 |
| 56.83003 | 0.229 |
| 56.84003 | 0.225 |
| 56.85003 | 0.228 |
| 56.86003 | 0.237 |
| 56.87003 | 0.247 |
| 56.88003 | 0.258 |
| 56.89003 | 0.266 |
| 56.90003 | 0.271 |
| 56.91003 | 0.273 |
| 56.92003 | 0.272 |
| 56.93003 | 0.269 |
| 56.94003 | 0.265 |
| 56.95003 | 0.26 |
| 56.96003 | 0.257 |
| 56.97003 | 0.255 |
| 56.98003 | 0.257 |
| 56.99003 | 0.261 |
| 57.00003 | 0.268 |
| 57.01003 | 0.277 |
| 57.02003 | 0.285 |
| 57.03003 | 0.292 |
| 57.04003 | 0.296 |
| 57.05003 | 0.296 |
| 57.06003 | 0.292 |
| 57.07003 | 0.285 |
| 57.08003 | 0.275 |
| 57.09003 | 0.264 |
| 57.10003 | 0.253 |
| 57.11003 | 0.244 |
| 57.12003 | 0.237 |
| 57.13003 | 0.235 |
| 57.14003 | 0.238 |
| 57.15003 | 0.245 |
| 57.16003 | 0.256 |
| 57.17003 | 0.268 |
| 57.18003 | 0.279 |
| 57.19003 | 0.284 |
| 57.20003 | 0.282 |
| 57.21003 | 0.272 |
| 57.22003 | 0.255 |
| 57.23003 | 0.233 |
| 57.24003 | 0.21 |
| 57.25003 | 0.19 |
| 57.26003 | 0.177 |
| 57.27003 | 0.171 |
| 57.28003 | 0.174 |
| 57.29003 | 0.182 |
| 57.30003 | 0.194 |
| 57.31003 | 0.206 |
| 57.32003 | 0.216 |
| 57.33003 | 0.223 |
| 57.34003 | 0.225 |
| 57.35003 | 0.224 |
| 57.36003 | 0.219 |
| 57.37003 | 0.213 |
| 57.38003 | 0.207 |
| 57.39003 | 0.201 |
| 57.40003 | 0.198 |
| 57.41003 | 0.197 |
| 57.42003 | 0.199 |
| 57.43003 | 0.205 |
| 57.44003 | 0.214 |
| 57.45003 | 0.225 |
| 57.46003 | 0.238 |
| 57.47003 | 0.25 |
| 57.48003 | 0.26 |
| 57.49003 | 0.267 |
| 57.50003 | 0.27 |
| 57.51003 | 0.27 |
| 57.52003 | 0.266 |
| 57.53003 | 0.261 |
| 57.54003 | 0.256 |
| 57.55003 | 0.251 |
| 57.56003 | 0.248 |
| 57.57003 | 0.246 |
| 57.58003 | 0.246 |
| 57.59003 | 0.246 |
| 57.60003 | 0.246 |
| 57.61003 | 0.245 |
| 57.62003 | 0.245 |
| 57.63003 | 0.246 |
| 57.64003 | 0.25 |
| 57.65003 | 0.259 |
| 57.66003 | 0.272 |
| 57.67003 | 0.289 |
| 57.68003 | 0.308 |
| 57.69003 | 0.325 |
| 57.70003 | 0.335 |
| 57.71003 | 0.338 |
| 57.72003 | 0.33 |
| 57.73003 | 0.314 |
| 57.74003 | 0.293 |
| 57.75003 | 0.272 |
| 57.76003 | 0.254 |
| 57.77003 | 0.243 |
| 57.78003 | 0.24 |
| 57.79003 | 0.244 |
| 57.80003 | 0.251 |
| 57.81003 | 0.26 |
| 57.82003 | 0.266 |
| 57.83003 | 0.268 |
| 57.84003 | 0.266 |
| 57.85003 | 0.259 |
| 57.86003 | 0.248 |
| 57.87003 | 0.234 |
| 57.88003 | 0.218 |
| 57.89003 | 0.199 |
| 57.90003 | 0.18 |
| 57.91003 | 0.161 |
| 57.92003 | 0.144 |
| 57.93003 | 0.132 |
| 57.94003 | 0.124 |
| 57.95003 | 0.124 |
| 57.96003 | 0.13 |
| 57.97003 | 0.141 |
| 57.98003 | 0.156 |
| 57.99003 | 0.171 |
| 58.00003 | 0.184 |
| 58.01003 | 0.195 |
| 58.02003 | 0.202 |
| 58.03003 | 0.208 |
| 58.04003 | 0.211 |
| 58.05003 | 0.215 |
| 58.06003 | 0.22 |
| 58.07003 | 0.226 |
| 58.08003 | 0.235 |
| 58.09003 | 0.246 |
| 58.10003 | 0.257 |
| 58.11003 | 0.268 |
| 58.12003 | 0.277 |
| 58.13003 | 0.284 |
| 58.14003 | 0.288 |
| 58.15003 | 0.288 |
| 58.16003 | 0.284 |
| 58.17003 | 0.278 |
| 58.18003 | 0.271 |
| 58.19003 | 0.264 |
| 58.20003 | 0.258 |
| 58.21003 | 0.254 |
| 58.22003 | 0.253 |
| 58.23003 | 0.254 |
| 58.24003 | 0.256 |
| 58.25003 | 0.258 |
| 58.26003 | 0.26 |
| 58.27003 | 0.258 |
| 58.28003 | 0.254 |
| 58.29003 | 0.248 |
| 58.30003 | 0.239 |
| 58.31003 | 0.23 |
| 58.32003 | 0.222 |
| 58.33003 | 0.215 |
| 58.34003 | 0.211 |
| 58.35003 | 0.21 |
| 58.36003 | 0.214 |
| 58.37003 | 0.22 |
| 58.38003 | 0.229 |
| 58.39003 | 0.24 |
| 58.40003 | 0.251 |
| 58.41003 | 0.262 |
| 58.42003 | 0.272 |
| 58.43003 | 0.281 |
| 58.44003 | 0.287 |
| 58.45003 | 0.29 |
| 58.46003 | 0.29 |
| 58.47003 | 0.286 |
| 58.48003 | 0.279 |
| 58.49003 | 0.269 |
| 58.50003 | 0.257 |
| 58.51003 | 0.247 |
| 58.52003 | 0.239 |
| 58.53003 | 0.236 |
| 58.54003 | 0.239 |
| 58.55003 | 0.249 |
| 58.56003 | 0.264 |
| 58.57003 | 0.282 |
| 58.58003 | 0.299 |
| 58.59003 | 0.314 |
| 58.60003 | 0.323 |
| 58.61003 | 0.327 |
| 58.62003 | 0.324 |
| 58.63003 | 0.316 |
| 58.64003 | 0.306 |
| 58.65003 | 0.294 |
| 58.66003 | 0.284 |
| 58.67003 | 0.277 |
| 58.68003 | 0.274 |
| 58.69003 | 0.274 |
| 58.70003 | 0.278 |
| 58.71003 | 0.286 |
| 58.72003 | 0.295 |
| 58.73003 | 0.304 |
| 58.74003 | 0.313 |
| 58.75003 | 0.32 |
| 58.76003 | 0.325 |
| 58.77003 | 0.328 |
| 58.78003 | 0.329 |
| 58.79003 | 0.329 |
| 58.80003 | 0.328 |
| 58.81003 | 0.328 |
| 58.82003 | 0.326 |
| 58.83003 | 0.324 |
| 58.84003 | 0.321 |
| 58.85003 | 0.316 |
| 58.86003 | 0.309 |
| 58.87003 | 0.301 |
| 58.88003 | 0.293 |
| 58.89003 | 0.285 |
| 58.90003 | 0.278 |
| 58.91003 | 0.273 |
| 58.92003 | 0.269 |
| 58.93003 | 0.266 |
| 58.94003 | 0.263 |
| 58.95003 | 0.26 |
| 58.96003 | 0.254 |
| 58.97003 | 0.246 |
| 58.98003 | 0.234 |
| 58.99003 | 0.221 |
| 59.00003 | 0.206 |
| 59.01003 | 0.191 |
| 59.02003 | 0.18 |
| 59.03003 | 0.174 |
| 59.04003 | 0.176 |
| 59.05003 | 0.185 |
| 59.06003 | 0.201 |
| 59.07003 | 0.221 |
| 59.08003 | 0.241 |
| 59.09003 | 0.258 |
| 59.10003 | 0.269 |
| 59.11003 | 0.273 |
| 59.12003 | 0.272 |
| 59.13003 | 0.266 |
| 59.14003 | 0.26 |
| 59.15003 | 0.254 |
| 59.16003 | 0.252 |
| 59.17003 | 0.253 |
| 59.18003 | 0.256 |
| 59.19003 | 0.262 |
| 59.20003 | 0.269 |
| 59.21003 | 0.278 |
| 59.22003 | 0.288 |
| 59.23003 | 0.3 |
| 59.24003 | 0.313 |
| 59.25003 | 0.326 |
| 59.26003 | 0.336 |
| 59.27003 | 0.341 |
| 59.28003 | 0.34 |
| 59.29003 | 0.333 |
| 59.30003 | 0.32 |
| 59.31003 | 0.303 |
| 59.32003 | 0.285 |
| 59.33003 | 0.269 |
| 59.34003 | 0.256 |
| 59.35003 | 0.247 |
| 59.36003 | 0.242 |
| 59.37003 | 0.241 |
| 59.38003 | 0.242 |
| 59.39003 | 0.244 |
| 59.40003 | 0.246 |
| 59.41003 | 0.248 |
| 59.42003 | 0.25 |
| 59.43003 | 0.252 |
| 59.44003 | 0.252 |
| 59.45003 | 0.252 |
| 59.46003 | 0.25 |
| 59.47003 | 0.248 |
| 59.48003 | 0.246 |
| 59.49003 | 0.244 |
| 59.50003 | 0.245 |
| 59.51003 | 0.247 |
| 59.52003 | 0.252 |
| 59.53003 | 0.26 |
| 59.54003 | 0.267 |
| 59.55003 | 0.275 |
| 59.56003 | 0.28 |
| 59.57003 | 0.283 |
| 59.58003 | 0.283 |
| 59.59003 | 0.28 |
| 59.60003 | 0.276 |
| 59.61003 | 0.272 |
| 59.62003 | 0.269 |
| 59.63003 | 0.268 |
| 59.64003 | 0.269 |
| 59.65003 | 0.272 |
| 59.66003 | 0.274 |
| 59.67003 | 0.275 |
| 59.68003 | 0.273 |
| 59.69003 | 0.268 |
| 59.70003 | 0.259 |
| 59.71003 | 0.247 |
| 59.72003 | 0.233 |
| 59.73003 | 0.219 |
| 59.74003 | 0.207 |
| 59.75003 | 0.198 |
| 59.76003 | 0.194 |
| 59.77003 | 0.194 |
| 59.78003 | 0.2 |
| 59.79003 | 0.209 |
| 59.80003 | 0.223 |
| 59.81003 | 0.237 |
| 59.82003 | 0.251 |
| 59.83003 | 0.263 |
| 59.84003 | 0.27 |
| 59.85003 | 0.273 |
| 59.86003 | 0.27 |
| 59.87003 | 0.264 |
| 59.88003 | 0.255 |
| 59.89003 | 0.245 |
| 59.90003 | 0.236 |
| 59.91003 | 0.229 |
| 59.92003 | 0.225 |
| 59.93003 | 0.223 |
| 59.94003 | 0.224 |
| 59.95003 | 0.226 |
| 59.96003 | 0.229 |
| 59.97003 | 0.232 |
| 59.98003 | 0.236 |
| 59.99003 | 0.239 |
| 60.00003 | 0.242 |
| 60.01003 | 0.245 |
| 60.02003 | 0.249 |
| 60.03003 | 0.252 |
| 60.04003 | 0.256 |
| 60.05003 | 0.261 |
| 60.06003 | 0.265 |
| 60.07003 | 0.269 |
| 60.08003 | 0.272 |
| 60.09003 | 0.274 |
| 60.10003 | 0.273 |
| 60.11003 | 0.27 |
| 60.12003 | 0.264 |
| 60.13003 | 0.256 |
| 60.14003 | 0.247 |
| 60.15003 | 0.239 |
| 60.16003 | 0.233 |
| 60.17003 | 0.231 |
| 60.18003 | 0.232 |
| 60.19003 | 0.237 |
| 60.20003 | 0.243 |
| 60.21003 | 0.25 |
| 60.22003 | 0.256 |
| 60.23003 | 0.26 |
| 60.24003 | 0.261 |
| 60.25003 | 0.26 |
| 60.26003 | 0.256 |
| 60.27003 | 0.253 |
| 60.28003 | 0.25 |
| 60.29003 | 0.249 |
| 60.30003 | 0.251 |
| 60.31003 | 0.257 |
| 60.32003 | 0.266 |
| 60.33003 | 0.278 |
| 60.34003 | 0.29 |
| 60.35003 | 0.301 |
| 60.36003 | 0.308 |
| 60.37003 | 0.31 |
| 60.38003 | 0.305 |
| 60.39003 | 0.295 |
| 60.40003 | 0.281 |
| 60.41003 | 0.265 |
| 60.42003 | 0.249 |
| 60.43003 | 0.236 |
| 60.44003 | 0.226 |
| 60.45003 | 0.22 |
| 60.46003 | 0.216 |
| 60.47003 | 0.216 |
| 60.48003 | 0.217 |
| 60.49003 | 0.219 |
| 60.50003 | 0.222 |
| 60.51003 | 0.224 |
| 60.52003 | 0.224 |
| 60.53003 | 0.223 |
| 60.54003 | 0.218 |
| 60.55003 | 0.21 |
| 60.56003 | 0.199 |
| 60.57003 | 0.186 |
| 60.58003 | 0.174 |
| 60.59003 | 0.166 |
| 60.60003 | 0.163 |
| 60.61003 | 0.166 |
| 60.62003 | 0.174 |
| 60.63003 | 0.188 |
| 60.64003 | 0.202 |
| 60.65003 | 0.217 |
| 60.66003 | 0.23 |
| 60.67003 | 0.239 |
| 60.68003 | 0.245 |
| 60.69003 | 0.248 |
| 60.70003 | 0.25 |
| 60.71003 | 0.249 |
| 60.72003 | 0.248 |
| 60.73003 | 0.245 |
| 60.74003 | 0.242 |
| 60.75003 | 0.239 |
| 60.76003 | 0.238 |
| 60.77003 | 0.238 |
| 60.78003 | 0.24 |
| 60.79003 | 0.244 |
| 60.80003 | 0.249 |
| 60.81003 | 0.254 |
| 60.82003 | 0.256 |
| 60.83003 | 0.255 |
| 60.84003 | 0.25 |
| 60.85003 | 0.242 |
| 60.86003 | 0.232 |
| 60.87003 | 0.222 |
| 60.88003 | 0.215 |
| 60.89003 | 0.21 |
| 60.90003 | 0.209 |
| 60.91003 | 0.212 |
| 60.92003 | 0.217 |
| 60.93003 | 0.223 |
| 60.94003 | 0.23 |
| 60.95003 | 0.235 |
| 60.96003 | 0.24 |
| 60.97003 | 0.242 |
| 60.98003 | 0.241 |
| 60.99003 | 0.238 |
| 61.00003 | 0.233 |
| 61.01003 | 0.227 |
| 61.02003 | 0.221 |
| 61.03003 | 0.219 |
| 61.04003 | 0.22 |
| 61.05003 | 0.227 |
| 61.06003 | 0.239 |
| 61.07003 | 0.256 |
| 61.08003 | 0.274 |
| 61.09003 | 0.29 |
| 61.10003 | 0.303 |
| 61.11003 | 0.31 |
| 61.12003 | 0.311 |
| 61.13003 | 0.307 |
| 61.14003 | 0.3 |
| 61.15003 | 0.292 |
| 61.16003 | 0.284 |
| 61.17003 | 0.28 |
| 61.18003 | 0.279 |
| 61.19003 | 0.28 |
| 61.20003 | 0.282 |
| 61.21003 | 0.284 |
| 61.22003 | 0.286 |
| 61.23003 | 0.287 |
| 61.24003 | 0.288 |
| 61.25003 | 0.288 |
| 61.26003 | 0.29 |
| 61.27003 | 0.292 |
| 61.28003 | 0.295 |
| 61.29003 | 0.298 |
| 61.30003 | 0.3 |
| 61.31003 | 0.299 |
| 61.32003 | 0.296 |
| 61.33003 | 0.291 |
| 61.34003 | 0.284 |
| 61.35003 | 0.275 |
| 61.36003 | 0.268 |
| 61.37003 | 0.261 |
| 61.38003 | 0.257 |
| 61.39003 | 0.254 |
| 61.40003 | 0.253 |
| 61.41003 | 0.252 |
| 61.42003 | 0.252 |
| 61.43003 | 0.251 |
| 61.44003 | 0.25 |
| 61.45003 | 0.248 |
| 61.46003 | 0.247 |
| 61.47003 | 0.246 |
| 61.48003 | 0.244 |
| 61.49003 | 0.24 |
| 61.50003 | 0.234 |
| 61.51003 | 0.225 |
| 61.52003 | 0.215 |
| 61.53003 | 0.204 |
| 61.54003 | 0.194 |
| 61.55003 | 0.188 |
| 61.56003 | 0.188 |
| 61.57003 | 0.194 |
| 61.58003 | 0.205 |
| 61.59003 | 0.22 |
| 61.60003 | 0.234 |
| 61.61003 | 0.247 |
| 61.62003 | 0.255 |
| 61.63003 | 0.258 |
| 61.64003 | 0.255 |
| 61.65003 | 0.248 |
| 61.66003 | 0.24 |
| 61.67003 | 0.233 |
| 61.68003 | 0.229 |
| 61.69003 | 0.228 |
| 61.70003 | 0.232 |
| 61.71003 | 0.24 |
| 61.72003 | 0.251 |
| 61.73003 | 0.264 |
| 61.74003 | 0.278 |
| 61.75003 | 0.291 |
| 61.76003 | 0.303 |
| 61.77003 | 0.312 |
| 61.78003 | 0.318 |
| 61.79003 | 0.321 |
| 61.80003 | 0.319 |
| 61.81003 | 0.314 |
| 61.82003 | 0.308 |
| 61.83003 | 0.299 |
| 61.84003 | 0.292 |
| 61.85003 | 0.285 |
| 61.86003 | 0.281 |
| 61.87003 | 0.28 |
| 61.88003 | 0.281 |
| 61.89003 | 0.283 |
| 61.90003 | 0.285 |
| 61.91003 | 0.287 |
| 61.92003 | 0.288 |
| 61.93003 | 0.287 |
| 61.94003 | 0.284 |
| 61.95004 | 0.281 |
| 61.96003 | 0.277 |
| 61.97003 | 0.274 |
| 61.98003 | 0.27 |
| 61.99003 | 0.268 |
| 62.00003 | 0.267 |
| 62.01003 | 0.266 |
| 62.02003 | 0.265 |
| 62.03003 | 0.265 |
| 62.04003 | 0.264 |
| 62.05003 | 0.264 |
| 62.06003 | 0.264 |
| 62.07003 | 0.264 |
| 62.08003 | 0.264 |
| 62.09003 | 0.264 |
| 62.10003 | 0.266 |
| 62.11003 | 0.268 |
| 62.12003 | 0.27 |
| 62.13003 | 0.273 |
| 62.14003 | 0.276 |
| 62.15003 | 0.279 |
| 62.16003 | 0.283 |
| 62.17003 | 0.286 |
| 62.18003 | 0.29 |
| 62.19003 | 0.293 |
| 62.20004 | 0.295 |
| 62.21003 | 0.295 |
| 62.22003 | 0.292 |
| 62.23003 | 0.287 |
| 62.24003 | 0.28 |
| 62.25003 | 0.271 |
| 62.26003 | 0.26 |
| 62.27003 | 0.251 |
| 62.28003 | 0.243 |
| 62.29004 | 0.238 |
| 62.30003 | 0.236 |
| 62.31003 | 0.239 |
| 62.32003 | 0.245 |
| 62.33003 | 0.254 |
| 62.34003 | 0.265 |
| 62.35003 | 0.276 |
| 62.36003 | 0.283 |
| 62.37003 | 0.285 |
| 62.38003 | 0.282 |
| 62.39003 | 0.272 |
| 62.40003 | 0.258 |
| 62.41003 | 0.242 |
| 62.42003 | 0.226 |
| 62.43003 | 0.213 |
| 62.44003 | 0.205 |
| 62.45004 | 0.203 |
| 62.46003 | 0.206 |
| 62.47003 | 0.212 |
| 62.48003 | 0.22 |
| 62.49003 | 0.227 |
| 62.50003 | 0.232 |
| 62.51003 | 0.234 |
| 62.52003 | 0.234 |
| 62.53003 | 0.232 |
| 62.54004 | 0.23 |
| 62.55003 | 0.227 |
| 62.56003 | 0.225 |
| 62.57003 | 0.225 |
| 62.58003 | 0.225 |
| 62.59003 | 0.225 |
| 62.60003 | 0.226 |
| 62.61003 | 0.227 |
| 62.62003 | 0.227 |
| 62.63004 | 0.228 |
| 62.64003 | 0.229 |
| 62.65003 | 0.23 |
| 62.66003 | 0.233 |
| 62.67003 | 0.236 |
| 62.68003 | 0.24 |
| 62.69003 | 0.244 |
| 62.70004 | 0.248 |
| 62.71003 | 0.251 |
| 62.72003 | 0.252 |
| 62.73003 | 0.254 |
| 62.74003 | 0.255 |
| 62.75003 | 0.257 |
| 62.76003 | 0.26 |
| 62.77003 | 0.265 |
| 62.78003 | 0.269 |
| 62.79004 | 0.273 |
| 62.80003 | 0.276 |
| 62.81003 | 0.278 |
| 62.82003 | 0.278 |
| 62.83003 | 0.279 |
| 62.84003 | 0.281 |
| 62.85003 | 0.284 |
| 62.86003 | 0.289 |
| 62.87003 | 0.295 |
| 62.88004 | 0.3 |
| 62.89003 | 0.301 |
| 62.90003 | 0.299 |
| 62.91003 | 0.291 |
| 62.92003 | 0.28 |
| 62.93003 | 0.268 |
| 62.94003 | 0.256 |
| 62.95004 | 0.248 |
| 62.96003 | 0.245 |
| 62.97004 | 0.246 |
| 62.98003 | 0.252 |
| 62.99003 | 0.259 |
| 63.00003 | 0.266 |
| 63.01003 | 0.27 |
| 63.02003 | 0.27 |
| 63.03003 | 0.267 |
| 63.04004 | 0.261 |
| 63.05003 | 0.252 |
| 63.06004 | 0.242 |
| 63.07003 | 0.231 |
| 63.08003 | 0.219 |
| 63.09003 | 0.207 |
| 63.10003 | 0.197 |
| 63.11003 | 0.189 |
| 63.12003 | 0.184 |
| 63.13004 | 0.182 |
| 63.14003 | 0.186 |
| 63.15003 | 0.193 |
| 63.16003 | 0.203 |
| 63.17003 | 0.215 |
| 63.18003 | 0.226 |
| 63.19003 | 0.236 |
| 63.20004 | 0.244 |
| 63.21003 | 0.249 |
| 63.22004 | 0.252 |
| 63.23003 | 0.253 |
| 63.24003 | 0.252 |
| 63.25003 | 0.252 |
| 63.26003 | 0.251 |
| 63.27003 | 0.25 |
| 63.28003 | 0.25 |
| 63.29004 | 0.25 |
| 63.30003 | 0.251 |
| 63.31004 | 0.252 |
| 63.32003 | 0.254 |
| 63.33003 | 0.257 |
| 63.34003 | 0.26 |
| 63.35003 | 0.262 |
| 63.36003 | 0.263 |
| 63.37003 | 0.263 |
| 63.38004 | 0.261 |
| 63.39003 | 0.258 |
| 63.40004 | 0.254 |
| 63.41003 | 0.25 |
| 63.42003 | 0.247 |
| 63.43003 | 0.246 |
| 63.44003 | 0.245 |
| 63.45004 | 0.246 |
| 63.46003 | 0.247 |
| 63.47004 | 0.247 |
| 63.48003 | 0.247 |
| 63.49003 | 0.245 |
| 63.50003 | 0.242 |
| 63.51003 | 0.239 |
| 63.52003 | 0.236 |
| 63.53003 | 0.233 |
| 63.54004 | 0.233 |
| 63.55003 | 0.234 |
| 63.56004 | 0.238 |
| 63.57003 | 0.244 |
| 63.58003 | 0.252 |
| 63.59003 | 0.261 |
| 63.60003 | 0.27 |
| 63.61003 | 0.276 |
| 63.62003 | 0.281 |
| 63.63004 | 0.281 |
| 63.64003 | 0.278 |
| 63.65004 | 0.272 |
| 63.66003 | 0.264 |
| 63.67003 | 0.255 |
| 63.68003 | 0.247 |
| 63.69003 | 0.243 |
| 63.70004 | 0.242 |
| 63.71003 | 0.247 |
| 63.72004 | 0.254 |
| 63.73003 | 0.264 |
| 63.74004 | 0.275 |
| 63.75003 | 0.284 |
| 63.76003 | 0.29 |
| 63.77003 | 0.292 |
| 63.78003 | 0.29 |
| 63.79004 | 0.285 |
| 63.80003 | 0.278 |
| 63.81004 | 0.271 |
| 63.82003 | 0.263 |
| 63.83003 | 0.257 |
| 63.84003 | 0.252 |
| 63.85003 | 0.248 |
| 63.86003 | 0.244 |
| 63.87003 | 0.242 |
| 63.88004 | 0.241 |
| 63.89003 | 0.24 |
| 63.90004 | 0.24 |
| 63.91003 | 0.241 |
| 63.92003 | 0.242 |
| 63.93003 | 0.245 |
| 63.94003 | 0.248 |
| 63.95004 | 0.253 |
| 63.96003 | 0.257 |
| 63.97004 | 0.261 |
| 63.98003 | 0.264 |
| 63.99004 | 0.266 |
| 64.00003 | 0.266 |
| 64.01003 | 0.264 |
| 64.02003 | 0.262 |
| 64.03004 | 0.258 |
| 64.04003 | 0.255 |
| 64.05003 | 0.252 |
| 64.06004 | 0.249 |
| 64.07004 | 0.247 |
| 64.08003 | 0.246 |
| 64.09003 | 0.245 |
| 64.10004 | 0.245 |
| 64.11003 | 0.246 |
| 64.12003 | 0.247 |
| 64.13004 | 0.25 |
| 64.14004 | 0.252 |
| 64.15003 | 0.253 |
| 64.16003 | 0.252 |
| 64.17004 | 0.249 |
| 64.18003 | 0.243 |
| 64.19003 | 0.236 |
| 64.20004 | 0.228 |
| 64.21004 | 0.224 |
| 64.22003 | 0.222 |
| 64.23003 | 0.226 |
| 64.24004 | 0.233 |
| 64.25004 | 0.244 |
| 64.26003 | 0.256 |
| 64.27003 | 0.268 |
| 64.28004 | 0.276 |
| 64.29003 | 0.282 |
| 64.30003 | 0.284 |
| 64.31004 | 0.284 |
| 64.32004 | 0.282 |
| 64.33003 | 0.28 |
| 64.34003 | 0.277 |
| 64.35004 | 0.276 |
| 64.36003 | 0.275 |
| 64.37003 | 0.275 |
| 64.38004 | 0.277 |
| 64.39004 | 0.281 |
| 64.40003 | 0.286 |
| 64.41003 | 0.293 |
| 64.42004 | 0.3 |
| 64.43003 | 0.305 |
| 64.44003 | 0.308 |
| 64.45004 | 0.308 |
| 64.46004 | 0.302 |
| 64.47003 | 0.294 |
| 64.48003 | 0.282 |
| 64.49004 | 0.268 |
| 64.50004 | 0.256 |
| 64.51003 | 0.245 |
| 64.52003 | 0.238 |
| 64.53004 | 0.234 |
| 64.54003 | 0.233 |
| 64.55003 | 0.235 |
| 64.56004 | 0.238 |
| 64.57004 | 0.243 |
| 64.58003 | 0.247 |
| 64.59003 | 0.25 |
| 64.60004 | 0.252 |
| 64.61003 | 0.253 |
| 64.62003 | 0.252 |
| 64.63004 | 0.25 |
| 64.64004 | 0.247 |
| 64.65003 | 0.244 |
| 64.66003 | 0.242 |
| 64.67004 | 0.243 |
| 64.68004 | 0.245 |
| 64.69003 | 0.25 |
| 64.70004 | 0.256 |
| 64.71004 | 0.262 |
| 64.72003 | 0.268 |
| 64.73003 | 0.272 |
| 64.74004 | 0.274 |
| 64.75004 | 0.274 |
| 64.76003 | 0.272 |
| 64.77003 | 0.27 |
| 64.78004 | 0.267 |
| 64.79003 | 0.265 |
| 64.80003 | 0.264 |
| 64.81004 | 0.263 |
| 64.82004 | 0.263 |
| 64.83003 | 0.264 |
| 64.84003 | 0.264 |
| 64.85004 | 0.264 |
| 64.86003 | 0.265 |
| 64.87003 | 0.264 |
| 64.88004 | 0.263 |
| 64.89004 | 0.261 |
| 64.90003 | 0.258 |
| 64.91003 | 0.254 |
| 64.92004 | 0.249 |
| 64.93004 | 0.244 |
| 64.94003 | 0.239 |
| 64.95004 | 0.236 |
| 64.96004 | 0.235 |
| 64.97003 | 0.236 |
| 64.98003 | 0.239 |
| 64.99004 | 0.243 |
| 65.00004 | 0.247 |
| 65.01003 | 0.25 |
| 65.02003 | 0.252 |
| 65.03004 | 0.251 |
| 65.04003 | 0.248 |
| 65.05003 | 0.244 |
| 65.06004 | 0.24 |
| 65.07004 | 0.237 |
| 65.08003 | 0.234 |
| 65.09003 | 0.232 |
| 65.10004 | 0.231 |
| 65.11003 | 0.23 |
| 65.12003 | 0.228 |
| 65.13004 | 0.226 |
| 65.14004 | 0.223 |
| 65.15003 | 0.221 |
| 65.16003 | 0.22 |
| 65.17004 | 0.22 |
| 65.18004 | 0.222 |
| 65.19003 | 0.225 |
| 65.20004 | 0.23 |
| 65.21004 | 0.235 |
| 65.22003 | 0.24 |
| 65.23003 | 0.244 |
| 65.24004 | 0.248 |
| 65.25004 | 0.25 |
| 65.26003 | 0.25 |
| 65.27003 | 0.25 |
| 65.28004 | 0.248 |
| 65.29003 | 0.246 |
| 65.30003 | 0.245 |
| 65.31004 | 0.244 |
| 65.32004 | 0.245 |
| 65.33003 | 0.246 |
| 65.34003 | 0.249 |
| 65.35004 | 0.254 |
| 65.36004 | 0.26 |
| 65.37003 | 0.266 |
| 65.38004 | 0.273 |
| 65.39004 | 0.28 |
| 65.40003 | 0.285 |
| 65.41003 | 0.289 |
| 65.42004 | 0.289 |
| 65.43004 | 0.287 |
| 65.44003 | 0.283 |
| 65.45004 | 0.277 |
| 65.46004 | 0.271 |
| 65.47003 | 0.266 |
| 65.48003 | 0.263 |
| 65.49004 | 0.263 |
| 65.50004 | 0.265 |
| 65.51003 | 0.269 |
| 65.52003 | 0.273 |
| 65.53004 | 0.276 |
| 65.54003 | 0.276 |
| 65.55003 | 0.274 |
| 65.56004 | 0.268 |
| 65.57004 | 0.26 |
| 65.58003 | 0.25 |
| 65.59003 | 0.241 |
| 65.60004 | 0.234 |
| 65.61004 | 0.228 |
| 65.62003 | 0.224 |
| 65.63004 | 0.223 |
| 65.64004 | 0.223 |
| 65.65003 | 0.225 |
| 65.66003 | 0.228 |
| 65.67004 | 0.231 |
| 65.68004 | 0.235 |
| 65.69003 | 0.238 |
| 65.70004 | 0.241 |
| 65.71004 | 0.242 |
| 65.72003 | 0.242 |
| 65.73003 | 0.24 |
| 65.74004 | 0.238 |
| 65.75004 | 0.234 |
| 65.76003 | 0.232 |
| 65.77003 | 0.23 |
| 65.78004 | 0.23 |
| 65.79004 | 0.231 |
| 65.80003 | 0.234 |
| 65.81004 | 0.238 |
| 65.82004 | 0.243 |
| 65.83003 | 0.247 |
| 65.84003 | 0.25 |
| 65.85004 | 0.252 |
| 65.86004 | 0.253 |
| 65.87003 | 0.254 |
| 65.88004 | 0.255 |
| 65.89004 | 0.255 |
| 65.90003 | 0.255 |
| 65.91003 | 0.255 |
| 65.92004 | 0.255 |
| 65.93004 | 0.255 |
| 65.94003 | 0.254 |
| 65.95004 | 0.254 |
| 65.96004 | 0.254 |
| 65.97003 | 0.254 |
| 65.98003 | 0.255 |
| 65.99004 | 0.254 |
| 66.00004 | 0.253 |
| 66.01003 | 0.251 |
| 66.02003 | 0.248 |
| 66.03004 | 0.245 |
| 66.04004 | 0.241 |
| 66.05003 | 0.238 |
| 66.06004 | 0.237 |
| 66.07004 | 0.238 |
| 66.08003 | 0.241 |
| 66.09003 | 0.246 |
| 66.10004 | 0.252 |
| 66.11004 | 0.258 |
| 66.12003 | 0.263 |
| 66.13004 | 0.267 |
| 66.14004 | 0.269 |
| 66.15003 | 0.268 |
| 66.16003 | 0.264 |
| 66.17004 | 0.259 |
| 66.18004 | 0.252 |
| 66.19003 | 0.245 |
| 66.20004 | 0.239 |
| 66.21004 | 0.236 |
| 66.22003 | 0.234 |
| 66.23003 | 0.236 |
| 66.24004 | 0.241 |
| 66.25004 | 0.248 |
| 66.26003 | 0.255 |
| 66.27003 | 0.262 |
| 66.28004 | 0.267 |
| 66.29004 | 0.269 |
| 66.30003 | 0.269 |
| 66.31004 | 0.266 |
| 66.32004 | 0.264 |
| 66.33003 | 0.261 |
| 66.34003 | 0.26 |
| 66.35004 | 0.26 |
| 66.36004 | 0.263 |
| 66.37003 | 0.266 |
| 66.38004 | 0.269 |
| 66.39004 | 0.272 |
| 66.40003 | 0.274 |
| 66.41003 | 0.274 |
| 66.42004 | 0.274 |
| 66.43004 | 0.273 |
| 66.44003 | 0.272 |
| 66.45004 | 0.27 |
| 66.46004 | 0.269 |
| 66.47004 | 0.268 |
| 66.48003 | 0.268 |
| 66.49004 | 0.268 |
| 66.50004 | 0.268 |
| 66.51003 | 0.268 |
| 66.52003 | 0.267 |
| 66.53004 | 0.267 |
| 66.54004 | 0.266 |
| 66.55003 | 0.265 |
| 66.56004 | 0.265 |
| 66.57004 | 0.264 |
| 66.58003 | 0.264 |
| 66.59003 | 0.264 |
| 66.60004 | 0.264 |
| 66.61004 | 0.264 |
| 66.62003 | 0.264 |
| 66.63004 | 0.264 |
| 66.64004 | 0.264 |
| 66.65003 | 0.263 |
| 66.66003 | 0.262 |
| 66.67004 | 0.26 |
| 66.68004 | 0.257 |
| 66.69003 | 0.252 |
| 66.70004 | 0.246 |
| 66.71004 | 0.239 |
| 66.72004 | 0.231 |
| 66.73003 | 0.225 |
| 66.74004 | 0.22 |
| 66.75004 | 0.219 |
| 66.76003 | 0.221 |
| 66.77003 | 0.224 |
| 66.78004 | 0.229 |
| 66.79004 | 0.234 |
| 66.80003 | 0.237 |
| 66.81004 | 0.238 |
| 66.82004 | 0.238 |
| 66.83003 | 0.236 |
| 66.84003 | 0.235 |
| 66.85004 | 0.234 |
| 66.86004 | 0.236 |
| 66.87003 | 0.239 |
| 66.88004 | 0.244 |
| 66.89004 | 0.25 |
| 66.90004 | 0.256 |
| 66.91003 | 0.262 |
| 66.92004 | 0.268 |
| 66.93004 | 0.274 |
| 66.94003 | 0.28 |
| 66.95004 | 0.286 |
| 66.96004 | 0.291 |
| 66.97004 | 0.295 |
| 66.98003 | 0.297 |
| 66.99004 | 0.298 |
| 67.00004 | 0.296 |
| 67.01003 | 0.293 |
| 67.02003 | 0.289 |
| 67.03004 | 0.285 |
| 67.04004 | 0.282 |
| 67.05003 | 0.281 |
| 67.06004 | 0.28 |
| 67.07004 | 0.281 |
| 67.08003 | 0.281 |
| 67.09003 | 0.281 |
| 67.10004 | 0.281 |
| 67.11004 | 0.28 |
| 67.12003 | 0.279 |
| 67.13004 | 0.278 |
| 67.14004 | 0.277 |
| 67.15004 | 0.275 |
| 67.16003 | 0.274 |
| 67.17004 | 0.271 |
| 67.18004 | 0.268 |
| 67.19003 | 0.265 |
| 67.20004 | 0.262 |
| 67.21004 | 0.26 |
| 67.22004 | 0.259 |
| 67.23003 | 0.259 |
| 67.24004 | 0.26 |
| 67.25004 | 0.261 |
| 67.26003 | 0.263 |
| 67.27003 | 0.264 |
| 67.28004 | 0.264 |
| 67.29004 | 0.263 |
| 67.30003 | 0.262 |
| 67.31004 | 0.261 |
| 67.32004 | 0.261 |
| 67.33003 | 0.262 |
| 67.34003 | 0.264 |
| 67.35004 | 0.268 |
| 67.36004 | 0.272 |
| 67.37003 | 0.275 |
| 67.38004 | 0.278 |
| 67.39004 | 0.279 |
| 67.40004 | 0.279 |
| 67.41003 | 0.277 |
| 67.42004 | 0.274 |
| 67.43004 | 0.269 |
| 67.44003 | 0.263 |
| 67.45004 | 0.257 |
| 67.46004 | 0.251 |
| 67.47004 | 0.247 |
| 67.48003 | 0.244 |
| 67.49004 | 0.244 |
| 67.50004 | 0.246 |
| 67.51003 | 0.249 |
| 67.52003 | 0.254 |
| 67.53004 | 0.258 |
| 67.54004 | 0.26 |
| 67.55003 | 0.26 |
| 67.56004 | 0.257 |
| 67.57004 | 0.252 |
| 67.58004 | 0.246 |
| 67.59003 | 0.239 |
| 67.60004 | 0.234 |
| 67.61004 | 0.231 |
| 67.62003 | 0.231 |
| 67.63004 | 0.232 |
| 67.64004 | 0.235 |
| 67.65004 | 0.239 |
| 67.66003 | 0.241 |
| 67.67004 | 0.243 |
| 67.68004 | 0.243 |
| 67.69003 | 0.242 |
| 67.70004 | 0.242 |
| 67.71004 | 0.242 |
| 67.72004 | 0.244 |
| 67.73003 | 0.246 |
| 67.74004 | 0.248 |
| 67.75004 | 0.251 |
| 67.76003 | 0.254 |
| 67.77003 | 0.255 |
| 67.78004 | 0.255 |
| 67.79004 | 0.255 |
| 67.80003 | 0.253 |
| 67.81004 | 0.252 |
| 67.82004 | 0.25 |
| 67.83004 | 0.249 |
| 67.84003 | 0.249 |
| 67.85004 | 0.249 |
| 67.86004 | 0.25 |
| 67.87003 | 0.252 |
| 67.88004 | 0.254 |
| 67.89004 | 0.256 |
| 67.90004 | 0.259 |
| 67.91003 | 0.262 |
| 67.92004 | 0.264 |
| 67.93004 | 0.266 |
| 67.94003 | 0.267 |
| 67.95004 | 0.266 |
| 67.96004 | 0.263 |
| 67.97004 | 0.259 |
| 67.98003 | 0.255 |
| 67.99004 | 0.251 |
| 68.00004 | 0.249 |
| 68.01004 | 0.25 |
| 68.02003 | 0.253 |
| 68.03004 | 0.258 |
| 68.04004 | 0.265 |
| 68.05003 | 0.271 |
| 68.06004 | 0.276 |
| 68.07004 | 0.278 |
| 68.08004 | 0.276 |
| 68.09003 | 0.271 |
| 68.10004 | 0.265 |
| 68.11004 | 0.258 |
| 68.12003 | 0.252 |
| 68.13004 | 0.248 |
| 68.14004 | 0.247 |
| 68.15004 | 0.247 |
| 68.16003 | 0.248 |
| 68.17004 | 0.249 |
| 68.18004 | 0.25 |
| 68.19003 | 0.251 |
| 68.20004 | 0.25 |
| 68.21004 | 0.249 |
| 68.22004 | 0.247 |
| 68.23003 | 0.244 |
| 68.24004 | 0.24 |
| 68.25004 | 0.236 |
| 68.26004 | 0.231 |
| 68.27003 | 0.226 |
| 68.28004 | 0.221 |
| 68.29004 | 0.218 |
| 68.30003 | 0.217 |
| 68.31004 | 0.218 |
| 68.32004 | 0.222 |
| 68.33004 | 0.227 |
| 68.34003 | 0.232 |
| 68.35004 | 0.238 |
| 68.36004 | 0.242 |
| 68.37003 | 0.244 |
| 68.38004 | 0.244 |
| 68.39004 | 0.243 |
| 68.40004 | 0.242 |
| 68.41003 | 0.24 |
| 68.42004 | 0.238 |
| 68.43004 | 0.238 |
| 68.44003 | 0.238 |
| 68.45004 | 0.239 |
| 68.46004 | 0.241 |
| 68.47004 | 0.243 |
| 68.48003 | 0.245 |
| 68.49004 | 0.247 |
| 68.50004 | 0.248 |
| 68.51004 | 0.249 |
| 68.52003 | 0.248 |
| 68.53004 | 0.247 |
| 68.54004 | 0.246 |
| 68.55003 | 0.244 |
| 68.56004 | 0.242 |
| 68.57004 | 0.241 |
| 68.58004 | 0.24 |
| 68.59003 | 0.241 |
| 68.60004 | 0.241 |
| 68.61004 | 0.243 |
| 68.62003 | 0.244 |
| 68.63004 | 0.246 |
| 68.64004 | 0.247 |
| 68.65004 | 0.248 |
| 68.66003 | 0.248 |
| 68.67004 | 0.248 |
| 68.68004 | 0.247 |
| 68.69004 | 0.246 |
| 68.70004 | 0.245 |
| 68.71004 | 0.244 |
| 68.72004 | 0.242 |
| 68.73003 | 0.241 |
| 68.74004 | 0.241 |
| 68.75004 | 0.243 |
| 68.76004 | 0.245 |
| 68.77003 | 0.25 |
| 68.78004 | 0.255 |
| 68.79004 | 0.26 |
| 68.80003 | 0.265 |
| 68.81004 | 0.268 |
| 68.82004 | 0.269 |
| 68.83004 | 0.268 |
| 68.84003 | 0.266 |
| 68.85004 | 0.263 |
| 68.86004 | 0.261 |
| 68.87003 | 0.261 |
| 68.88004 | 0.262 |
| 68.89004 | 0.265 |
| 68.90004 | 0.269 |
| 68.91003 | 0.274 |
| 68.92004 | 0.278 |
| 68.93004 | 0.281 |
| 68.94004 | 0.282 |
| 68.95004 | 0.282 |
| 68.96004 | 0.281 |
| 68.97004 | 0.279 |
| 68.98003 | 0.278 |
| 68.99004 | 0.278 |
| 69.00004 | 0.278 |
| 69.01004 | 0.278 |
| 69.02003 | 0.278 |
| 69.03004 | 0.277 |
| 69.04004 | 0.275 |
| 69.05003 | 0.272 |
| 69.06004 | 0.268 |
| 69.07004 | 0.264 |
| 69.08004 | 0.26 |
| 69.09003 | 0.257 |
| 69.10004 | 0.255 |
| 69.11004 | 0.254 |
| 69.12004 | 0.255 |
| 69.13004 | 0.256 |
| 69.14004 | 0.256 |
| 69.15004 | 0.256 |
| 69.16003 | 0.256 |
| 69.17004 | 0.254 |
| 69.18004 | 0.252 |
| 69.19004 | 0.249 |
| 69.20004 | 0.246 |
| 69.21004 | 0.244 |
| 69.22004 | 0.242 |
| 69.23003 | 0.24 |
| 69.24004 | 0.239 |
| 69.25004 | 0.238 |
| 69.26004 | 0.237 |
| 69.27003 | 0.236 |
| 69.28004 | 0.237 |
| 69.29004 | 0.238 |
| 69.30003 | 0.241 |
| 69.31004 | 0.244 |
| 69.32004 | 0.247 |
| 69.33004 | 0.249 |
| 69.34003 | 0.249 |
| 69.35004 | 0.248 |
| 69.36004 | 0.245 |
| 69.37004 | 0.241 |
| 69.38004 | 0.238 |
| 69.39004 | 0.236 |
| 69.40004 | 0.236 |
| 69.41003 | 0.238 |
| 69.42004 | 0.243 |
| 69.43004 | 0.249 |
| 69.44004 | 0.255 |
| 69.45004 | 0.261 |
| 69.46004 | 0.265 |
| 69.47004 | 0.268 |
| 69.48003 | 0.27 |
| 69.49004 | 0.27 |
| 69.50004 | 0.27 |
| 69.51004 | 0.27 |
| 69.52003 | 0.27 |
| 69.53004 | 0.27 |
| 69.54004 | 0.27 |
| 69.55003 | 0.27 |
| 69.56004 | 0.27 |
| 69.57004 | 0.27 |
| 69.58004 | 0.27 |
| 69.59003 | 0.27 |
| 69.60004 | 0.27 |
| 69.61004 | 0.27 |
| 69.62004 | 0.269 |
| 69.63004 | 0.268 |
| 69.64004 | 0.266 |
| 69.65004 | 0.264 |
| 69.66003 | 0.261 |
| 69.67004 | 0.259 |
| 69.68004 | 0.258 |
| 69.69004 | 0.256 |
| 69.70004 | 0.255 |
| 69.71004 | 0.255 |
| 69.72004 | 0.254 |
| 69.73003 | 0.254 |
| 69.74004 | 0.254 |
| 69.75004 | 0.254 |
| 69.76004 | 0.253 |
| 69.77003 | 0.252 |
| 69.78004 | 0.252 |
| 69.79004 | 0.251 |
| 69.80004 | 0.251 |
| 69.81004 | 0.251 |
| 69.82004 | 0.251 |
| 69.83004 | 0.251 |
| 69.84003 | 0.252 |
| 69.85004 | 0.253 |
| 69.86004 | 0.255 |
| 69.87004 | 0.257 |
| 69.88004 | 0.259 |
| 69.89004 | 0.262 |
| 69.90004 | 0.263 |
| 69.91003 | 0.264 |
| 69.92004 | 0.264 |
| 69.93004 | 0.264 |
| 69.94004 | 0.262 |
| 69.95004 | 0.259 |
| 69.96004 | 0.256 |
| 69.97004 | 0.252 |
| 69.98003 | 0.25 |
| 69.99004 | 0.248 |
| 70.00004 | 0.247 |
| 70.01004 | 0.248 |
| 70.02003 | 0.25 |
| 70.03004 | 0.254 |
| 70.04004 | 0.257 |
| 70.05004 | 0.261 |
| 70.06004 | 0.264 |
| 70.07004 | 0.266 |
| 70.08004 | 0.266 |
| 70.09003 | 0.264 |
| 70.10004 | 0.261 |
| 70.11004 | 0.256 |
| 70.12004 | 0.252 |
| 70.13004 | 0.249 |
| 70.14004 | 0.246 |
| 70.15004 | 0.245 |
| 70.16003 | 0.246 |
| 70.17004 | 0.247 |
| 70.18004 | 0.249 |
| 70.19004 | 0.251 |
| 70.20004 | 0.253 |
| 70.21004 | 0.253 |
| 70.22004 | 0.253 |
| 70.23003 | 0.253 |
| 70.24004 | 0.252 |
| 70.25004 | 0.251 |
| 70.26004 | 0.251 |
| 70.27003 | 0.251 |
| 70.28004 | 0.251 |
| 70.29004 | 0.252 |
| 70.30004 | 0.252 |
| 70.31004 | 0.252 |
| 70.32004 | 0.251 |
| 70.33004 | 0.249 |
| 70.34003 | 0.247 |
| 70.35004 | 0.245 |
| 70.36004 | 0.244 |
| 70.37004 | 0.244 |
| 70.38004 | 0.244 |
| 70.39004 | 0.246 |
| 70.40004 | 0.248 |
| 70.41003 | 0.25 |
| 70.42004 | 0.252 |
| 70.43004 | 0.253 |
| 70.44004 | 0.253 |
| 70.45004 | 0.252 |
| 70.46004 | 0.251 |
| 70.47004 | 0.25 |
| 70.48004 | 0.25 |
| 70.49004 | 0.25 |
| 70.50004 | 0.25 |
| 70.51004 | 0.252 |
| 70.52003 | 0.253 |
| 70.53004 | 0.255 |
| 70.54004 | 0.257 |
| 70.55004 | 0.259 |
| 70.56004 | 0.262 |
| 70.57004 | 0.265 |
| 70.58004 | 0.268 |
| 70.59003 | 0.271 |
| 70.60004 | 0.273 |
| 70.61004 | 0.274 |
| 70.62004 | 0.274 |
| 70.63004 | 0.272 |
| 70.64004 | 0.27 |
| 70.65004 | 0.268 |
| 70.66003 | 0.266 |
| 70.67004 | 0.266 |
| 70.68004 | 0.265 |
| 70.69004 | 0.266 |
| 70.70004 | 0.266 |
| 70.71004 | 0.265 |
| 70.72004 | 0.264 |
| 70.73004 | 0.261 |
| 70.74004 | 0.258 |
| 70.75004 | 0.254 |
| 70.76004 | 0.251 |
| 70.77003 | 0.247 |
| 70.78004 | 0.243 |
| 70.79004 | 0.24 |
| 70.80004 | 0.237 |
| 70.81004 | 0.235 |
| 70.82004 | 0.234 |
| 70.83004 | 0.233 |
| 70.84003 | 0.233 |
| 70.85004 | 0.235 |
| 70.86004 | 0.238 |
| 70.87004 | 0.241 |
| 70.88004 | 0.245 |
| 70.89004 | 0.248 |
| 70.90004 | 0.251 |
| 70.91004 | 0.254 |
| 70.92004 | 0.255 |
| 70.93004 | 0.256 |
| 70.94004 | 0.257 |
| 70.95004 | 0.257 |
| 70.96004 | 0.256 |
| 70.97004 | 0.256 |
| 70.98004 | 0.255 |
| 70.99004 | 0.254 |
| 71.00004 | 0.253 |
| 71.01004 | 0.253 |
| 71.02003 | 0.254 |
| 71.03004 | 0.255 |
| 71.04004 | 0.256 |
| 71.05004 | 0.258 |
| 71.06004 | 0.259 |
| 71.07004 | 0.259 |
| 71.08004 | 0.259 |
| 71.09003 | 0.258 |
| 71.10004 | 0.257 |
| 71.11004 | 0.257 |
| 71.12004 | 0.256 |
| 71.13004 | 0.256 |
| 71.14004 | 0.256 |
| 71.15004 | 0.256 |
| 71.16004 | 0.256 |
| 71.17004 | 0.254 |
| 71.18004 | 0.252 |
| 71.19004 | 0.25 |
| 71.20004 | 0.247 |
| 71.21004 | 0.244 |
| 71.22004 | 0.242 |
| 71.23004 | 0.242 |
| 71.24004 | 0.242 |
| 71.25004 | 0.243 |
| 71.26004 | 0.245 |
| 71.27003 | 0.248 |
| 71.28004 | 0.251 |
| 71.29004 | 0.254 |
| 71.30004 | 0.257 |
| 71.31004 | 0.26 |
| 71.32004 | 0.261 |
| 71.33004 | 0.261 |
| 71.34003 | 0.26 |
| 71.35004 | 0.257 |
| 71.36004 | 0.254 |
| 71.37004 | 0.25 |
| 71.38004 | 0.247 |
| 71.39004 | 0.245 |
| 71.40004 | 0.244 |
| 71.41004 | 0.245 |
| 71.42004 | 0.248 |
| 71.43004 | 0.251 |
| 71.44004 | 0.255 |
| 71.45004 | 0.258 |
| 71.46004 | 0.26 |
| 71.47004 | 0.26 |
| 71.48004 | 0.26 |
| 71.49004 | 0.26 |
| 71.50004 | 0.26 |
| 71.51004 | 0.26 |
| 71.52003 | 0.26 |
| 71.53004 | 0.261 |
| 71.54004 | 0.263 |
| 71.55004 | 0.264 |
| 71.56004 | 0.265 |
| 71.57004 | 0.265 |
| 71.58004 | 0.264 |
| 71.59004 | 0.262 |
| 71.60004 | 0.261 |
| 71.61004 | 0.259 |
| 71.62004 | 0.257 |
| 71.63004 | 0.256 |
| 71.64004 | 0.256 |
| 71.65004 | 0.256 |
| 71.66004 | 0.257 |
| 71.67004 | 0.258 |
| 71.68004 | 0.26 |
| 71.69004 | 0.261 |
| 71.70004 | 0.262 |
| 71.71004 | 0.262 |
| 71.72004 | 0.261 |
| 71.73004 | 0.259 |
| 71.74004 | 0.257 |
| 71.75004 | 0.255 |
| 71.76004 | 0.253 |
| 71.77003 | 0.251 |
| 71.78004 | 0.25 |
| 71.79004 | 0.249 |
| 71.80004 | 0.249 |
| 71.81004 | 0.25 |
| 71.82004 | 0.251 |
| 71.83004 | 0.252 |
| 71.84004 | 0.254 |
| 71.85004 | 0.254 |
| 71.86004 | 0.254 |
| 71.87004 | 0.252 |
| 71.88004 | 0.25 |
| 71.89004 | 0.248 |
| 71.90004 | 0.245 |
| 71.91004 | 0.243 |
| 71.92004 | 0.242 |
| 71.93004 | 0.242 |
| 71.94004 | 0.244 |
| 71.95004 | 0.246 |
| 71.96004 | 0.249 |
| 71.97004 | 0.252 |
| 71.98004 | 0.254 |
| 71.99004 | 0.256 |
| 72.00004 | 0.256 |
| 72.01004 | 0.256 |
| 72.02004 | 0.255 |
| 72.03004 | 0.254 |
| 72.04004 | 0.254 |
| 72.05004 | 0.254 |
| 72.06004 | 0.254 |
| 72.07004 | 0.256 |
| 72.08004 | 0.257 |
| 72.09004 | 0.259 |
| 72.10004 | 0.261 |
| 72.11004 | 0.264 |
| 72.12004 | 0.267 |
| 72.13004 | 0.269 |
| 72.14004 | 0.271 |
| 72.15004 | 0.272 |
| 72.16004 | 0.272 |
| 72.17004 | 0.271 |
| 72.18004 | 0.269 |
| 72.19004 | 0.267 |
| 72.20004 | 0.264 |
| 72.21004 | 0.263 |
| 72.22004 | 0.262 |
| 72.23004 | 0.261 |
| 72.24004 | 0.261 |
| 72.25004 | 0.261 |
| 72.26004 | 0.261 |
| 72.27004 | 0.261 |
| 72.28004 | 0.261 |
| 72.29004 | 0.26 |
| 72.30004 | 0.259 |
| 72.31004 | 0.258 |
| 72.32004 | 0.257 |
| 72.33004 | 0.257 |
| 72.34004 | 0.256 |
| 72.35004 | 0.256 |
| 72.36004 | 0.255 |
| 72.37004 | 0.255 |
| 72.38004 | 0.255 |
| 72.39004 | 0.255 |
| 72.40004 | 0.255 |
| 72.41004 | 0.256 |
| 72.42004 | 0.256 |
| 72.43004 | 0.257 |
| 72.44004 | 0.257 |
| 72.45004 | 0.256 |
| 72.46004 | 0.256 |
| 72.47004 | 0.255 |
| 72.48004 | 0.254 |
| 72.49004 | 0.254 |
| 72.50004 | 0.254 |
| 72.51004 | 0.255 |
| 72.52004 | 0.256 |
| 72.53004 | 0.258 |
| 72.54004 | 0.26 |
| 72.55004 | 0.262 |
| 72.56004 | 0.264 |
| 72.57004 | 0.266 |
| 72.58004 | 0.266 |
| 72.59004 | 0.267 |
| 72.60004 | 0.266 |
| 72.61004 | 0.264 |
| 72.62004 | 0.262 |
| 72.63004 | 0.259 |
| 72.64004 | 0.256 |
| 72.65004 | 0.254 |
| 72.66004 | 0.253 |
| 72.67004 | 0.254 |
| 72.68004 | 0.255 |
| 72.69004 | 0.256 |
| 72.70004 | 0.258 |
| 72.71004 | 0.259 |
| 72.72004 | 0.259 |
| 72.73004 | 0.258 |
| 72.74004 | 0.255 |
| 72.75004 | 0.251 |
| 72.76004 | 0.247 |
| 72.77004 | 0.244 |
| 72.78004 | 0.241 |
| 72.79004 | 0.239 |
| 72.80004 | 0.238 |
| 72.81004 | 0.238 |
| 72.82004 | 0.239 |
| 72.83004 | 0.239 |
| 72.84004 | 0.24 |
| 72.85004 | 0.24 |
| 72.86004 | 0.24 |
| 72.87004 | 0.24 |
| 72.88004 | 0.241 |
| 72.89004 | 0.242 |
| 72.90004 | 0.243 |
| 72.91004 | 0.244 |
| 72.92004 | 0.246 |
| 72.93004 | 0.248 |
| 72.94004 | 0.249 |
| 72.95004 | 0.25 |
| 72.96004 | 0.251 |
| 72.97004 | 0.251 |
| 72.98004 | 0.25 |
| 72.99004 | 0.25 |
| 73.00004 | 0.249 |
| 73.01004 | 0.248 |
| 73.02004 | 0.248 |
| 73.03004 | 0.248 |
| 73.04004 | 0.249 |
| 73.05004 | 0.251 |
| 73.06004 | 0.252 |
| 73.07004 | 0.254 |
| 73.08004 | 0.256 |
| 73.09004 | 0.258 |
| 73.10004 | 0.261 |
| 73.11004 | 0.263 |
| 73.12004 | 0.264 |
| 73.13004 | 0.265 |
| 73.14004 | 0.266 |
| 73.15004 | 0.265 |
| 73.16004 | 0.265 |
| 73.17004 | 0.265 |
| 73.18004 | 0.265 |
| 73.19004 | 0.266 |
| 73.20004 | 0.267 |
| 73.21004 | 0.269 |
| 73.22004 | 0.271 |
| 73.23004 | 0.272 |
| 73.24004 | 0.272 |
| 73.25004 | 0.271 |
| 73.26004 | 0.268 |
| 73.27004 | 0.264 |
| 73.28004 | 0.26 |
| 73.29004 | 0.256 |
| 73.30004 | 0.252 |
| 73.31004 | 0.25 |
| 73.32004 | 0.249 |
| 73.33004 | 0.248 |
| 73.34004 | 0.248 |
| 73.35004 | 0.248 |
| 73.36004 | 0.248 |
| 73.37004 | 0.247 |
| 73.38004 | 0.246 |
| 73.39004 | 0.244 |
| 73.40004 | 0.242 |
| 73.41004 | 0.24 |
| 73.42004 | 0.239 |
| 73.43004 | 0.237 |
| 73.44004 | 0.236 |
| 73.45004 | 0.234 |
| 73.46004 | 0.234 |
| 73.47004 | 0.234 |
| 73.48004 | 0.234 |
| 73.49004 | 0.235 |
| 73.50004 | 0.236 |
| 73.51004 | 0.238 |
| 73.52004 | 0.239 |
| 73.53004 | 0.24 |
| 73.54004 | 0.241 |
| 73.55004 | 0.242 |
| 73.56004 | 0.242 |
| 73.57004 | 0.242 |
| 73.58004 | 0.243 |
| 73.59004 | 0.244 |
| 73.60004 | 0.245 |
| 73.61004 | 0.246 |
| 73.62004 | 0.247 |
| 73.63004 | 0.249 |
| 73.64004 | 0.25 |
| 73.65004 | 0.251 |
| 73.66004 | 0.252 |
| 73.67004 | 0.253 |
| 73.68004 | 0.253 |
| 73.69004 | 0.254 |
| 73.70004 | 0.254 |
| 73.71004 | 0.253 |
| 73.72004 | 0.252 |
| 73.73004 | 0.251 |
| 73.74004 | 0.25 |
| 73.75004 | 0.248 |
| 73.76004 | 0.247 |
| 73.77004 | 0.246 |
| 73.78004 | 0.246 |
| 73.79004 | 0.246 |
| 73.80004 | 0.248 |
| 73.81004 | 0.249 |
| 73.82004 | 0.251 |
| 73.83004 | 0.252 |
| 73.84004 | 0.253 |
| 73.85004 | 0.254 |
| 73.86004 | 0.253 |
| 73.87004 | 0.253 |
| 73.88004 | 0.252 |
| 73.89004 | 0.25 |
| 73.90004 | 0.249 |
| 73.91004 | 0.248 |
| 73.92004 | 0.247 |
| 73.93004 | 0.247 |
| 73.94004 | 0.248 |
| 73.95004 | 0.25 |
| 73.96004 | 0.252 |
| 73.97004 | 0.254 |
| 73.98004 | 0.256 |
| 73.99004 | 0.258 |
| 74.00004 | 0.258 |
| 74.01004 | 0.258 |
| 74.02004 | 0.257 |
| 74.03004 | 0.256 |
| 74.04004 | 0.255 |
| 74.05004 | 0.255 |
| 74.06004 | 0.256 |
| 74.07004 | 0.257 |
| 74.08004 | 0.259 |
| 74.09004 | 0.261 |
| 74.10004 | 0.262 |
| 74.11004 | 0.263 |
| 74.12004 | 0.263 |
| 74.13004 | 0.262 |
| 74.14004 | 0.262 |
| 74.15004 | 0.261 |
| 74.16004 | 0.261 |
| 74.17004 | 0.261 |
| 74.18004 | 0.262 |
| 74.19004 | 0.262 |
| 74.20004 | 0.262 |
| 74.21004 | 0.263 |
| 74.22004 | 0.262 |
| 74.23004 | 0.262 |
| 74.24004 | 0.261 |
| 74.25004 | 0.26 |
| 74.26004 | 0.259 |
| 74.27004 | 0.258 |
| 74.28004 | 0.258 |
| 74.29004 | 0.258 |
| 74.30004 | 0.257 |
| 74.31004 | 0.257 |
| 74.32004 | 0.257 |
| 74.33004 | 0.256 |
| 74.34004 | 0.256 |
| 74.35004 | 0.256 |
| 74.36004 | 0.257 |
| 74.37004 | 0.258 |
| 74.38004 | 0.259 |
| 74.39004 | 0.26 |
| 74.40004 | 0.259 |
| 74.41004 | 0.258 |
| 74.42004 | 0.256 |
| 74.43004 | 0.253 |
| 74.44004 | 0.25 |
| 74.45004 | 0.247 |
| 74.46004 | 0.245 |
| 74.47004 | 0.244 |
| 74.48004 | 0.244 |
| 74.49004 | 0.245 |
| 74.50004 | 0.246 |
| 74.51004 | 0.246 |
| 74.52004 | 0.246 |
| 74.53004 | 0.246 |
| 74.54004 | 0.245 |
| 74.55004 | 0.244 |
| 74.56004 | 0.244 |
| 74.57004 | 0.244 |
| 74.58004 | 0.245 |
| 74.59004 | 0.247 |
| 74.60004 | 0.25 |
| 74.61004 | 0.253 |
| 74.62004 | 0.256 |
| 74.63004 | 0.259 |
| 74.64004 | 0.261 |
| 74.65004 | 0.264 |
| 74.66004 | 0.266 |
| 74.67004 | 0.267 |
| 74.68004 | 0.269 |
| 74.69004 | 0.27 |
| 74.70004 | 0.271 |
| 74.71004 | 0.271 |
| 74.72004 | 0.271 |
| 74.73004 | 0.27 |
| 74.74004 | 0.269 |
| 74.75004 | 0.268 |
| 74.76004 | 0.266 |
| 74.77004 | 0.266 |
| 74.78004 | 0.266 |
| 74.79004 | 0.266 |
| 74.80004 | 0.266 |
| 74.81004 | 0.267 |
| 74.82004 | 0.267 |
| 74.83004 | 0.268 |
| 74.84004 | 0.268 |
| 74.85004 | 0.267 |
| 74.86004 | 0.267 |
| 74.87004 | 0.266 |
| 74.88004 | 0.265 |
| 74.89004 | 0.264 |
| 74.90004 | 0.264 |
| 74.91004 | 0.263 |
| 74.92004 | 0.263 |
| 74.93004 | 0.262 |
| 74.94004 | 0.262 |
| 74.95004 | 0.261 |
| 74.96004 | 0.26 |
| 74.97004 | 0.259 |
| 74.98004 | 0.258 |
| 74.99004 | 0.257 |
| 75.00004 | 0.257 |
| 75.01004 | 0.257 |
| 75.02004 | 0.257 |
| 75.03004 | 0.258 |
| 75.04004 | 0.259 |
| 75.05004 | 0.26 |
| 75.06004 | 0.262 |
| 75.07004 | 0.262 |
| 75.08004 | 0.263 |
| 75.09004 | 0.262 |
| 75.10004 | 0.262 |
| 75.11004 | 0.261 |
| 75.12004 | 0.26 |
| 75.13004 | 0.258 |
| 75.14004 | 0.257 |
| 75.15004 | 0.255 |
| 75.16004 | 0.254 |
| 75.17004 | 0.252 |
| 75.18004 | 0.251 |
| 75.19004 | 0.251 |
| 75.20004 | 0.251 |
| 75.21004 | 0.252 |
| 75.22004 | 0.253 |
| 75.23004 | 0.255 |
| 75.24004 | 0.256 |
| 75.25004 | 0.257 |
| 75.26004 | 0.257 |
| 75.27004 | 0.256 |
| 75.28004 | 0.254 |
| 75.29004 | 0.252 |
| 75.30004 | 0.25 |
| 75.31004 | 0.248 |
| 75.32004 | 0.247 |
| 75.33004 | 0.247 |
| 75.34004 | 0.247 |
| 75.35004 | 0.247 |
| 75.36004 | 0.247 |
| 75.37004 | 0.247 |
| 75.38004 | 0.246 |
| 75.39004 | 0.246 |
| 75.40004 | 0.245 |
| 75.41004 | 0.244 |
| 75.42004 | 0.244 |
| 75.43004 | 0.244 |
| 75.44004 | 0.246 |
| 75.45004 | 0.247 |
| 75.46004 | 0.249 |
| 75.47004 | 0.251 |
| 75.48004 | 0.252 |
| 75.49004 | 0.253 |
| 75.50004 | 0.254 |
| 75.51004 | 0.253 |
| 75.52004 | 0.253 |
| 75.53004 | 0.252 |
| 75.54004 | 0.252 |
| 75.55004 | 0.252 |
| 75.56004 | 0.253 |
| 75.57004 | 0.254 |
| 75.58004 | 0.256 |
| 75.59004 | 0.257 |
| 75.60004 | 0.258 |
| 75.61004 | 0.259 |
| 75.62004 | 0.26 |
| 75.63004 | 0.26 |
| 75.64004 | 0.26 |
| 75.65004 | 0.259 |
| 75.66004 | 0.259 |
| 75.67004 | 0.258 |
| 75.68004 | 0.257 |
| 75.69004 | 0.256 |
| 75.70004 | 0.255 |
| 75.71004 | 0.254 |
| 75.72004 | 0.253 |
| 75.73004 | 0.254 |
| 75.74004 | 0.254 |
| 75.75004 | 0.256 |
| 75.76004 | 0.258 |
| 75.77004 | 0.26 |
| 75.78004 | 0.261 |
| 75.79004 | 0.262 |
| 75.80004 | 0.262 |
| 75.81004 | 0.261 |
| 75.82004 | 0.26 |
| 75.83004 | 0.259 |
| 75.84004 | 0.258 |
| 75.85004 | 0.258 |
| 75.86004 | 0.258 |
| 75.87004 | 0.258 |
| 75.88004 | 0.258 |
| 75.89004 | 0.259 |
| 75.90004 | 0.258 |
| 75.91004 | 0.258 |
| 75.92004 | 0.257 |
| 75.93004 | 0.255 |
| 75.94004 | 0.253 |
| 75.95004 | 0.25 |
| 75.96004 | 0.248 |
| 75.97004 | 0.246 |
| 75.98004 | 0.245 |
| 75.99004 | 0.244 |
| 76.00004 | 0.244 |
| 76.01004 | 0.244 |
| 76.02004 | 0.245 |
| 76.03004 | 0.247 |
| 76.04004 | 0.248 |
| 76.05004 | 0.249 |
| 76.06004 | 0.25 |
| 76.07004 | 0.25 |
| 76.08004 | 0.25 |
| 76.09004 | 0.25 |
| 76.10004 | 0.25 |
| 76.11004 | 0.25 |
| 76.12004 | 0.251 |
| 76.13004 | 0.251 |
| 76.14004 | 0.251 |
| 76.15004 | 0.251 |
| 76.16004 | 0.251 |
| 76.17004 | 0.251 |
| 76.18004 | 0.251 |
| 76.19004 | 0.252 |
| 76.20004 | 0.252 |
| 76.21004 | 0.252 |
| 76.22004 | 0.253 |
| 76.23004 | 0.253 |
| 76.24004 | 0.253 |
| 76.25004 | 0.253 |
| 76.26004 | 0.252 |
| 76.27004 | 0.252 |
| 76.28004 | 0.252 |
| 76.29004 | 0.253 |
| 76.30004 | 0.254 |
| 76.31004 | 0.254 |
| 76.32004 | 0.255 |
| 76.33004 | 0.255 |
| 76.34004 | 0.255 |
| 76.35004 | 0.255 |
| 76.36004 | 0.255 |
| 76.37004 | 0.255 |
| 76.38004 | 0.254 |
| 76.39004 | 0.254 |
| 76.40004 | 0.253 |
| 76.41004 | 0.253 |
| 76.42004 | 0.252 |
| 76.43004 | 0.252 |
| 76.44004 | 0.251 |
| 76.45004 | 0.251 |
| 76.46004 | 0.251 |
| 76.47004 | 0.252 |
| 76.48004 | 0.253 |
| 76.49004 | 0.254 |
| 76.50004 | 0.255 |
| 76.51004 | 0.255 |
| 76.52004 | 0.256 |
| 76.53004 | 0.256 |
| 76.54004 | 0.255 |
| 76.55004 | 0.254 |
| 76.56004 | 0.253 |
| 76.57004 | 0.253 |
| 76.58004 | 0.253 |
| 76.59004 | 0.253 |
| 76.60004 | 0.254 |
| 76.61004 | 0.255 |
| 76.62004 | 0.257 |
| 76.63004 | 0.258 |
| 76.64004 | 0.259 |
| 76.65004 | 0.26 |
| 76.66004 | 0.26 |
| 76.67004 | 0.26 |
| 76.68004 | 0.26 |
| 76.69004 | 0.26 |
| 76.70004 | 0.26 |
| 76.71004 | 0.26 |
| 76.72004 | 0.26 |
| 76.73004 | 0.26 |
| 76.74004 | 0.261 |
| 76.75004 | 0.261 |
| 76.76004 | 0.261 |
| 76.77004 | 0.261 |
| 76.78004 | 0.26 |
| 76.79004 | 0.258 |
| 76.80004 | 0.257 |
| 76.81004 | 0.256 |
| 76.82004 | 0.255 |
| 76.83004 | 0.255 |
| 76.84004 | 0.256 |
| 76.85004 | 0.256 |
| 76.86004 | 0.257 |
| 76.87004 | 0.258 |
| 76.88004 | 0.258 |
| 76.89004 | 0.257 |
| 76.90004 | 0.256 |
| 76.91004 | 0.254 |
| 76.92004 | 0.253 |
| 76.93004 | 0.251 |
| 76.94004 | 0.25 |
| 76.95004 | 0.249 |
| 76.96004 | 0.249 |
| 76.97004 | 0.248 |
| 76.98004 | 0.248 |
| 76.99004 | 0.247 |
| 77.00004 | 0.247 |
| 77.01004 | 0.246 |
| 77.02004 | 0.246 |
| 77.03004 | 0.245 |
| 77.04004 | 0.245 |
| 77.05004 | 0.244 |
| 77.06004 | 0.244 |
| 77.07004 | 0.244 |
| 77.08004 | 0.244 |
| 77.09004 | 0.244 |
| 77.10004 | 0.245 |
| 77.11004 | 0.246 |
| 77.12004 | 0.248 |
| 77.13004 | 0.25 |
| 77.14005 | 0.251 |
| 77.15004 | 0.253 |
| 77.16004 | 0.254 |
| 77.17004 | 0.255 |
| 77.18004 | 0.255 |
| 77.19004 | 0.256 |
| 77.20004 | 0.256 |
| 77.21004 | 0.256 |
| 77.22004 | 0.256 |
| 77.23004 | 0.257 |
| 77.24004 | 0.258 |
| 77.25004 | 0.258 |
| 77.26004 | 0.259 |
| 77.27004 | 0.26 |
| 77.28004 | 0.26 |
| 77.29004 | 0.26 |
| 77.30004 | 0.26 |
| 77.31004 | 0.26 |
| 77.32004 | 0.259 |
| 77.33004 | 0.258 |
| 77.34004 | 0.257 |
| 77.35004 | 0.256 |
| 77.36004 | 0.256 |
| 77.37004 | 0.255 |
| 77.38004 | 0.255 |
| 77.39005 | 0.256 |
| 77.40004 | 0.256 |
| 77.41004 | 0.257 |
| 77.42004 | 0.258 |
| 77.43004 | 0.258 |
| 77.44004 | 0.258 |
| 77.45004 | 0.257 |
| 77.46004 | 0.256 |
| 77.47004 | 0.256 |
| 77.48004 | 0.255 |
| 77.49004 | 0.255 |
| 77.50004 | 0.255 |
| 77.51004 | 0.254 |
| 77.52004 | 0.254 |
| 77.53004 | 0.254 |
| 77.54004 | 0.253 |
| 77.55004 | 0.253 |
| 77.56004 | 0.254 |
| 77.57004 | 0.254 |
| 77.58004 | 0.255 |
| 77.59004 | 0.256 |
| 77.60004 | 0.258 |
| 77.61004 | 0.258 |
| 77.62004 | 0.258 |
| 77.63004 | 0.258 |
| 77.64005 | 0.258 |
| 77.65004 | 0.257 |
| 77.66004 | 0.256 |
| 77.67004 | 0.255 |
| 77.68004 | 0.254 |
| 77.69004 | 0.254 |
| 77.70004 | 0.254 |
| 77.71004 | 0.255 |
| 77.72004 | 0.256 |
| 77.73004 | 0.256 |
| 77.74004 | 0.257 |
| 77.75004 | 0.258 |
| 77.76004 | 0.259 |
| 77.77004 | 0.26 |
| 77.78004 | 0.26 |
| 77.79004 | 0.261 |
| 77.80004 | 0.261 |
| 77.81004 | 0.26 |
| 77.82005 | 0.26 |
| 77.83004 | 0.26 |
| 77.84004 | 0.259 |
| 77.85004 | 0.259 |
| 77.86004 | 0.259 |
| 77.87004 | 0.259 |
| 77.88004 | 0.259 |
| 77.89005 | 0.259 |
| 77.90004 | 0.259 |
| 77.91004 | 0.258 |
| 77.92004 | 0.257 |
| 77.93004 | 0.255 |
| 77.94004 | 0.254 |
| 77.95004 | 0.253 |
| 77.96004 | 0.252 |
| 77.97004 | 0.251 |
| 77.98004 | 0.251 |
| 77.99004 | 0.25 |
| 78.00004 | 0.251 |
| 78.01004 | 0.251 |
| 78.02004 | 0.251 |
| 78.03004 | 0.251 |
| 78.04004 | 0.251 |
| 78.05004 | 0.251 |
| 78.06004 | 0.25 |
| 78.07005 | 0.25 |
| 78.08004 | 0.25 |
| 78.09004 | 0.249 |
| 78.10004 | 0.25 |
| 78.11004 | 0.25 |
| 78.12004 | 0.25 |
| 78.13004 | 0.251 |
| 78.14005 | 0.252 |
| 78.15004 | 0.253 |
| 78.16004 | 0.254 |
| 78.17004 | 0.254 |
| 78.18004 | 0.254 |
| 78.19004 | 0.254 |
| 78.20004 | 0.253 |
| 78.21004 | 0.253 |
| 78.22004 | 0.253 |
| 78.23004 | 0.253 |
| 78.24004 | 0.253 |
| 78.25005 | 0.254 |
| 78.26004 | 0.255 |
| 78.27004 | 0.255 |
| 78.28004 | 0.256 |
| 78.29004 | 0.257 |
| 78.30004 | 0.257 |
| 78.31004 | 0.258 |
| 78.32005 | 0.259 |
| 78.33004 | 0.26 |
| 78.34004 | 0.26 |
| 78.35004 | 0.261 |
| 78.36004 | 0.262 |
| 78.37004 | 0.263 |
| 78.38004 | 0.263 |
| 78.39005 | 0.263 |
| 78.40004 | 0.263 |
| 78.41004 | 0.261 |
| 78.42004 | 0.259 |
| 78.43004 | 0.257 |
| 78.44004 | 0.255 |
| 78.45004 | 0.254 |
| 78.46004 | 0.253 |
| 78.47004 | 0.253 |
| 78.48004 | 0.254 |
| 78.49004 | 0.255 |
| 78.50005 | 0.256 |
| 78.51004 | 0.256 |
| 78.52004 | 0.254 |
| 78.53004 | 0.252 |
| 78.54004 | 0.25 |
| 78.55004 | 0.247 |
| 78.56004 | 0.246 |
| 78.57005 | 0.245 |
| 78.58004 | 0.246 |
| 78.59004 | 0.247 |
| 78.60004 | 0.249 |
| 78.61004 | 0.252 |
| 78.62004 | 0.254 |
| 78.63004 | 0.255 |
| 78.64005 | 0.256 |
| 78.65004 | 0.257 |
| 78.66004 | 0.257 |
| 78.67004 | 0.258 |
| 78.68004 | 0.258 |
| 78.69004 | 0.259 |
| 78.70004 | 0.259 |
| 78.71004 | 0.26 |
| 78.72004 | 0.259 |
| 78.73004 | 0.256 |
| 78.74004 | 0.253 |
| 78.75005 | 0.249 |
| 78.76004 | 0.245 |
| 78.77004 | 0.242 |
| 78.78004 | 0.242 |
| 78.79004 | 0.243 |
| 78.80004 | 0.248 |
| 78.81004 | 0.254 |
| 78.82005 | 0.261 |
| 78.83004 | 0.267 |
| 78.84004 | 0.271 |
| 78.85004 | 0.271 |
| 78.86004 | 0.268 |
| 78.87004 | 0.262 |
| 78.88004 | 0.252 |
| 78.89005 | 0.243 |
| 78.90004 | 0.234 |
| 78.91004 | 0.227 |
| 78.92004 | 0.224 |
| 78.93005 | 0.226 |
| 78.94004 | 0.231 |
| 78.95004 | 0.239 |
| 78.96004 | 0.248 |
| 78.97004 | 0.255 |
| 78.98004 | 0.26 |
| 78.99004 | 0.259 |
| 79.00005 | 0.254 |
| 79.01004 | 0.245 |
| 79.02004 | 0.234 |
| 79.03004 | 0.222 |
| 79.04004 | 0.214 |
| 79.05004 | 0.21 |
| 79.06004 | 0.21 |
| 79.07005 | 0.216 |
| 79.08004 | 0.225 |
| 79.09004 | 0.237 |
| 79.10004 | 0.249 |
| 79.11004 | 0.261 |
| 79.12004 | 0.272 |
| 79.13004 | 0.281 |
| 79.14005 | 0.289 |
| 79.15004 | 0.296 |
| 79.16004 | 0.301 |
| 79.17004 | 0.304 |
| 79.18005 | 0.304 |
| 79.19004 | 0.302 |
| 79.20004 | 0.298 |
| 79.21004 | 0.293 |
| 79.22004 | 0.289 |
| 79.23004 | 0.287 |
| 79.24004 | 0.286 |
| 79.25005 | 0.287 |
| 79.26004 | 0.287 |
| 79.27004 | 0.285 |
| 79.28004 | 0.278 |
| 79.29004 | 0.265 |
| 79.30004 | 0.248 |
| 79.31004 | 0.23 |
| 79.32005 | 0.214 |
| 79.33004 | 0.204 |
| 79.34004 | 0.204 |
| 79.35004 | 0.213 |
| 79.36005 | 0.231 |
| 79.37004 | 0.252 |
| 79.38004 | 0.271 |
| 79.39005 | 0.284 |
| 79.40004 | 0.287 |
| 79.41004 | 0.28 |
| 79.42004 | 0.266 |
| 79.43005 | 0.251 |
| 79.44004 | 0.24 |
| 79.45004 | 0.237 |
| 79.46004 | 0.245 |
| 79.47004 | 0.262 |
| 79.48004 | 0.282 |
| 79.49004 | 0.299 |
| 79.50005 | 0.306 |
| 79.51004 | 0.296 |
| 79.52004 | 0.271 |
| 79.53004 | 0.231 |
| 79.54004 | 0.184 |
| 79.55004 | 0.138 |
| 79.56004 | 0.104 |
| 79.57005 | 0.087 |
| 79.58004 | 0.092 |
| 79.59004 | 0.117 |
| 79.60004 | 0.158 |
| 79.61005 | 0.207 |
| 79.62004 | 0.254 |
| 79.63004 | 0.291 |
| 79.64005 | 0.314 |
| 79.65004 | 0.32 |
| 79.66004 | 0.314 |
| 79.67004 | 0.301 |
| 79.68005 | 0.29 |
| 79.69004 | 0.287 |
| 79.70004 | 0.297 |
| 79.71004 | 0.32 |
| 79.72004 | 0.352 |
| 79.73004 | 0.387 |
| 79.74004 | 0.416 |
| 79.75005 | 0.43 |
| 79.76004 | 0.425 |
| 79.77004 | 0.399 |
| 79.78004 | 0.354 |
| 79.79004 | 0.297 |
| 79.80004 | 0.236 |
| 79.81004 | 0.181 |
| 79.82005 | 0.139 |
| 79.83004 | 0.117 |
| 79.84004 | 0.116 |
| 79.85004 | 0.132 |
| 79.86005 | 0.161 |
| 79.87004 | 0.192 |
| 79.88004 | 0.218 |
| 79.89005 | 0.233 |
| 79.90004 | 0.236 |
| 79.91004 | 0.229 |
| 79.92004 | 0.219 |
| 79.93005 | 0.216 |
| 79.94004 | 0.226 |
| 79.95004 | 0.25 |
| 79.96004 | 0.288 |
| 79.97004 | 0.329 |
| 79.98004 | 0.366 |
| 79.99004 | 0.387 |
| 80.00005 | 0.386 |
| 80.01004 | 0.365 |
| 80.02004 | 0.327 |
| 80.03004 | 0.281 |
| 80.04005 | 0.236 |
| 80.05004 | 0.201 |
| 80.06004 | 0.179 |
| 80.07005 | 0.168 |
| 80.08004 | 0.166 |
| 80.09004 | 0.166 |
| 80.10004 | 0.166 |
| 80.11005 | 0.163 |
| 80.12004 | 0.159 |
| 80.13004 | 0.157 |
| 80.14005 | 0.162 |
| 80.15004 | 0.178 |
| 80.16004 | 0.206 |
| 80.17004 | 0.248 |
| 80.18005 | 0.299 |
| 80.19004 | 0.355 |
| 80.20004 | 0.408 |
| 80.21004 | 0.447 |
| 80.22004 | 0.467 |
| 80.23004 | 0.46 |
| 80.24004 | 0.428 |
| 80.25005 | 0.376 |
| 80.26004 | 0.312 |
| 80.27004 | 0.251 |
| 80.28004 | 0.202 |
| 80.29005 | 0.175 |
| 80.30004 | 0.17 |
| 80.31004 | 0.183 |
| 80.32005 | 0.203 |
| 80.33004 | 0.218 |
| 80.34004 | 0.222 |
| 80.35004 | 0.212 |
| 80.36005 | 0.193 |
| 80.37004 | 0.177 |
| 80.38004 | 0.174 |
| 80.39005 | 0.195 |
| 80.40004 | 0.238 |
| 80.41004 | 0.298 |
| 80.42004 | 0.36 |
| 80.43005 | 0.405 |
| 80.44004 | 0.421 |
| 80.45004 | 0.402 |
| 80.46004 | 0.35 |
| 80.47004 | 0.281 |
| 80.48004 | 0.211 |
| 80.49004 | 0.156 |
| 80.50005 | 0.127 |
| 80.51004 | 0.124 |
| 80.52004 | 0.137 |
| 80.53004 | 0.152 |
| 80.54005 | 0.157 |
| 80.55004 | 0.145 |
| 80.56004 | 0.12 |
| 80.57005 | 0.092 |
| 80.58004 | 0.08 |
| 80.59004 | 0.099 |
| 80.60004 | 0.155 |
| 80.61005 | 0.245 |
| 80.62004 | 0.352 |
| 80.63004 | 0.452 |
| 80.64005 | 0.523 |
| 80.65004 | 0.548 |
| 80.66004 | 0.524 |
| 80.67004 | 0.459 |
| 80.68005 | 0.375 |
| 80.69004 | 0.292 |
| 80.70004 | 0.229 |
| 80.71004 | 0.196 |
| 80.72005 | 0.188 |
| 80.73004 | 0.196 |
| 80.74004 | 0.204 |
| 80.75005 | 0.202 |
| 80.76004 | 0.185 |
| 80.77004 | 0.158 |
| 80.78004 | 0.136 |
| 80.79005 | 0.13 |
| 80.80004 | 0.15 |
| 80.81004 | 0.199 |
| 80.82005 | 0.266 |
| 80.83004 | 0.337 |
| 80.84004 | 0.394 |
| 80.85004 | 0.422 |
| 80.86005 | 0.419 |
| 80.87004 | 0.387 |
| 80.88004 | 0.338 |
| 80.89005 | 0.286 |
| 80.90004 | 0.243 |
| 80.91004 | 0.215 |
| 80.92004 | 0.2 |
| 80.93005 | 0.191 |
| 80.94004 | 0.18 |
| 80.95004 | 0.162 |
| 80.96004 | 0.139 |
| 80.97005 | 0.119 |
| 80.98004 | 0.111 |
| 80.99004 | 0.124 |
| 81.00005 | 0.163 |
| 81.01004 | 0.221 |
| 81.02004 | 0.287 |
| 81.03004 | 0.345 |
| 81.04005 | 0.383 |
| 81.05004 | 0.391 |
| 81.06004 | 0.37 |
| 81.07005 | 0.33 |
| 81.08004 | 0.284 |
| 81.09004 | 0.246 |
| 81.10004 | 0.226 |
| 81.11005 | 0.227 |
| 81.12004 | 0.244 |
| 81.13004 | 0.268 |
| 81.14005 | 0.289 |
| 81.15005 | 0.298 |
| 81.16004 | 0.292 |
| 81.17004 | 0.275 |
| 81.18005 | 0.252 |
| 81.19004 | 0.233 |
| 81.20004 | 0.223 |
| 81.21004 | 0.225 |
| 81.22005 | 0.238 |
| 81.23004 | 0.254 |
| 81.24004 | 0.267 |
| 81.25005 | 0.27 |
| 81.26004 | 0.262 |
| 81.27004 | 0.244 |
| 81.28004 | 0.223 |
| 81.29005 | 0.208 |
| 81.30004 | 0.204 |
| 81.31004 | 0.216 |
| 81.32005 | 0.238 |
| 81.33004 | 0.262 |
| 81.34004 | 0.277 |
| 81.35004 | 0.276 |
| 81.36005 | 0.254 |
| 81.37004 | 0.215 |
| 81.38004 | 0.171 |
| 81.39005 | 0.134 |
| 81.40005 | 0.116 |
| 81.41004 | 0.121 |
| 81.42004 | 0.149 |
| 81.43005 | 0.192 |
| 81.44004 | 0.242 |
| 81.45004 | 0.29 |
| 81.46004 | 0.335 |
| 81.47005 | 0.378 |
| 81.48004 | 0.419 |
| 81.49004 | 0.458 |
| 81.50005 | 0.488 |
| 81.51004 | 0.498 |
| 81.52004 | 0.476 |
| 81.53004 | 0.415 |
| 81.54005 | 0.318 |
| 81.55004 | 0.2 |
| 81.56004 | 0.084 |
| 81.57005 | -0.006 |
| 81.58004 | -0.05 |
| 81.59004 | -0.041 |
| 81.60004 | 0.011 |
| 81.61005 | 0.092 |
| 81.62004 | 0.182 |
| 81.63004 | 0.265 |
| 81.64005 | 0.336 |
| 81.65005 | 0.396 |
| 81.66004 | 0.45 |
| 81.67004 | 0.498 |
| 81.68005 | 0.534 |
| 81.69004 | 0.541 |
| 81.70004 | 0.503 |
| 81.71004 | 0.412 |
| 81.72005 | 0.269 |
| 81.73004 | 0.098 |
| 81.74004 | -0.07 |
| 81.75005 | -0.196 |
| 81.76004 | -0.252 |
| 81.77004 | -0.226 |
| 81.78004 | -0.125 |
| 81.79005 | 0.025 |
| 81.80004 | 0.195 |
| 81.81004 | 0.356 |
| 81.82005 | 0.488 |
| 81.83005 | 0.583 |
| 81.84004 | 0.643 |
| 81.85004 | 0.67 |
| 81.86005 | 0.664 |
| 81.87004 | 0.625 |
| 81.88004 | 0.548 |
| 81.89005 | 0.434 |
| 81.90005 | 0.291 |
| 81.91004 | 0.138 |